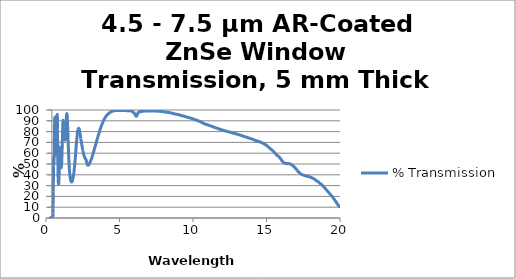
| Category | % Transmission |
|---|---|
| 0.35 | 0.622 |
| 0.351 | 0.641 |
| 0.352 | 1.043 |
| 0.353 | 0.702 |
| 0.354 | 0.658 |
| 0.355 | 0.296 |
| 0.356 | 0.783 |
| 0.357 | 0.188 |
| 0.358 | 0.807 |
| 0.359 | 0.011 |
| 0.36 | 1.343 |
| 0.361 | 0.038 |
| 0.362 | 1.088 |
| 0.363 | 0.859 |
| 0.364 | 0.007 |
| 0.365 | 0.479 |
| 0.366 | 0.336 |
| 0.367 | 0.471 |
| 0.368 | 0.921 |
| 0.369 | 0.149 |
| 0.37 | 0.717 |
| 0.371 | 0.17 |
| 0.372 | 0.52 |
| 0.373 | 0.762 |
| 0.374 | 0.137 |
| 0.375 | 0.491 |
| 0.376 | 0.288 |
| 0.377 | 0.409 |
| 0.378 | 0.55 |
| 0.379 | 0.34 |
| 0.38 | 0.217 |
| 0.381 | 0.222 |
| 0.382 | 0.535 |
| 0.383 | 0.464 |
| 0.384 | 0.695 |
| 0.385 | 0.316 |
| 0.386 | 0.381 |
| 0.387 | 0.144 |
| 0.388 | 0.62 |
| 0.389 | 0.097 |
| 0.39 | 0.343 |
| 0.391 | 0.156 |
| 0.392 | 0.131 |
| 0.393 | 0.247 |
| 0.394 | 0.219 |
| 0.395 | 0.235 |
| 0.396 | 0.12 |
| 0.397 | 0.05 |
| 0.398 | 0.304 |
| 0.399 | 0.075 |
| 0.4 | 0.185 |
| 0.401 | 0.137 |
| 0.402 | 0.178 |
| 0.403 | 0.201 |
| 0.404 | 0.224 |
| 0.405 | 0.262 |
| 0.406 | 0.268 |
| 0.407 | 0.17 |
| 0.408 | 0.143 |
| 0.409 | 0.1 |
| 0.41 | 0.095 |
| 0.411 | 0.242 |
| 0.412 | 0.115 |
| 0.413 | 0.222 |
| 0.414 | 0.034 |
| 0.415 | 0.177 |
| 0.416 | 0.094 |
| 0.417 | 0.139 |
| 0.418 | 0.282 |
| 0.419 | 0.142 |
| 0.42 | 0.172 |
| 0.421 | 0.243 |
| 0.422 | 0.192 |
| 0.423 | 0.189 |
| 0.424 | 0.047 |
| 0.425 | 0.104 |
| 0.426 | 0.083 |
| 0.427 | 0.033 |
| 0.428 | 0.165 |
| 0.429 | 0.156 |
| 0.43 | 0.144 |
| 0.431 | 0.17 |
| 0.432 | 0.025 |
| 0.433 | 0.143 |
| 0.434 | 0.084 |
| 0.435 | 0.104 |
| 0.436 | 0.087 |
| 0.437 | 0.074 |
| 0.438 | 0.094 |
| 0.439 | 0.131 |
| 0.44 | 0.077 |
| 0.441 | 0.123 |
| 0.442 | 0.116 |
| 0.443 | 0.131 |
| 0.444 | 0.124 |
| 0.445 | 0.087 |
| 0.446 | 0.091 |
| 0.447 | 0.134 |
| 0.448 | 0.118 |
| 0.449 | 0.089 |
| 0.45 | 0.075 |
| 0.451 | 0.109 |
| 0.452 | 0.083 |
| 0.453 | 0.099 |
| 0.454 | 0.085 |
| 0.455 | 0.077 |
| 0.456 | 0.111 |
| 0.457 | 0.106 |
| 0.458 | 0.095 |
| 0.459 | 0.07 |
| 0.46 | 0.059 |
| 0.461 | 0.089 |
| 0.462 | 0.067 |
| 0.463 | 0.06 |
| 0.464 | 0.119 |
| 0.465 | 0.03 |
| 0.466 | 0.042 |
| 0.467 | 0.033 |
| 0.468 | 0.027 |
| 0.469 | 0.054 |
| 0.47 | 0.06 |
| 0.471 | 0.103 |
| 0.472 | 0.075 |
| 0.473 | 0.064 |
| 0.474 | 0.247 |
| 0.475 | 0.811 |
| 0.476 | 1.718 |
| 0.477 | 2.88 |
| 0.478 | 4.327 |
| 0.479 | 5.922 |
| 0.48 | 7.427 |
| 0.481 | 8.758 |
| 0.482 | 10.011 |
| 0.483 | 11.176 |
| 0.484 | 12.182 |
| 0.485 | 13.087 |
| 0.486 | 13.987 |
| 0.487 | 14.818 |
| 0.488 | 15.672 |
| 0.489 | 16.561 |
| 0.49 | 17.527 |
| 0.491 | 18.45 |
| 0.492 | 19.474 |
| 0.493 | 20.628 |
| 0.494 | 21.798 |
| 0.495 | 23.055 |
| 0.496 | 24.372 |
| 0.497 | 25.851 |
| 0.498 | 27.406 |
| 0.499 | 29.061 |
| 0.5 | 30.764 |
| 0.501 | 32.55 |
| 0.502 | 34.49 |
| 0.503 | 36.36 |
| 0.504 | 38.292 |
| 0.505 | 40.34 |
| 0.506 | 42.312 |
| 0.507 | 44.207 |
| 0.508 | 46.035 |
| 0.509 | 47.838 |
| 0.51 | 49.408 |
| 0.511 | 50.927 |
| 0.512 | 52.253 |
| 0.513 | 53.315 |
| 0.514 | 54.255 |
| 0.515 | 54.926 |
| 0.516 | 55.442 |
| 0.517 | 55.776 |
| 0.518 | 55.905 |
| 0.519 | 55.85 |
| 0.52 | 55.672 |
| 0.521 | 55.437 |
| 0.522 | 55.036 |
| 0.523 | 54.64 |
| 0.524 | 54.144 |
| 0.525 | 53.622 |
| 0.526 | 53.096 |
| 0.527 | 52.569 |
| 0.528 | 52.063 |
| 0.529 | 51.6 |
| 0.53 | 51.223 |
| 0.531 | 50.827 |
| 0.532 | 50.54 |
| 0.533 | 50.308 |
| 0.534 | 50.131 |
| 0.535 | 50.061 |
| 0.536 | 50.017 |
| 0.537 | 50.035 |
| 0.538 | 50.125 |
| 0.539 | 50.334 |
| 0.54 | 50.589 |
| 0.541 | 50.858 |
| 0.542 | 51.243 |
| 0.543 | 51.7 |
| 0.544 | 52.147 |
| 0.545 | 52.698 |
| 0.546 | 53.315 |
| 0.547 | 53.894 |
| 0.548 | 54.654 |
| 0.549 | 55.348 |
| 0.55 | 56.122 |
| 0.551 | 56.925 |
| 0.552 | 57.751 |
| 0.553 | 58.611 |
| 0.554 | 59.498 |
| 0.555 | 60.395 |
| 0.556 | 61.295 |
| 0.557 | 62.173 |
| 0.558 | 63.071 |
| 0.559 | 64 |
| 0.56 | 64.869 |
| 0.561 | 65.775 |
| 0.562 | 66.648 |
| 0.563 | 67.501 |
| 0.564 | 68.356 |
| 0.565 | 69.234 |
| 0.566 | 70.058 |
| 0.567 | 70.918 |
| 0.568 | 71.679 |
| 0.569 | 72.475 |
| 0.57 | 73.263 |
| 0.571 | 74.058 |
| 0.572 | 74.858 |
| 0.573 | 75.615 |
| 0.574 | 76.367 |
| 0.575 | 77.154 |
| 0.576 | 77.917 |
| 0.577 | 78.713 |
| 0.578 | 79.461 |
| 0.579 | 80.297 |
| 0.58 | 81.093 |
| 0.581 | 81.899 |
| 0.582 | 82.683 |
| 0.583 | 83.516 |
| 0.584 | 84.277 |
| 0.585 | 85.175 |
| 0.586 | 85.951 |
| 0.587 | 86.771 |
| 0.588 | 87.523 |
| 0.589 | 88.298 |
| 0.59 | 89.048 |
| 0.591 | 89.749 |
| 0.592 | 90.365 |
| 0.593 | 91.021 |
| 0.594 | 91.563 |
| 0.595 | 92.03 |
| 0.596 | 92.495 |
| 0.597 | 92.785 |
| 0.598 | 93.016 |
| 0.599 | 93.155 |
| 0.6 | 93.202 |
| 0.601 | 93.155 |
| 0.602 | 92.97 |
| 0.603 | 92.643 |
| 0.604 | 92.262 |
| 0.605 | 91.773 |
| 0.606 | 91.129 |
| 0.607 | 90.437 |
| 0.608 | 89.603 |
| 0.609 | 88.692 |
| 0.61 | 87.733 |
| 0.611 | 86.642 |
| 0.612 | 85.543 |
| 0.613 | 84.308 |
| 0.614 | 83.009 |
| 0.615 | 81.828 |
| 0.616 | 80.553 |
| 0.617 | 79.191 |
| 0.618 | 77.889 |
| 0.619 | 76.625 |
| 0.62 | 75.316 |
| 0.621 | 74.07 |
| 0.622 | 72.768 |
| 0.623 | 71.61 |
| 0.624 | 70.429 |
| 0.625 | 69.253 |
| 0.626 | 68.183 |
| 0.627 | 67.163 |
| 0.628 | 66.17 |
| 0.629 | 65.205 |
| 0.63 | 64.363 |
| 0.631 | 63.54 |
| 0.632 | 62.766 |
| 0.633 | 62.074 |
| 0.634 | 61.401 |
| 0.635 | 60.812 |
| 0.636 | 60.278 |
| 0.637 | 59.794 |
| 0.638 | 59.419 |
| 0.639 | 59.066 |
| 0.64 | 58.8 |
| 0.641 | 58.555 |
| 0.642 | 58.346 |
| 0.643 | 58.222 |
| 0.644 | 58.158 |
| 0.645 | 58.195 |
| 0.646 | 58.217 |
| 0.647 | 58.335 |
| 0.648 | 58.513 |
| 0.649 | 58.747 |
| 0.65 | 59.025 |
| 0.651 | 59.369 |
| 0.652 | 59.74 |
| 0.653 | 60.177 |
| 0.654 | 60.684 |
| 0.655 | 61.211 |
| 0.656 | 61.784 |
| 0.657 | 62.5 |
| 0.658 | 63.172 |
| 0.659 | 63.886 |
| 0.66 | 64.747 |
| 0.661 | 65.573 |
| 0.662 | 66.471 |
| 0.663 | 67.424 |
| 0.664 | 68.455 |
| 0.665 | 69.471 |
| 0.666 | 70.435 |
| 0.667 | 71.548 |
| 0.668 | 72.732 |
| 0.669 | 73.846 |
| 0.67 | 75.023 |
| 0.671 | 76.219 |
| 0.672 | 77.379 |
| 0.673 | 78.539 |
| 0.674 | 79.747 |
| 0.675 | 80.925 |
| 0.676 | 82.14 |
| 0.677 | 83.269 |
| 0.678 | 84.38 |
| 0.679 | 85.522 |
| 0.68 | 86.579 |
| 0.681 | 87.6 |
| 0.682 | 88.518 |
| 0.683 | 89.424 |
| 0.684 | 90.239 |
| 0.685 | 90.909 |
| 0.686 | 91.669 |
| 0.687 | 92.215 |
| 0.688 | 92.76 |
| 0.689 | 93.141 |
| 0.69 | 93.524 |
| 0.691 | 93.811 |
| 0.692 | 93.951 |
| 0.693 | 94.011 |
| 0.694 | 94.034 |
| 0.695 | 93.946 |
| 0.696 | 93.864 |
| 0.697 | 93.553 |
| 0.698 | 93.362 |
| 0.699 | 92.963 |
| 0.7 | 92.574 |
| 0.701 | 92.19 |
| 0.702 | 91.644 |
| 0.703 | 91.155 |
| 0.704 | 90.585 |
| 0.705 | 90.09 |
| 0.706 | 89.506 |
| 0.707 | 88.925 |
| 0.708 | 88.363 |
| 0.709 | 87.723 |
| 0.71 | 87.126 |
| 0.711 | 86.614 |
| 0.712 | 86.009 |
| 0.713 | 85.489 |
| 0.714 | 85.001 |
| 0.715 | 84.487 |
| 0.716 | 84.026 |
| 0.717 | 83.557 |
| 0.718 | 83.17 |
| 0.719 | 82.749 |
| 0.72 | 82.457 |
| 0.721 | 82.164 |
| 0.722 | 81.858 |
| 0.723 | 81.624 |
| 0.724 | 81.435 |
| 0.725 | 81.241 |
| 0.726 | 81.148 |
| 0.727 | 81.085 |
| 0.728 | 81.034 |
| 0.729 | 81.033 |
| 0.73 | 81.074 |
| 0.731 | 81.171 |
| 0.732 | 81.29 |
| 0.733 | 81.47 |
| 0.734 | 81.657 |
| 0.735 | 81.908 |
| 0.736 | 82.177 |
| 0.737 | 82.509 |
| 0.738 | 82.84 |
| 0.739 | 83.275 |
| 0.74 | 83.693 |
| 0.741 | 84.134 |
| 0.742 | 84.654 |
| 0.743 | 85.125 |
| 0.744 | 85.682 |
| 0.745 | 86.264 |
| 0.746 | 86.833 |
| 0.747 | 87.431 |
| 0.748 | 88.057 |
| 0.749 | 88.646 |
| 0.75 | 89.282 |
| 0.751 | 89.895 |
| 0.752 | 90.509 |
| 0.753 | 91.104 |
| 0.754 | 91.754 |
| 0.755 | 92.333 |
| 0.756 | 92.858 |
| 0.757 | 93.406 |
| 0.758 | 93.873 |
| 0.759 | 94.31 |
| 0.76 | 94.722 |
| 0.761 | 95.073 |
| 0.762 | 95.385 |
| 0.763 | 95.599 |
| 0.764 | 95.73 |
| 0.765 | 95.823 |
| 0.766 | 95.821 |
| 0.767 | 95.761 |
| 0.768 | 95.607 |
| 0.769 | 95.348 |
| 0.77 | 95.02 |
| 0.771 | 94.581 |
| 0.772 | 94.12 |
| 0.773 | 93.485 |
| 0.774 | 92.801 |
| 0.775 | 92.064 |
| 0.776 | 91.185 |
| 0.777 | 90.261 |
| 0.778 | 89.322 |
| 0.779 | 88.216 |
| 0.78 | 87.063 |
| 0.781 | 85.899 |
| 0.782 | 84.646 |
| 0.783 | 83.358 |
| 0.784 | 82.11 |
| 0.785 | 80.699 |
| 0.786 | 79.288 |
| 0.787 | 77.94 |
| 0.788 | 76.503 |
| 0.789 | 75.068 |
| 0.79 | 73.629 |
| 0.791 | 72.203 |
| 0.792 | 70.732 |
| 0.793 | 69.316 |
| 0.794 | 67.929 |
| 0.795 | 66.517 |
| 0.796 | 65.138 |
| 0.797 | 63.777 |
| 0.798 | 62.424 |
| 0.799 | 61.129 |
| 0.8 | 59.805 |
| 0.801 | 58.58 |
| 0.802 | 57.343 |
| 0.803 | 56.199 |
| 0.804 | 55.011 |
| 0.805 | 53.863 |
| 0.806 | 52.819 |
| 0.807 | 51.76 |
| 0.808 | 50.721 |
| 0.809 | 49.74 |
| 0.81 | 48.803 |
| 0.811 | 47.849 |
| 0.812 | 46.968 |
| 0.813 | 46.14 |
| 0.814 | 45.291 |
| 0.815 | 44.486 |
| 0.816 | 43.745 |
| 0.817 | 42.993 |
| 0.818 | 42.273 |
| 0.819 | 41.629 |
| 0.82 | 40.962 |
| 0.821 | 40.337 |
| 0.822 | 39.749 |
| 0.823 | 39.184 |
| 0.824 | 38.614 |
| 0.825 | 38.113 |
| 0.826 | 37.624 |
| 0.827 | 37.137 |
| 0.828 | 36.693 |
| 0.829 | 36.272 |
| 0.83 | 35.851 |
| 0.831 | 35.476 |
| 0.832 | 35.119 |
| 0.833 | 34.767 |
| 0.834 | 34.439 |
| 0.835 | 34.133 |
| 0.836 | 33.845 |
| 0.837 | 33.573 |
| 0.838 | 33.33 |
| 0.839 | 33.088 |
| 0.84 | 32.863 |
| 0.841 | 32.676 |
| 0.842 | 32.474 |
| 0.843 | 32.299 |
| 0.844 | 32.15 |
| 0.845 | 32.01 |
| 0.846 | 31.889 |
| 0.847 | 31.771 |
| 0.848 | 31.684 |
| 0.849 | 31.588 |
| 0.85 | 31.514 |
| 0.851 | 31.47 |
| 0.852 | 31.422 |
| 0.853 | 31.395 |
| 0.854 | 31.377 |
| 0.855 | 31.376 |
| 0.856 | 31.386 |
| 0.857 | 31.402 |
| 0.858 | 31.446 |
| 0.859 | 31.497 |
| 0.86 | 31.547 |
| 0.861 | 31.63 |
| 0.862 | 31.71 |
| 0.863 | 31.806 |
| 0.864 | 31.92 |
| 0.865 | 32.035 |
| 0.866 | 32.167 |
| 0.867 | 32.314 |
| 0.868 | 32.479 |
| 0.869 | 32.652 |
| 0.87 | 32.826 |
| 0.871 | 33.034 |
| 0.872 | 33.235 |
| 0.873 | 33.452 |
| 0.874 | 33.678 |
| 0.875 | 33.929 |
| 0.876 | 34.184 |
| 0.877 | 34.455 |
| 0.878 | 34.735 |
| 0.879 | 35.018 |
| 0.88 | 35.335 |
| 0.881 | 35.664 |
| 0.882 | 35.983 |
| 0.883 | 36.33 |
| 0.884 | 36.679 |
| 0.885 | 37.051 |
| 0.886 | 37.43 |
| 0.887 | 37.826 |
| 0.888 | 38.217 |
| 0.889 | 38.635 |
| 0.89 | 39.073 |
| 0.891 | 39.504 |
| 0.892 | 39.949 |
| 0.893 | 40.426 |
| 0.894 | 40.902 |
| 0.895 | 41.374 |
| 0.896 | 41.88 |
| 0.897 | 42.381 |
| 0.898 | 42.887 |
| 0.899 | 43.424 |
| 0.9 | 43.971 |
| 0.901 | 44.498 |
| 0.902 | 45.056 |
| 0.903 | 45.621 |
| 0.904 | 46.189 |
| 0.905 | 46.772 |
| 0.906 | 47.38 |
| 0.907 | 47.948 |
| 0.908 | 48.543 |
| 0.909 | 49.156 |
| 0.91 | 49.753 |
| 0.911 | 50.356 |
| 0.912 | 50.99 |
| 0.913 | 51.597 |
| 0.914 | 52.194 |
| 0.915 | 52.798 |
| 0.916 | 53.434 |
| 0.917 | 54.014 |
| 0.918 | 54.644 |
| 0.919 | 55.246 |
| 0.92 | 55.816 |
| 0.921 | 56.401 |
| 0.922 | 56.997 |
| 0.923 | 57.542 |
| 0.924 | 58.102 |
| 0.925 | 58.668 |
| 0.926 | 59.186 |
| 0.927 | 59.703 |
| 0.928 | 60.21 |
| 0.929 | 60.673 |
| 0.93 | 61.126 |
| 0.931 | 61.606 |
| 0.932 | 62.005 |
| 0.933 | 62.389 |
| 0.934 | 62.782 |
| 0.935 | 63.143 |
| 0.936 | 63.462 |
| 0.937 | 63.766 |
| 0.938 | 64.063 |
| 0.939 | 64.308 |
| 0.94 | 64.525 |
| 0.941 | 64.725 |
| 0.942 | 64.909 |
| 0.943 | 65.052 |
| 0.944 | 65.178 |
| 0.945 | 65.268 |
| 0.946 | 65.331 |
| 0.947 | 65.384 |
| 0.948 | 65.392 |
| 0.949 | 65.386 |
| 0.95 | 65.336 |
| 0.951 | 65.299 |
| 0.952 | 65.204 |
| 0.953 | 65.103 |
| 0.954 | 64.962 |
| 0.955 | 64.82 |
| 0.956 | 64.642 |
| 0.957 | 64.439 |
| 0.958 | 64.25 |
| 0.959 | 64.015 |
| 0.96 | 63.765 |
| 0.961 | 63.522 |
| 0.962 | 63.23 |
| 0.963 | 62.946 |
| 0.964 | 62.658 |
| 0.965 | 62.346 |
| 0.966 | 62.02 |
| 0.967 | 61.698 |
| 0.968 | 61.353 |
| 0.969 | 60.993 |
| 0.97 | 60.644 |
| 0.971 | 60.285 |
| 0.972 | 59.931 |
| 0.973 | 59.55 |
| 0.974 | 59.193 |
| 0.975 | 58.805 |
| 0.976 | 58.428 |
| 0.977 | 58.063 |
| 0.978 | 57.701 |
| 0.979 | 57.308 |
| 0.98 | 56.928 |
| 0.981 | 56.58 |
| 0.982 | 56.187 |
| 0.983 | 55.842 |
| 0.984 | 55.478 |
| 0.985 | 55.123 |
| 0.986 | 54.773 |
| 0.987 | 54.426 |
| 0.988 | 54.069 |
| 0.989 | 53.762 |
| 0.99 | 53.407 |
| 0.991 | 53.089 |
| 0.992 | 52.779 |
| 0.993 | 52.457 |
| 0.994 | 52.16 |
| 0.995 | 51.859 |
| 0.996 | 51.565 |
| 0.997 | 51.285 |
| 0.998 | 51.015 |
| 0.999 | 50.761 |
| 1.0 | 50.486 |
| 1.001 | 50.238 |
| 1.002 | 49.999 |
| 1.003 | 49.772 |
| 1.004 | 49.534 |
| 1.005 | 49.327 |
| 1.006 | 49.119 |
| 1.007 | 48.899 |
| 1.008 | 48.717 |
| 1.009 | 48.541 |
| 1.01 | 48.361 |
| 1.011 | 48.191 |
| 1.012 | 48.033 |
| 1.013 | 47.879 |
| 1.014 | 47.737 |
| 1.015 | 47.605 |
| 1.016 | 47.485 |
| 1.017 | 47.364 |
| 1.018 | 47.25 |
| 1.019 | 47.154 |
| 1.02 | 47.054 |
| 1.021 | 46.977 |
| 1.022 | 46.9 |
| 1.023 | 46.829 |
| 1.024 | 46.769 |
| 1.025 | 46.725 |
| 1.026 | 46.67 |
| 1.027 | 46.651 |
| 1.028 | 46.595 |
| 1.029 | 46.601 |
| 1.03 | 46.58 |
| 1.031 | 46.578 |
| 1.032 | 46.574 |
| 1.033 | 46.597 |
| 1.034 | 46.617 |
| 1.035 | 46.645 |
| 1.036 | 46.681 |
| 1.037 | 46.737 |
| 1.038 | 46.798 |
| 1.039 | 46.848 |
| 1.04 | 46.915 |
| 1.041 | 46.993 |
| 1.042 | 47.08 |
| 1.043 | 47.169 |
| 1.044 | 47.273 |
| 1.045 | 47.377 |
| 1.046 | 47.492 |
| 1.047 | 47.619 |
| 1.048 | 47.744 |
| 1.049 | 47.883 |
| 1.05 | 48.129 |
| 1.051 | 48.298 |
| 1.052 | 48.46 |
| 1.053 | 48.631 |
| 1.054 | 48.803 |
| 1.055 | 48.997 |
| 1.056 | 49.18 |
| 1.057 | 49.386 |
| 1.058 | 49.595 |
| 1.059 | 49.807 |
| 1.06 | 50.042 |
| 1.061 | 50.259 |
| 1.062 | 50.503 |
| 1.063 | 50.758 |
| 1.064 | 51.013 |
| 1.065 | 51.283 |
| 1.066 | 51.551 |
| 1.067 | 51.829 |
| 1.068 | 52.118 |
| 1.069 | 52.408 |
| 1.07 | 52.723 |
| 1.071 | 53.033 |
| 1.072 | 53.346 |
| 1.073 | 53.675 |
| 1.074 | 54.01 |
| 1.075 | 54.349 |
| 1.076 | 54.701 |
| 1.077 | 55.066 |
| 1.078 | 55.426 |
| 1.079 | 55.782 |
| 1.08 | 56.183 |
| 1.081 | 56.554 |
| 1.082 | 56.966 |
| 1.083 | 57.349 |
| 1.084 | 57.746 |
| 1.085 | 58.177 |
| 1.086 | 58.609 |
| 1.087 | 59.008 |
| 1.088 | 59.441 |
| 1.089 | 59.895 |
| 1.09 | 60.341 |
| 1.091 | 60.792 |
| 1.092 | 61.258 |
| 1.093 | 61.704 |
| 1.094 | 62.17 |
| 1.095 | 62.647 |
| 1.096 | 63.148 |
| 1.097 | 63.606 |
| 1.098 | 64.115 |
| 1.099 | 64.59 |
| 1.1 | 65.115 |
| 1.101 | 65.58 |
| 1.102 | 66.162 |
| 1.103 | 66.595 |
| 1.104 | 67.144 |
| 1.105 | 67.654 |
| 1.106 | 68.181 |
| 1.107 | 68.712 |
| 1.108 | 69.231 |
| 1.109 | 69.75 |
| 1.11 | 70.269 |
| 1.111 | 70.818 |
| 1.112 | 71.335 |
| 1.113 | 71.856 |
| 1.114 | 72.428 |
| 1.115 | 72.951 |
| 1.116 | 73.445 |
| 1.117 | 74.006 |
| 1.118 | 74.545 |
| 1.119 | 75 |
| 1.12 | 75.599 |
| 1.121 | 76.137 |
| 1.122 | 76.588 |
| 1.123 | 77.189 |
| 1.124 | 77.66 |
| 1.125 | 78.132 |
| 1.126 | 78.68 |
| 1.127 | 79.166 |
| 1.128 | 79.673 |
| 1.129 | 80.119 |
| 1.13 | 80.621 |
| 1.131 | 81.111 |
| 1.132 | 81.512 |
| 1.133 | 82.031 |
| 1.134 | 82.458 |
| 1.135 | 82.872 |
| 1.136 | 83.327 |
| 1.137 | 83.731 |
| 1.138 | 84.14 |
| 1.139 | 84.558 |
| 1.14 | 84.948 |
| 1.141 | 85.318 |
| 1.142 | 85.666 |
| 1.143 | 86.019 |
| 1.144 | 86.371 |
| 1.145 | 86.703 |
| 1.146 | 87.022 |
| 1.147 | 87.302 |
| 1.148 | 87.635 |
| 1.149 | 87.9 |
| 1.15 | 88.149 |
| 1.151 | 88.437 |
| 1.152 | 88.656 |
| 1.153 | 88.83 |
| 1.154 | 89.109 |
| 1.155 | 89.256 |
| 1.156 | 89.38 |
| 1.157 | 89.631 |
| 1.158 | 89.74 |
| 1.159 | 89.838 |
| 1.16 | 89.992 |
| 1.161 | 90.178 |
| 1.162 | 90.188 |
| 1.163 | 90.284 |
| 1.164 | 90.346 |
| 1.165 | 90.386 |
| 1.166 | 90.406 |
| 1.167 | 90.452 |
| 1.168 | 90.416 |
| 1.169 | 90.432 |
| 1.17 | 90.453 |
| 1.171 | 90.391 |
| 1.172 | 90.329 |
| 1.173 | 90.301 |
| 1.174 | 90.211 |
| 1.175 | 90.125 |
| 1.176 | 90.029 |
| 1.177 | 89.918 |
| 1.178 | 89.842 |
| 1.179 | 89.685 |
| 1.18 | 89.537 |
| 1.181 | 89.403 |
| 1.182 | 89.236 |
| 1.183 | 89.139 |
| 1.184 | 88.908 |
| 1.185 | 88.722 |
| 1.186 | 88.557 |
| 1.187 | 88.363 |
| 1.188 | 88.17 |
| 1.189 | 87.924 |
| 1.19 | 87.717 |
| 1.191 | 87.488 |
| 1.192 | 87.306 |
| 1.193 | 87.029 |
| 1.194 | 86.804 |
| 1.195 | 86.578 |
| 1.196 | 86.335 |
| 1.197 | 86.051 |
| 1.198 | 85.839 |
| 1.199 | 85.556 |
| 1.2 | 85.314 |
| 1.201 | 85.047 |
| 1.202 | 84.695 |
| 1.203 | 84.527 |
| 1.204 | 84.266 |
| 1.205 | 84.071 |
| 1.206 | 83.722 |
| 1.207 | 83.45 |
| 1.208 | 83.2 |
| 1.209 | 82.802 |
| 1.21 | 82.685 |
| 1.211 | 82.388 |
| 1.212 | 82.112 |
| 1.213 | 81.853 |
| 1.214 | 81.579 |
| 1.215 | 81.286 |
| 1.216 | 81.052 |
| 1.217 | 80.796 |
| 1.218 | 80.561 |
| 1.219 | 80.234 |
| 1.22 | 80.034 |
| 1.221 | 79.767 |
| 1.222 | 79.511 |
| 1.223 | 79.303 |
| 1.224 | 79.049 |
| 1.225 | 78.725 |
| 1.226 | 78.552 |
| 1.227 | 78.299 |
| 1.228 | 78.095 |
| 1.229 | 77.873 |
| 1.23 | 77.614 |
| 1.231 | 77.339 |
| 1.232 | 77.172 |
| 1.233 | 76.993 |
| 1.234 | 76.772 |
| 1.235 | 76.541 |
| 1.236 | 76.339 |
| 1.237 | 76.092 |
| 1.238 | 75.936 |
| 1.239 | 75.799 |
| 1.24 | 75.554 |
| 1.241 | 75.373 |
| 1.242 | 75.2 |
| 1.243 | 74.984 |
| 1.244 | 74.862 |
| 1.245 | 74.708 |
| 1.246 | 74.535 |
| 1.247 | 74.389 |
| 1.248 | 74.241 |
| 1.249 | 74.116 |
| 1.25 | 74.02 |
| 1.251 | 73.802 |
| 1.252 | 73.704 |
| 1.253 | 73.586 |
| 1.254 | 73.457 |
| 1.255 | 73.344 |
| 1.256 | 73.233 |
| 1.257 | 73.091 |
| 1.258 | 73.033 |
| 1.259 | 72.955 |
| 1.26 | 72.844 |
| 1.261 | 72.766 |
| 1.262 | 72.681 |
| 1.263 | 72.625 |
| 1.264 | 72.535 |
| 1.265 | 72.485 |
| 1.266 | 72.373 |
| 1.267 | 72.348 |
| 1.268 | 72.312 |
| 1.269 | 72.275 |
| 1.27 | 72.221 |
| 1.271 | 72.195 |
| 1.272 | 72.138 |
| 1.273 | 72.104 |
| 1.274 | 72.103 |
| 1.275 | 72.101 |
| 1.276 | 72.095 |
| 1.277 | 72.076 |
| 1.278 | 72.086 |
| 1.279 | 72.08 |
| 1.28 | 72.08 |
| 1.281 | 72.122 |
| 1.282 | 72.106 |
| 1.283 | 72.166 |
| 1.284 | 72.183 |
| 1.285 | 72.214 |
| 1.286 | 72.264 |
| 1.287 | 72.291 |
| 1.288 | 72.331 |
| 1.289 | 72.366 |
| 1.29 | 72.445 |
| 1.291 | 72.515 |
| 1.292 | 72.582 |
| 1.293 | 72.642 |
| 1.294 | 72.718 |
| 1.295 | 72.798 |
| 1.296 | 72.871 |
| 1.297 | 72.975 |
| 1.298 | 73.079 |
| 1.299 | 73.158 |
| 1.3 | 73.268 |
| 1.301 | 73.368 |
| 1.302 | 73.472 |
| 1.303 | 73.605 |
| 1.304 | 73.721 |
| 1.305 | 73.857 |
| 1.306 | 74.005 |
| 1.307 | 74.114 |
| 1.308 | 74.248 |
| 1.309 | 74.399 |
| 1.31 | 74.525 |
| 1.311 | 74.714 |
| 1.312 | 74.862 |
| 1.313 | 75.018 |
| 1.314 | 75.181 |
| 1.315 | 75.341 |
| 1.316 | 75.472 |
| 1.317 | 75.693 |
| 1.318 | 75.89 |
| 1.319 | 76.067 |
| 1.32 | 76.242 |
| 1.321 | 76.439 |
| 1.322 | 76.628 |
| 1.323 | 76.865 |
| 1.324 | 77.022 |
| 1.325 | 77.242 |
| 1.326 | 77.448 |
| 1.327 | 77.662 |
| 1.328 | 77.879 |
| 1.329 | 78.104 |
| 1.33 | 78.329 |
| 1.331 | 78.541 |
| 1.332 | 78.787 |
| 1.333 | 79.023 |
| 1.334 | 79.229 |
| 1.335 | 79.478 |
| 1.336 | 79.72 |
| 1.337 | 79.96 |
| 1.338 | 80.213 |
| 1.339 | 80.472 |
| 1.34 | 80.71 |
| 1.341 | 80.981 |
| 1.342 | 81.201 |
| 1.343 | 81.439 |
| 1.344 | 81.776 |
| 1.345 | 81.988 |
| 1.346 | 82.251 |
| 1.347 | 82.512 |
| 1.348 | 82.817 |
| 1.349 | 83.073 |
| 1.35 | 83.326 |
| 1.351 | 83.596 |
| 1.352 | 83.904 |
| 1.353 | 84.119 |
| 1.354 | 84.422 |
| 1.355 | 84.673 |
| 1.356 | 84.958 |
| 1.357 | 85.218 |
| 1.358 | 85.515 |
| 1.359 | 85.742 |
| 1.36 | 86.04 |
| 1.361 | 86.36 |
| 1.362 | 86.613 |
| 1.363 | 86.885 |
| 1.364 | 87.175 |
| 1.365 | 87.44 |
| 1.366 | 87.738 |
| 1.367 | 88.013 |
| 1.368 | 88.298 |
| 1.369 | 88.576 |
| 1.37 | 88.859 |
| 1.371 | 89.102 |
| 1.372 | 89.378 |
| 1.373 | 89.654 |
| 1.374 | 89.943 |
| 1.375 | 90.146 |
| 1.376 | 90.42 |
| 1.377 | 90.696 |
| 1.378 | 90.923 |
| 1.379 | 91.135 |
| 1.38 | 91.398 |
| 1.381 | 91.65 |
| 1.382 | 91.882 |
| 1.383 | 92.154 |
| 1.384 | 92.349 |
| 1.385 | 92.647 |
| 1.386 | 92.839 |
| 1.387 | 93.011 |
| 1.388 | 93.264 |
| 1.389 | 93.473 |
| 1.39 | 93.662 |
| 1.391 | 93.863 |
| 1.392 | 94.067 |
| 1.393 | 94.239 |
| 1.394 | 94.432 |
| 1.395 | 94.658 |
| 1.396 | 94.762 |
| 1.397 | 94.877 |
| 1.398 | 95.094 |
| 1.399 | 95.26 |
| 1.4 | 95.421 |
| 1.401 | 95.534 |
| 1.402 | 95.64 |
| 1.403 | 95.803 |
| 1.404 | 95.93 |
| 1.405 | 96.032 |
| 1.406 | 96.089 |
| 1.407 | 96.231 |
| 1.408 | 96.309 |
| 1.409 | 96.389 |
| 1.41 | 96.46 |
| 1.411 | 96.521 |
| 1.412 | 96.565 |
| 1.413 | 96.603 |
| 1.414 | 96.625 |
| 1.415 | 96.669 |
| 1.416 | 96.656 |
| 1.417 | 96.705 |
| 1.418 | 96.705 |
| 1.419 | 96.648 |
| 1.42 | 96.649 |
| 1.421 | 96.621 |
| 1.422 | 96.625 |
| 1.423 | 96.532 |
| 1.424 | 96.49 |
| 1.425 | 96.433 |
| 1.426 | 96.352 |
| 1.427 | 96.272 |
| 1.428 | 96.205 |
| 1.429 | 96.097 |
| 1.43 | 95.987 |
| 1.431 | 95.855 |
| 1.432 | 95.749 |
| 1.433 | 95.633 |
| 1.434 | 95.495 |
| 1.435 | 95.339 |
| 1.436 | 95.191 |
| 1.437 | 95.012 |
| 1.438 | 94.822 |
| 1.439 | 94.635 |
| 1.44 | 94.439 |
| 1.441 | 94.238 |
| 1.442 | 94.004 |
| 1.443 | 93.806 |
| 1.444 | 93.573 |
| 1.445 | 93.348 |
| 1.446 | 93.109 |
| 1.447 | 92.885 |
| 1.448 | 92.616 |
| 1.449 | 92.347 |
| 1.45 | 92.097 |
| 1.451 | 91.813 |
| 1.452 | 91.529 |
| 1.453 | 91.225 |
| 1.454 | 90.964 |
| 1.455 | 90.644 |
| 1.456 | 90.386 |
| 1.457 | 90.02 |
| 1.458 | 89.692 |
| 1.459 | 89.387 |
| 1.46 | 89.044 |
| 1.461 | 88.698 |
| 1.462 | 88.37 |
| 1.463 | 88.045 |
| 1.464 | 87.683 |
| 1.465 | 87.312 |
| 1.466 | 86.954 |
| 1.467 | 86.607 |
| 1.468 | 86.25 |
| 1.469 | 85.832 |
| 1.47 | 85.458 |
| 1.471 | 85.089 |
| 1.472 | 84.738 |
| 1.473 | 84.35 |
| 1.474 | 83.955 |
| 1.475 | 83.554 |
| 1.476 | 83.16 |
| 1.477 | 82.758 |
| 1.478 | 82.379 |
| 1.479 | 81.982 |
| 1.48 | 81.582 |
| 1.481 | 81.137 |
| 1.482 | 80.788 |
| 1.483 | 80.333 |
| 1.484 | 79.974 |
| 1.485 | 79.56 |
| 1.486 | 79.124 |
| 1.487 | 78.706 |
| 1.488 | 78.3 |
| 1.489 | 77.88 |
| 1.49 | 77.487 |
| 1.491 | 77.064 |
| 1.492 | 76.656 |
| 1.493 | 76.26 |
| 1.494 | 75.81 |
| 1.495 | 75.411 |
| 1.496 | 74.973 |
| 1.497 | 74.584 |
| 1.498 | 74.174 |
| 1.499 | 73.777 |
| 1.5 | 73.332 |
| 1.501 | 72.928 |
| 1.502 | 72.531 |
| 1.503 | 72.097 |
| 1.504 | 71.705 |
| 1.505 | 71.303 |
| 1.506 | 70.903 |
| 1.507 | 70.465 |
| 1.508 | 70.091 |
| 1.509 | 69.684 |
| 1.51 | 69.302 |
| 1.511 | 68.897 |
| 1.512 | 68.482 |
| 1.513 | 68.102 |
| 1.514 | 67.715 |
| 1.515 | 67.348 |
| 1.516 | 66.931 |
| 1.517 | 66.569 |
| 1.518 | 66.155 |
| 1.519 | 65.758 |
| 1.52 | 65.387 |
| 1.521 | 65.037 |
| 1.522 | 64.655 |
| 1.523 | 64.281 |
| 1.524 | 63.897 |
| 1.525 | 63.564 |
| 1.526 | 63.179 |
| 1.527 | 62.811 |
| 1.528 | 62.463 |
| 1.529 | 62.118 |
| 1.53 | 61.735 |
| 1.531 | 61.39 |
| 1.532 | 61.068 |
| 1.533 | 60.699 |
| 1.534 | 60.38 |
| 1.535 | 60.008 |
| 1.536 | 59.704 |
| 1.537 | 59.336 |
| 1.538 | 59.01 |
| 1.539 | 58.686 |
| 1.54 | 58.355 |
| 1.541 | 58.024 |
| 1.542 | 57.73 |
| 1.543 | 57.389 |
| 1.544 | 57.016 |
| 1.545 | 56.777 |
| 1.546 | 56.452 |
| 1.547 | 56.135 |
| 1.548 | 55.79 |
| 1.549 | 55.553 |
| 1.55 | 55.222 |
| 1.551 | 54.915 |
| 1.552 | 54.63 |
| 1.553 | 54.342 |
| 1.554 | 54.053 |
| 1.555 | 53.786 |
| 1.556 | 53.492 |
| 1.557 | 53.199 |
| 1.558 | 52.926 |
| 1.559 | 52.648 |
| 1.56 | 52.367 |
| 1.561 | 52.114 |
| 1.562 | 51.839 |
| 1.563 | 51.556 |
| 1.564 | 51.32 |
| 1.565 | 51.041 |
| 1.566 | 50.784 |
| 1.567 | 50.564 |
| 1.568 | 50.289 |
| 1.569 | 50.023 |
| 1.57 | 49.799 |
| 1.571 | 49.575 |
| 1.572 | 49.291 |
| 1.573 | 49.053 |
| 1.574 | 48.855 |
| 1.575 | 48.594 |
| 1.576 | 48.317 |
| 1.577 | 48.158 |
| 1.578 | 47.901 |
| 1.579 | 47.667 |
| 1.58 | 47.459 |
| 1.581 | 47.254 |
| 1.582 | 47.006 |
| 1.583 | 46.796 |
| 1.584 | 46.616 |
| 1.585 | 46.377 |
| 1.586 | 46.164 |
| 1.587 | 45.983 |
| 1.588 | 45.766 |
| 1.589 | 45.568 |
| 1.59 | 45.363 |
| 1.591 | 45.177 |
| 1.592 | 44.992 |
| 1.593 | 44.766 |
| 1.594 | 44.593 |
| 1.595 | 44.422 |
| 1.596 | 44.223 |
| 1.597 | 44.026 |
| 1.598 | 43.871 |
| 1.599 | 43.676 |
| 1.6 | 43.497 |
| 1.601 | 43.337 |
| 1.602 | 43.144 |
| 1.603 | 42.976 |
| 1.604 | 42.82 |
| 1.605 | 42.656 |
| 1.606 | 42.466 |
| 1.607 | 42.326 |
| 1.608 | 42.169 |
| 1.609 | 42.001 |
| 1.61 | 41.856 |
| 1.611 | 41.7 |
| 1.612 | 41.53 |
| 1.613 | 41.383 |
| 1.614 | 41.233 |
| 1.615 | 41.099 |
| 1.616 | 40.946 |
| 1.617 | 40.812 |
| 1.618 | 40.669 |
| 1.619 | 40.508 |
| 1.62 | 40.384 |
| 1.621 | 40.263 |
| 1.622 | 40.105 |
| 1.623 | 39.979 |
| 1.624 | 39.856 |
| 1.625 | 39.726 |
| 1.626 | 39.587 |
| 1.627 | 39.47 |
| 1.628 | 39.331 |
| 1.629 | 39.227 |
| 1.63 | 39.107 |
| 1.631 | 38.973 |
| 1.632 | 38.849 |
| 1.633 | 38.747 |
| 1.634 | 38.628 |
| 1.635 | 38.525 |
| 1.636 | 38.383 |
| 1.637 | 38.315 |
| 1.638 | 38.181 |
| 1.639 | 38.071 |
| 1.64 | 37.969 |
| 1.641 | 37.876 |
| 1.642 | 37.759 |
| 1.643 | 37.659 |
| 1.644 | 37.562 |
| 1.645 | 37.464 |
| 1.646 | 37.361 |
| 1.647 | 37.293 |
| 1.648 | 37.179 |
| 1.649 | 37.087 |
| 1.65 | 37.008 |
| 1.651 | 36.911 |
| 1.652 | 36.804 |
| 1.653 | 36.716 |
| 1.654 | 36.655 |
| 1.655 | 36.575 |
| 1.656 | 36.458 |
| 1.657 | 36.406 |
| 1.658 | 36.308 |
| 1.659 | 36.214 |
| 1.66 | 36.173 |
| 1.661 | 36.082 |
| 1.662 | 36.001 |
| 1.663 | 35.935 |
| 1.664 | 35.852 |
| 1.665 | 35.786 |
| 1.666 | 35.715 |
| 1.667 | 35.638 |
| 1.668 | 35.58 |
| 1.669 | 35.502 |
| 1.67 | 35.433 |
| 1.671 | 35.379 |
| 1.672 | 35.323 |
| 1.673 | 35.253 |
| 1.674 | 35.186 |
| 1.675 | 35.137 |
| 1.676 | 35.08 |
| 1.677 | 35.002 |
| 1.678 | 34.947 |
| 1.679 | 34.914 |
| 1.68 | 34.847 |
| 1.681 | 34.782 |
| 1.682 | 34.749 |
| 1.683 | 34.691 |
| 1.684 | 34.622 |
| 1.685 | 34.585 |
| 1.686 | 34.532 |
| 1.687 | 34.494 |
| 1.688 | 34.449 |
| 1.689 | 34.397 |
| 1.69 | 34.355 |
| 1.691 | 34.314 |
| 1.692 | 34.26 |
| 1.693 | 34.234 |
| 1.694 | 34.18 |
| 1.695 | 34.15 |
| 1.696 | 34.118 |
| 1.697 | 34.082 |
| 1.698 | 34.034 |
| 1.699 | 33.996 |
| 1.7 | 33.964 |
| 1.701 | 33.939 |
| 1.702 | 33.923 |
| 1.703 | 33.848 |
| 1.704 | 33.848 |
| 1.705 | 33.809 |
| 1.706 | 33.79 |
| 1.707 | 33.757 |
| 1.708 | 33.725 |
| 1.709 | 33.702 |
| 1.71 | 33.688 |
| 1.711 | 33.643 |
| 1.712 | 33.63 |
| 1.713 | 33.606 |
| 1.714 | 33.587 |
| 1.715 | 33.567 |
| 1.716 | 33.538 |
| 1.717 | 33.518 |
| 1.718 | 33.508 |
| 1.719 | 33.488 |
| 1.72 | 33.48 |
| 1.721 | 33.461 |
| 1.722 | 33.445 |
| 1.723 | 33.429 |
| 1.724 | 33.41 |
| 1.725 | 33.403 |
| 1.726 | 33.387 |
| 1.727 | 33.382 |
| 1.728 | 33.376 |
| 1.729 | 33.365 |
| 1.73 | 33.364 |
| 1.731 | 33.346 |
| 1.732 | 33.344 |
| 1.733 | 33.343 |
| 1.734 | 33.337 |
| 1.735 | 33.322 |
| 1.736 | 33.336 |
| 1.737 | 33.316 |
| 1.738 | 33.325 |
| 1.739 | 33.322 |
| 1.74 | 33.312 |
| 1.741 | 33.319 |
| 1.742 | 33.314 |
| 1.743 | 33.337 |
| 1.744 | 33.321 |
| 1.745 | 33.327 |
| 1.746 | 33.344 |
| 1.747 | 33.338 |
| 1.748 | 33.353 |
| 1.749 | 33.358 |
| 1.75 | 33.362 |
| 1.751 | 33.371 |
| 1.752 | 33.373 |
| 1.753 | 33.4 |
| 1.754 | 33.397 |
| 1.755 | 33.402 |
| 1.756 | 33.429 |
| 1.757 | 33.436 |
| 1.758 | 33.447 |
| 1.759 | 33.464 |
| 1.76 | 33.473 |
| 1.761 | 33.503 |
| 1.762 | 33.515 |
| 1.763 | 33.526 |
| 1.764 | 33.532 |
| 1.765 | 33.573 |
| 1.766 | 33.579 |
| 1.767 | 33.598 |
| 1.768 | 33.617 |
| 1.769 | 33.66 |
| 1.77 | 33.666 |
| 1.771 | 33.683 |
| 1.772 | 33.725 |
| 1.773 | 33.737 |
| 1.774 | 33.763 |
| 1.775 | 33.793 |
| 1.776 | 33.805 |
| 1.777 | 33.856 |
| 1.778 | 33.876 |
| 1.779 | 33.893 |
| 1.78 | 33.934 |
| 1.781 | 33.959 |
| 1.782 | 33.98 |
| 1.783 | 34.036 |
| 1.784 | 34.052 |
| 1.785 | 34.074 |
| 1.786 | 34.136 |
| 1.787 | 34.154 |
| 1.788 | 34.188 |
| 1.789 | 34.226 |
| 1.79 | 34.268 |
| 1.791 | 34.298 |
| 1.792 | 34.341 |
| 1.793 | 34.373 |
| 1.794 | 34.413 |
| 1.795 | 34.456 |
| 1.796 | 34.499 |
| 1.797 | 34.544 |
| 1.798 | 34.575 |
| 1.799 | 34.619 |
| 1.8 | 34.654 |
| 1.801 | 34.71 |
| 1.802 | 34.742 |
| 1.803 | 34.802 |
| 1.804 | 34.842 |
| 1.805 | 34.884 |
| 1.806 | 34.929 |
| 1.807 | 34.987 |
| 1.808 | 35.027 |
| 1.809 | 35.084 |
| 1.81 | 35.126 |
| 1.811 | 35.165 |
| 1.812 | 35.226 |
| 1.813 | 35.259 |
| 1.814 | 35.312 |
| 1.815 | 35.366 |
| 1.816 | 35.435 |
| 1.817 | 35.474 |
| 1.818 | 35.539 |
| 1.819 | 35.591 |
| 1.82 | 35.665 |
| 1.821 | 35.723 |
| 1.822 | 35.789 |
| 1.823 | 35.836 |
| 1.824 | 35.901 |
| 1.825 | 35.964 |
| 1.826 | 36.033 |
| 1.827 | 36.089 |
| 1.828 | 36.149 |
| 1.829 | 36.206 |
| 1.83 | 36.263 |
| 1.831 | 36.318 |
| 1.832 | 36.424 |
| 1.833 | 36.467 |
| 1.834 | 36.552 |
| 1.835 | 36.6 |
| 1.836 | 36.703 |
| 1.837 | 36.766 |
| 1.838 | 36.794 |
| 1.839 | 36.905 |
| 1.84 | 36.963 |
| 1.841 | 37.037 |
| 1.842 | 37.082 |
| 1.843 | 37.143 |
| 1.844 | 37.231 |
| 1.845 | 37.308 |
| 1.846 | 37.37 |
| 1.847 | 37.445 |
| 1.848 | 37.525 |
| 1.849 | 37.598 |
| 1.85 | 37.72 |
| 1.851 | 37.786 |
| 1.852 | 37.861 |
| 1.853 | 37.95 |
| 1.854 | 38.054 |
| 1.855 | 38.118 |
| 1.856 | 38.209 |
| 1.857 | 38.299 |
| 1.858 | 38.383 |
| 1.859 | 38.457 |
| 1.86 | 38.545 |
| 1.861 | 38.627 |
| 1.862 | 38.701 |
| 1.863 | 38.786 |
| 1.864 | 38.858 |
| 1.865 | 38.948 |
| 1.866 | 39.046 |
| 1.867 | 39.122 |
| 1.868 | 39.216 |
| 1.869 | 39.292 |
| 1.87 | 39.395 |
| 1.871 | 39.501 |
| 1.872 | 39.572 |
| 1.873 | 39.685 |
| 1.874 | 39.805 |
| 1.875 | 39.876 |
| 1.876 | 39.986 |
| 1.877 | 40.071 |
| 1.878 | 40.175 |
| 1.879 | 40.278 |
| 1.88 | 40.371 |
| 1.881 | 40.474 |
| 1.882 | 40.574 |
| 1.883 | 40.665 |
| 1.884 | 40.764 |
| 1.885 | 40.861 |
| 1.886 | 40.981 |
| 1.887 | 41.049 |
| 1.888 | 41.187 |
| 1.889 | 41.27 |
| 1.89 | 41.375 |
| 1.891 | 41.48 |
| 1.892 | 41.609 |
| 1.893 | 41.663 |
| 1.894 | 41.811 |
| 1.895 | 41.881 |
| 1.896 | 41.997 |
| 1.897 | 42.101 |
| 1.898 | 42.217 |
| 1.899 | 42.318 |
| 1.9 | 42.422 |
| 1.901 | 42.559 |
| 1.902 | 42.657 |
| 1.903 | 42.778 |
| 1.904 | 42.894 |
| 1.905 | 43.008 |
| 1.906 | 43.132 |
| 1.907 | 43.241 |
| 1.908 | 43.362 |
| 1.909 | 43.46 |
| 1.91 | 43.594 |
| 1.911 | 43.72 |
| 1.912 | 43.824 |
| 1.913 | 43.927 |
| 1.914 | 44.063 |
| 1.915 | 44.167 |
| 1.916 | 44.297 |
| 1.917 | 44.431 |
| 1.918 | 44.551 |
| 1.919 | 44.685 |
| 1.92 | 44.808 |
| 1.921 | 44.943 |
| 1.922 | 45.062 |
| 1.923 | 45.188 |
| 1.924 | 45.299 |
| 1.925 | 45.442 |
| 1.926 | 45.579 |
| 1.927 | 45.691 |
| 1.928 | 45.822 |
| 1.929 | 45.962 |
| 1.93 | 46.076 |
| 1.931 | 46.229 |
| 1.932 | 46.357 |
| 1.933 | 46.494 |
| 1.934 | 46.624 |
| 1.935 | 46.765 |
| 1.936 | 46.917 |
| 1.937 | 47.041 |
| 1.938 | 47.193 |
| 1.939 | 47.333 |
| 1.94 | 47.444 |
| 1.941 | 47.596 |
| 1.942 | 47.751 |
| 1.943 | 47.872 |
| 1.944 | 48.02 |
| 1.945 | 48.163 |
| 1.946 | 48.306 |
| 1.947 | 48.458 |
| 1.948 | 48.595 |
| 1.949 | 48.743 |
| 1.95 | 48.875 |
| 1.951 | 49.039 |
| 1.952 | 49.181 |
| 1.953 | 49.322 |
| 1.954 | 49.479 |
| 1.955 | 49.62 |
| 1.956 | 49.782 |
| 1.957 | 49.92 |
| 1.958 | 50.068 |
| 1.959 | 50.228 |
| 1.96 | 50.381 |
| 1.961 | 50.529 |
| 1.962 | 50.674 |
| 1.963 | 50.831 |
| 1.964 | 50.984 |
| 1.965 | 51.124 |
| 1.966 | 51.276 |
| 1.967 | 51.449 |
| 1.968 | 51.591 |
| 1.969 | 51.764 |
| 1.97 | 51.923 |
| 1.971 | 52.065 |
| 1.972 | 52.221 |
| 1.973 | 52.376 |
| 1.974 | 52.547 |
| 1.975 | 52.703 |
| 1.976 | 52.842 |
| 1.977 | 53.028 |
| 1.978 | 53.183 |
| 1.979 | 53.343 |
| 1.98 | 53.503 |
| 1.981 | 53.668 |
| 1.982 | 53.835 |
| 1.983 | 53.972 |
| 1.984 | 54.157 |
| 1.985 | 54.296 |
| 1.986 | 54.484 |
| 1.987 | 54.645 |
| 1.988 | 54.803 |
| 1.989 | 54.964 |
| 1.99 | 55.149 |
| 1.991 | 55.283 |
| 1.992 | 55.498 |
| 1.993 | 55.636 |
| 1.994 | 55.805 |
| 1.995 | 55.977 |
| 1.996 | 56.13 |
| 1.997 | 56.305 |
| 1.998 | 56.456 |
| 1.999 | 56.648 |
| 2.0 | 56.791 |
| 2.001 | 56.998 |
| 2.002 | 57.156 |
| 2.003 | 57.302 |
| 2.004 | 57.478 |
| 2.005 | 57.674 |
| 2.006 | 57.832 |
| 2.007 | 57.998 |
| 2.008 | 58.193 |
| 2.009 | 58.319 |
| 2.01 | 58.512 |
| 2.011 | 58.732 |
| 2.012 | 58.861 |
| 2.013 | 59.015 |
| 2.014 | 59.229 |
| 2.015 | 59.387 |
| 2.016 | 59.527 |
| 2.017 | 59.742 |
| 2.018 | 59.921 |
| 2.019 | 60.057 |
| 2.02 | 60.243 |
| 2.021 | 60.429 |
| 2.022 | 60.597 |
| 2.023 | 60.768 |
| 2.024 | 60.964 |
| 2.025 | 61.119 |
| 2.026 | 61.307 |
| 2.027 | 61.479 |
| 2.028 | 61.654 |
| 2.029 | 61.814 |
| 2.03 | 62.017 |
| 2.031 | 62.198 |
| 2.032 | 62.346 |
| 2.033 | 62.523 |
| 2.034 | 62.718 |
| 2.035 | 62.887 |
| 2.036 | 63.039 |
| 2.037 | 63.25 |
| 2.038 | 63.422 |
| 2.039 | 63.583 |
| 2.04 | 63.765 |
| 2.041 | 63.931 |
| 2.042 | 64.111 |
| 2.043 | 64.285 |
| 2.044 | 64.466 |
| 2.045 | 64.639 |
| 2.046 | 64.815 |
| 2.047 | 64.979 |
| 2.048 | 65.161 |
| 2.049 | 65.345 |
| 2.05 | 65.507 |
| 2.051 | 65.682 |
| 2.052 | 65.887 |
| 2.053 | 66.036 |
| 2.054 | 66.201 |
| 2.055 | 66.377 |
| 2.056 | 66.561 |
| 2.057 | 66.749 |
| 2.058 | 66.89 |
| 2.059 | 67.057 |
| 2.06 | 67.247 |
| 2.061 | 67.417 |
| 2.062 | 67.569 |
| 2.063 | 67.771 |
| 2.064 | 67.93 |
| 2.065 | 68.093 |
| 2.066 | 68.257 |
| 2.067 | 68.449 |
| 2.068 | 68.619 |
| 2.069 | 68.765 |
| 2.07 | 68.948 |
| 2.071 | 69.1 |
| 2.072 | 69.276 |
| 2.073 | 69.448 |
| 2.074 | 69.604 |
| 2.075 | 69.787 |
| 2.076 | 69.926 |
| 2.077 | 70.117 |
| 2.078 | 70.293 |
| 2.079 | 70.419 |
| 2.08 | 70.576 |
| 2.081 | 70.784 |
| 2.082 | 70.938 |
| 2.083 | 71.092 |
| 2.084 | 71.233 |
| 2.085 | 71.413 |
| 2.086 | 71.55 |
| 2.087 | 71.727 |
| 2.088 | 71.878 |
| 2.089 | 72.033 |
| 2.09 | 72.202 |
| 2.091 | 72.33 |
| 2.092 | 72.503 |
| 2.093 | 72.681 |
| 2.094 | 72.827 |
| 2.095 | 72.981 |
| 2.096 | 73.121 |
| 2.097 | 73.283 |
| 2.098 | 73.432 |
| 2.099 | 73.567 |
| 2.1 | 73.729 |
| 2.101 | 73.868 |
| 2.102 | 74.005 |
| 2.103 | 74.154 |
| 2.104 | 74.337 |
| 2.105 | 74.456 |
| 2.106 | 74.575 |
| 2.107 | 74.778 |
| 2.108 | 74.895 |
| 2.109 | 75.004 |
| 2.11 | 75.189 |
| 2.111 | 75.296 |
| 2.112 | 75.461 |
| 2.113 | 75.596 |
| 2.114 | 75.722 |
| 2.115 | 75.831 |
| 2.116 | 75.995 |
| 2.117 | 76.141 |
| 2.118 | 76.257 |
| 2.119 | 76.419 |
| 2.12 | 76.52 |
| 2.121 | 76.65 |
| 2.122 | 76.782 |
| 2.123 | 76.903 |
| 2.124 | 77.027 |
| 2.125 | 77.162 |
| 2.126 | 77.297 |
| 2.127 | 77.377 |
| 2.128 | 77.56 |
| 2.129 | 77.654 |
| 2.13 | 77.733 |
| 2.131 | 77.885 |
| 2.132 | 78.046 |
| 2.133 | 78.117 |
| 2.134 | 78.24 |
| 2.135 | 78.339 |
| 2.136 | 78.466 |
| 2.137 | 78.585 |
| 2.138 | 78.701 |
| 2.139 | 78.798 |
| 2.14 | 78.894 |
| 2.141 | 79 |
| 2.142 | 79.108 |
| 2.143 | 79.212 |
| 2.144 | 79.332 |
| 2.145 | 79.391 |
| 2.146 | 79.508 |
| 2.147 | 79.615 |
| 2.148 | 79.707 |
| 2.149 | 79.794 |
| 2.15 | 79.902 |
| 2.151 | 79.996 |
| 2.152 | 80.083 |
| 2.153 | 80.153 |
| 2.154 | 80.282 |
| 2.155 | 80.355 |
| 2.156 | 80.434 |
| 2.157 | 80.497 |
| 2.158 | 80.605 |
| 2.159 | 80.681 |
| 2.16 | 80.756 |
| 2.161 | 80.839 |
| 2.162 | 80.926 |
| 2.163 | 81.014 |
| 2.164 | 81.075 |
| 2.165 | 81.141 |
| 2.166 | 81.226 |
| 2.167 | 81.295 |
| 2.168 | 81.337 |
| 2.169 | 81.427 |
| 2.17 | 81.493 |
| 2.171 | 81.571 |
| 2.172 | 81.621 |
| 2.173 | 81.68 |
| 2.174 | 81.748 |
| 2.175 | 81.789 |
| 2.176 | 81.877 |
| 2.177 | 81.9 |
| 2.178 | 81.924 |
| 2.179 | 82.08 |
| 2.18 | 82.046 |
| 2.181 | 82.105 |
| 2.182 | 82.189 |
| 2.183 | 82.234 |
| 2.184 | 82.255 |
| 2.185 | 82.316 |
| 2.186 | 82.366 |
| 2.187 | 82.374 |
| 2.188 | 82.48 |
| 2.189 | 82.504 |
| 2.19 | 82.516 |
| 2.191 | 82.553 |
| 2.192 | 82.609 |
| 2.193 | 82.64 |
| 2.194 | 82.667 |
| 2.195 | 82.683 |
| 2.196 | 82.732 |
| 2.197 | 82.769 |
| 2.198 | 82.782 |
| 2.199 | 82.807 |
| 2.2 | 82.838 |
| 2.201 | 82.896 |
| 2.202 | 82.866 |
| 2.203 | 82.906 |
| 2.204 | 82.886 |
| 2.205 | 82.952 |
| 2.206 | 82.926 |
| 2.207 | 82.977 |
| 2.208 | 82.988 |
| 2.209 | 83.012 |
| 2.21 | 83.019 |
| 2.211 | 83.065 |
| 2.212 | 83.048 |
| 2.213 | 83.034 |
| 2.214 | 83.064 |
| 2.215 | 83.062 |
| 2.216 | 83.053 |
| 2.217 | 83.083 |
| 2.218 | 83.065 |
| 2.219 | 83.08 |
| 2.22 | 83.057 |
| 2.221 | 83.075 |
| 2.222 | 83.075 |
| 2.223 | 83.07 |
| 2.224 | 83.061 |
| 2.225 | 83.062 |
| 2.226 | 83.026 |
| 2.227 | 83.025 |
| 2.228 | 83.029 |
| 2.229 | 83.029 |
| 2.23 | 82.999 |
| 2.231 | 82.969 |
| 2.232 | 82.975 |
| 2.233 | 82.946 |
| 2.234 | 82.925 |
| 2.235 | 82.916 |
| 2.236 | 82.89 |
| 2.237 | 82.883 |
| 2.238 | 82.86 |
| 2.239 | 82.821 |
| 2.24 | 82.824 |
| 2.241 | 82.784 |
| 2.242 | 82.74 |
| 2.243 | 82.738 |
| 2.244 | 82.682 |
| 2.245 | 82.668 |
| 2.246 | 82.628 |
| 2.247 | 82.605 |
| 2.248 | 82.561 |
| 2.249 | 82.526 |
| 2.25 | 82.498 |
| 2.251 | 82.456 |
| 2.252 | 82.431 |
| 2.253 | 82.406 |
| 2.254 | 82.355 |
| 2.255 | 82.305 |
| 2.256 | 82.272 |
| 2.257 | 82.223 |
| 2.258 | 82.178 |
| 2.259 | 82.125 |
| 2.26 | 82.083 |
| 2.261 | 82.057 |
| 2.262 | 82.017 |
| 2.263 | 81.948 |
| 2.264 | 81.91 |
| 2.265 | 81.845 |
| 2.266 | 81.803 |
| 2.267 | 81.748 |
| 2.268 | 81.685 |
| 2.269 | 81.637 |
| 2.27 | 81.579 |
| 2.271 | 81.519 |
| 2.272 | 81.453 |
| 2.273 | 81.397 |
| 2.274 | 81.348 |
| 2.275 | 81.285 |
| 2.276 | 81.227 |
| 2.277 | 81.166 |
| 2.278 | 81.105 |
| 2.279 | 81.046 |
| 2.28 | 80.987 |
| 2.281 | 80.883 |
| 2.282 | 80.85 |
| 2.283 | 80.776 |
| 2.284 | 80.708 |
| 2.285 | 80.629 |
| 2.286 | 80.582 |
| 2.287 | 80.476 |
| 2.288 | 80.44 |
| 2.289 | 80.368 |
| 2.29 | 80.293 |
| 2.291 | 80.229 |
| 2.292 | 80.154 |
| 2.293 | 80.08 |
| 2.294 | 79.986 |
| 2.295 | 79.934 |
| 2.296 | 79.851 |
| 2.297 | 79.773 |
| 2.298 | 79.691 |
| 2.299 | 79.64 |
| 2.3 | 79.558 |
| 2.301 | 79.483 |
| 2.302 | 79.404 |
| 2.303 | 79.313 |
| 2.304 | 79.256 |
| 2.305 | 79.198 |
| 2.306 | 79.115 |
| 2.307 | 79.024 |
| 2.308 | 78.943 |
| 2.309 | 78.892 |
| 2.31 | 78.772 |
| 2.311 | 78.692 |
| 2.312 | 78.625 |
| 2.313 | 78.546 |
| 2.314 | 78.455 |
| 2.315 | 78.337 |
| 2.316 | 78.326 |
| 2.317 | 78.223 |
| 2.318 | 78.131 |
| 2.319 | 78.053 |
| 2.32 | 77.971 |
| 2.321 | 77.922 |
| 2.322 | 77.809 |
| 2.323 | 77.722 |
| 2.324 | 77.654 |
| 2.325 | 77.577 |
| 2.326 | 77.458 |
| 2.327 | 77.376 |
| 2.328 | 77.294 |
| 2.329 | 77.202 |
| 2.33 | 77.069 |
| 2.331 | 77.048 |
| 2.332 | 76.922 |
| 2.333 | 76.845 |
| 2.334 | 76.757 |
| 2.335 | 76.708 |
| 2.336 | 76.546 |
| 2.337 | 76.507 |
| 2.338 | 76.383 |
| 2.339 | 76.297 |
| 2.34 | 76.182 |
| 2.341 | 76.134 |
| 2.342 | 76.057 |
| 2.343 | 75.968 |
| 2.344 | 75.851 |
| 2.345 | 75.767 |
| 2.346 | 75.668 |
| 2.347 | 75.564 |
| 2.348 | 75.493 |
| 2.349 | 75.385 |
| 2.35 | 75.314 |
| 2.351 | 75.215 |
| 2.352 | 75.168 |
| 2.353 | 75.039 |
| 2.354 | 74.913 |
| 2.355 | 74.867 |
| 2.356 | 74.757 |
| 2.357 | 74.697 |
| 2.358 | 74.573 |
| 2.359 | 74.506 |
| 2.36 | 74.383 |
| 2.361 | 74.319 |
| 2.362 | 74.238 |
| 2.363 | 74.113 |
| 2.364 | 74.055 |
| 2.365 | 73.955 |
| 2.366 | 73.842 |
| 2.367 | 73.779 |
| 2.368 | 73.677 |
| 2.369 | 73.557 |
| 2.37 | 73.535 |
| 2.371 | 73.354 |
| 2.372 | 73.307 |
| 2.373 | 73.204 |
| 2.374 | 73.125 |
| 2.375 | 73.038 |
| 2.376 | 72.957 |
| 2.377 | 72.842 |
| 2.378 | 72.743 |
| 2.379 | 72.66 |
| 2.38 | 72.612 |
| 2.381 | 72.488 |
| 2.382 | 72.425 |
| 2.383 | 72.266 |
| 2.384 | 72.209 |
| 2.385 | 72.11 |
| 2.386 | 72.062 |
| 2.387 | 71.957 |
| 2.388 | 71.852 |
| 2.389 | 71.779 |
| 2.39 | 71.706 |
| 2.391 | 71.61 |
| 2.392 | 71.521 |
| 2.393 | 71.434 |
| 2.394 | 71.3 |
| 2.395 | 71.215 |
| 2.396 | 71.114 |
| 2.397 | 71.044 |
| 2.398 | 70.967 |
| 2.399 | 70.886 |
| 2.4 | 70.783 |
| 2.401 | 70.693 |
| 2.402 | 70.58 |
| 2.403 | 70.554 |
| 2.404 | 70.425 |
| 2.405 | 70.339 |
| 2.406 | 70.259 |
| 2.407 | 70.172 |
| 2.408 | 70.089 |
| 2.409 | 69.947 |
| 2.41 | 69.927 |
| 2.411 | 69.826 |
| 2.412 | 69.736 |
| 2.413 | 69.626 |
| 2.414 | 69.556 |
| 2.415 | 69.488 |
| 2.416 | 69.406 |
| 2.417 | 69.338 |
| 2.418 | 69.196 |
| 2.419 | 69.138 |
| 2.42 | 69.046 |
| 2.421 | 68.949 |
| 2.422 | 68.847 |
| 2.423 | 68.779 |
| 2.424 | 68.715 |
| 2.425 | 68.608 |
| 2.426 | 68.519 |
| 2.427 | 68.481 |
| 2.428 | 68.368 |
| 2.429 | 68.279 |
| 2.43 | 68.225 |
| 2.431 | 68.087 |
| 2.432 | 68.032 |
| 2.433 | 67.919 |
| 2.434 | 67.872 |
| 2.435 | 67.801 |
| 2.436 | 67.715 |
| 2.437 | 67.629 |
| 2.438 | 67.564 |
| 2.439 | 67.45 |
| 2.44 | 67.397 |
| 2.441 | 67.279 |
| 2.442 | 67.233 |
| 2.443 | 67.15 |
| 2.444 | 67.027 |
| 2.445 | 66.977 |
| 2.446 | 66.902 |
| 2.447 | 66.817 |
| 2.448 | 66.721 |
| 2.449 | 66.651 |
| 2.45 | 66.57 |
| 2.451 | 66.488 |
| 2.452 | 66.399 |
| 2.453 | 66.348 |
| 2.454 | 66.229 |
| 2.455 | 66.199 |
| 2.456 | 66.095 |
| 2.457 | 66.024 |
| 2.458 | 65.942 |
| 2.459 | 65.909 |
| 2.46 | 65.8 |
| 2.461 | 65.719 |
| 2.462 | 65.61 |
| 2.463 | 65.576 |
| 2.464 | 65.512 |
| 2.465 | 65.423 |
| 2.466 | 65.35 |
| 2.467 | 65.261 |
| 2.468 | 65.197 |
| 2.469 | 65.103 |
| 2.47 | 65.045 |
| 2.471 | 64.954 |
| 2.472 | 64.884 |
| 2.473 | 64.811 |
| 2.474 | 64.76 |
| 2.475 | 64.71 |
| 2.476 | 64.614 |
| 2.477 | 64.529 |
| 2.478 | 64.464 |
| 2.479 | 64.37 |
| 2.48 | 64.329 |
| 2.481 | 64.229 |
| 2.482 | 64.147 |
| 2.483 | 64.095 |
| 2.484 | 64.027 |
| 2.485 | 63.936 |
| 2.486 | 63.861 |
| 2.487 | 63.825 |
| 2.488 | 63.749 |
| 2.489 | 63.675 |
| 2.49 | 63.611 |
| 2.491 | 63.537 |
| 2.492 | 63.447 |
| 2.493 | 63.374 |
| 2.494 | 63.316 |
| 2.495 | 63.278 |
| 2.496 | 63.134 |
| 2.497 | 63.132 |
| 2.498 | 63.049 |
| 2.499 | 62.984 |
| 2.5 | 62.915 |
| 2.5016700000000003 | 62.527 |
| 2.5055300000000003 | 62.279 |
| 2.50939 | 62.023 |
| 2.51325 | 61.78 |
| 2.51711 | 61.535 |
| 2.52098 | 61.304 |
| 2.52484 | 61.061 |
| 2.5286999999999997 | 60.84 |
| 2.53256 | 60.61 |
| 2.53642 | 60.401 |
| 2.54028 | 60.189 |
| 2.54414 | 59.98 |
| 2.548 | 59.77 |
| 2.55186 | 59.57 |
| 2.55572 | 59.374 |
| 2.55958 | 59.175 |
| 2.56344 | 58.989 |
| 2.5673000000000004 | 58.796 |
| 2.57116 | 58.634 |
| 2.57502 | 58.454 |
| 2.5788800000000003 | 58.27 |
| 2.58275 | 58.096 |
| 2.5866100000000003 | 57.921 |
| 2.59047 | 57.762 |
| 2.59433 | 57.603 |
| 2.59819 | 57.453 |
| 2.60205 | 57.276 |
| 2.6059099999999997 | 57.154 |
| 2.60977 | 57.009 |
| 2.61363 | 56.868 |
| 2.6174899999999997 | 56.725 |
| 2.62135 | 56.614 |
| 2.62521 | 56.465 |
| 2.62907 | 56.319 |
| 2.63293 | 56.198 |
| 2.63679 | 56.081 |
| 2.64065 | 55.95 |
| 2.6445100000000004 | 55.836 |
| 2.64838 | 55.733 |
| 2.65224 | 55.61 |
| 2.6561 | 55.493 |
| 2.65996 | 55.399 |
| 2.6638200000000003 | 55.294 |
| 2.66768 | 55.226 |
| 2.67154 | 55.158 |
| 2.6754000000000002 | 54.947 |
| 2.67926 | 54.895 |
| 2.6831199999999997 | 54.778 |
| 2.68698 | 54.691 |
| 2.69084 | 54.602 |
| 2.6946999999999997 | 54.499 |
| 2.69856 | 54.378 |
| 2.70242 | 54.278 |
| 2.70628 | 54.156 |
| 2.71015 | 54.053 |
| 2.71401 | 53.981 |
| 2.71787 | 53.886 |
| 2.72173 | 53.821 |
| 2.72559 | 53.725 |
| 2.72945 | 53.574 |
| 2.73331 | 53.45 |
| 2.73717 | 53.324 |
| 2.7410300000000003 | 53.202 |
| 2.74489 | 53.015 |
| 2.74875 | 52.832 |
| 2.7526100000000002 | 52.63 |
| 2.7564699999999998 | 52.462 |
| 2.7603299999999997 | 52.199 |
| 2.76419 | 51.977 |
| 2.76805 | 51.745 |
| 2.7719099999999997 | 51.512 |
| 2.77578 | 51.269 |
| 2.7796399999999997 | 51.038 |
| 2.7835 | 50.829 |
| 2.78736 | 50.614 |
| 2.7912199999999996 | 50.416 |
| 2.79508 | 50.246 |
| 2.79894 | 50.08 |
| 2.8028000000000004 | 49.906 |
| 2.80666 | 49.771 |
| 2.81052 | 49.639 |
| 2.8143800000000003 | 49.512 |
| 2.81824 | 49.399 |
| 2.8221 | 49.263 |
| 2.8259600000000002 | 49.195 |
| 2.8298200000000002 | 49.112 |
| 2.8336799999999998 | 49.054 |
| 2.8375500000000002 | 48.971 |
| 2.8414099999999998 | 48.956 |
| 2.84527 | 48.903 |
| 2.84913 | 48.885 |
| 2.8529899999999997 | 48.873 |
| 2.85685 | 48.85 |
| 2.86071 | 48.842 |
| 2.86457 | 48.845 |
| 2.86843 | 48.853 |
| 2.87229 | 48.873 |
| 2.87615 | 48.895 |
| 2.8800100000000004 | 48.915 |
| 2.88387 | 48.917 |
| 2.88773 | 48.979 |
| 2.8915900000000003 | 49.012 |
| 2.89545 | 49.058 |
| 2.89931 | 49.114 |
| 2.90318 | 49.152 |
| 2.90704 | 49.223 |
| 2.9109000000000003 | 49.246 |
| 2.9147600000000002 | 49.317 |
| 2.9186199999999998 | 49.406 |
| 2.92248 | 49.48 |
| 2.92634 | 49.557 |
| 2.9301999999999997 | 49.613 |
| 2.93406 | 49.708 |
| 2.93792 | 49.795 |
| 2.94178 | 49.859 |
| 2.94564 | 49.979 |
| 2.9495 | 50.067 |
| 2.95336 | 50.198 |
| 2.95722 | 50.296 |
| 2.96108 | 50.397 |
| 2.96495 | 50.514 |
| 2.96881 | 50.594 |
| 2.97267 | 50.732 |
| 2.9765300000000003 | 50.855 |
| 2.98039 | 50.987 |
| 2.98425 | 51.084 |
| 2.9881100000000003 | 51.237 |
| 2.99197 | 51.348 |
| 2.9958299999999998 | 51.46 |
| 2.99969 | 51.62 |
| 3.00355 | 51.763 |
| 3.0074099999999997 | 51.87 |
| 3.01127 | 52.013 |
| 3.01513 | 52.153 |
| 3.0189899999999996 | 52.29 |
| 3.02285 | 52.392 |
| 3.02671 | 52.531 |
| 3.03058 | 52.68 |
| 3.03444 | 52.796 |
| 3.0383 | 52.935 |
| 3.04216 | 53.091 |
| 3.04602 | 53.214 |
| 3.04988 | 53.355 |
| 3.05374 | 53.476 |
| 3.0576 | 53.595 |
| 3.06146 | 53.757 |
| 3.0653200000000003 | 53.903 |
| 3.06918 | 54.046 |
| 3.0730399999999998 | 54.167 |
| 3.0769 | 54.312 |
| 3.08076 | 54.441 |
| 3.0846199999999997 | 54.588 |
| 3.08848 | 54.731 |
| 3.0923499999999997 | 54.845 |
| 3.09621 | 55 |
| 3.10007 | 55.151 |
| 3.1039299999999996 | 55.298 |
| 3.10779 | 55.44 |
| 3.11165 | 55.599 |
| 3.11551 | 55.76 |
| 3.11937 | 55.913 |
| 3.12323 | 56.077 |
| 3.12709 | 56.251 |
| 3.13095 | 56.408 |
| 3.13481 | 56.586 |
| 3.1386700000000003 | 56.765 |
| 3.1425300000000003 | 56.937 |
| 3.14639 | 57.119 |
| 3.15025 | 57.293 |
| 3.15411 | 57.461 |
| 3.1579800000000002 | 57.637 |
| 3.16184 | 57.808 |
| 3.1656999999999997 | 57.974 |
| 3.16956 | 58.142 |
| 3.17342 | 58.301 |
| 3.17728 | 58.499 |
| 3.18114 | 58.683 |
| 3.185 | 58.843 |
| 3.18886 | 59.03 |
| 3.19272 | 59.206 |
| 3.19658 | 59.387 |
| 3.20044 | 59.581 |
| 3.2043000000000004 | 59.734 |
| 3.20816 | 59.911 |
| 3.21202 | 60.106 |
| 3.2158800000000003 | 60.298 |
| 3.21975 | 60.469 |
| 3.2236100000000003 | 60.65 |
| 3.22747 | 60.816 |
| 3.23133 | 61.013 |
| 3.2351900000000002 | 61.168 |
| 3.23905 | 61.365 |
| 3.2429099999999997 | 61.524 |
| 3.24677 | 61.704 |
| 3.25063 | 61.893 |
| 3.2544899999999997 | 62.089 |
| 3.25835 | 62.264 |
| 3.26221 | 62.45 |
| 3.26607 | 62.653 |
| 3.26993 | 62.837 |
| 3.27379 | 63.023 |
| 3.27765 | 63.198 |
| 3.2815100000000004 | 63.383 |
| 3.28538 | 63.559 |
| 3.28924 | 63.741 |
| 3.2931 | 63.94 |
| 3.29696 | 64.121 |
| 3.3008200000000003 | 64.309 |
| 3.30468 | 64.494 |
| 3.30854 | 64.672 |
| 3.3124000000000002 | 64.848 |
| 3.31626 | 65.029 |
| 3.3201199999999997 | 65.225 |
| 3.32398 | 65.437 |
| 3.32784 | 65.608 |
| 3.3316999999999997 | 65.793 |
| 3.33556 | 65.967 |
| 3.33942 | 66.145 |
| 3.34328 | 66.309 |
| 3.34715 | 66.477 |
| 3.35101 | 66.647 |
| 3.35487 | 66.804 |
| 3.35873 | 66.996 |
| 3.36259 | 67.178 |
| 3.36645 | 67.397 |
| 3.37031 | 67.602 |
| 3.37417 | 67.784 |
| 3.3780300000000003 | 67.963 |
| 3.38189 | 68.164 |
| 3.38575 | 68.348 |
| 3.3896100000000002 | 68.533 |
| 3.3934699999999998 | 68.706 |
| 3.3973299999999997 | 68.879 |
| 3.40119 | 69.067 |
| 3.40505 | 69.248 |
| 3.4089099999999997 | 69.43 |
| 3.41278 | 69.591 |
| 3.4166399999999997 | 69.807 |
| 3.4205 | 69.985 |
| 3.42436 | 70.195 |
| 3.4282199999999996 | 70.374 |
| 3.43208 | 70.561 |
| 3.43594 | 70.76 |
| 3.4398 | 70.968 |
| 3.44366 | 71.157 |
| 3.44752 | 71.35 |
| 3.45138 | 71.538 |
| 3.45524 | 71.718 |
| 3.4591 | 71.907 |
| 3.46296 | 72.092 |
| 3.4668200000000002 | 72.277 |
| 3.4706799999999998 | 72.461 |
| 3.4745500000000002 | 72.636 |
| 3.47841 | 72.804 |
| 3.48227 | 72.981 |
| 3.48613 | 73.166 |
| 3.4899899999999997 | 73.34 |
| 3.49385 | 73.518 |
| 3.49771 | 73.701 |
| 3.50157 | 73.887 |
| 3.50543 | 74.073 |
| 3.50929 | 74.257 |
| 3.51315 | 74.437 |
| 3.5170100000000004 | 74.63 |
| 3.52087 | 74.822 |
| 3.52473 | 74.994 |
| 3.5285900000000003 | 75.189 |
| 3.53245 | 75.367 |
| 3.53631 | 75.542 |
| 3.54018 | 75.737 |
| 3.54404 | 75.918 |
| 3.5479000000000003 | 76.102 |
| 3.5517600000000003 | 76.283 |
| 3.55562 | 76.462 |
| 3.55948 | 76.631 |
| 3.56334 | 76.818 |
| 3.5671999999999997 | 76.99 |
| 3.57106 | 77.168 |
| 3.57492 | 77.339 |
| 3.57878 | 77.498 |
| 3.58264 | 77.668 |
| 3.5865 | 77.838 |
| 3.59036 | 78.015 |
| 3.59422 | 78.18 |
| 3.59808 | 78.344 |
| 3.60195 | 78.509 |
| 3.60581 | 78.683 |
| 3.60967 | 78.87 |
| 3.6135300000000004 | 79.043 |
| 3.61739 | 79.203 |
| 3.62125 | 79.38 |
| 3.6251100000000003 | 79.553 |
| 3.62897 | 79.718 |
| 3.63283 | 79.89 |
| 3.63669 | 80.062 |
| 3.64055 | 80.222 |
| 3.6444099999999997 | 80.403 |
| 3.64827 | 80.561 |
| 3.65213 | 80.719 |
| 3.6559899999999996 | 80.888 |
| 3.65985 | 81.041 |
| 3.66371 | 81.202 |
| 3.66758 | 81.354 |
| 3.67144 | 81.513 |
| 3.6753 | 81.678 |
| 3.67916 | 81.83 |
| 3.68302 | 81.99 |
| 3.68688 | 82.134 |
| 3.69074 | 82.291 |
| 3.6946 | 82.458 |
| 3.69846 | 82.61 |
| 3.7023200000000003 | 82.76 |
| 3.70618 | 82.918 |
| 3.71004 | 83.077 |
| 3.7139 | 83.237 |
| 3.71776 | 83.407 |
| 3.7216199999999997 | 83.555 |
| 3.72548 | 83.707 |
| 3.7293499999999997 | 83.852 |
| 3.73321 | 84.008 |
| 3.73707 | 84.157 |
| 3.7409299999999996 | 84.31 |
| 3.74479 | 84.456 |
| 3.74865 | 84.6 |
| 3.75251 | 84.739 |
| 3.75637 | 84.88 |
| 3.76023 | 85.024 |
| 3.76409 | 85.166 |
| 3.76795 | 85.297 |
| 3.77181 | 85.442 |
| 3.77567 | 85.588 |
| 3.7795300000000003 | 85.717 |
| 3.78339 | 85.857 |
| 3.78725 | 85.99 |
| 3.79111 | 86.132 |
| 3.79498 | 86.281 |
| 3.79884 | 86.425 |
| 3.8026999999999997 | 86.564 |
| 3.80656 | 86.693 |
| 3.81042 | 86.831 |
| 3.81428 | 86.97 |
| 3.81814 | 87.104 |
| 3.822 | 87.247 |
| 3.82586 | 87.372 |
| 3.82972 | 87.504 |
| 3.83358 | 87.623 |
| 3.83744 | 87.762 |
| 3.8413000000000004 | 87.897 |
| 3.84516 | 88.014 |
| 3.84902 | 88.135 |
| 3.8528800000000003 | 88.262 |
| 3.85675 | 88.38 |
| 3.8606100000000003 | 88.502 |
| 3.86447 | 88.626 |
| 3.86833 | 88.743 |
| 3.8721900000000002 | 88.862 |
| 3.87605 | 88.98 |
| 3.8799099999999997 | 89.105 |
| 3.88377 | 89.221 |
| 3.88763 | 89.346 |
| 3.8914899999999997 | 89.452 |
| 3.89535 | 89.583 |
| 3.89921 | 89.696 |
| 3.90307 | 89.812 |
| 3.90693 | 89.923 |
| 3.91079 | 90.034 |
| 3.91465 | 90.155 |
| 3.9185100000000004 | 90.264 |
| 3.92238 | 90.375 |
| 3.92624 | 90.478 |
| 3.9301 | 90.592 |
| 3.93396 | 90.701 |
| 3.9378200000000003 | 90.816 |
| 3.94168 | 90.914 |
| 3.94554 | 91.019 |
| 3.9494000000000002 | 91.126 |
| 3.95326 | 91.22 |
| 3.9571199999999997 | 91.332 |
| 3.96098 | 91.428 |
| 3.96484 | 91.521 |
| 3.9686999999999997 | 91.625 |
| 3.97256 | 91.719 |
| 3.97642 | 91.818 |
| 3.98028 | 91.922 |
| 3.98415 | 92.021 |
| 3.98801 | 92.104 |
| 3.99187 | 92.189 |
| 3.99573 | 92.292 |
| 3.99959 | 92.387 |
| 4.00345 | 92.476 |
| 4.00731 | 92.563 |
| 4.01117 | 92.656 |
| 4.01503 | 92.742 |
| 4.01889 | 92.836 |
| 4.02275 | 92.931 |
| 4.02661 | 93.022 |
| 4.03047 | 93.107 |
| 4.03433 | 93.193 |
| 4.03819 | 93.275 |
| 4.042050000000001 | 93.36 |
| 4.04591 | 93.447 |
| 4.04978 | 93.535 |
| 4.05364 | 93.624 |
| 4.0575 | 93.704 |
| 4.0613600000000005 | 93.784 |
| 4.06522 | 93.863 |
| 4.06908 | 93.94 |
| 4.07294 | 94.017 |
| 4.0768 | 94.089 |
| 4.08066 | 94.161 |
| 4.08452 | 94.236 |
| 4.08838 | 94.305 |
| 4.092239999999999 | 94.372 |
| 4.096100000000001 | 94.437 |
| 4.09996 | 94.51 |
| 4.10382 | 94.584 |
| 4.10768 | 94.643 |
| 4.11155 | 94.706 |
| 4.11541 | 94.776 |
| 4.11927 | 94.841 |
| 4.12313 | 94.916 |
| 4.12699 | 94.968 |
| 4.130850000000001 | 95.03 |
| 4.13471 | 95.104 |
| 4.13857 | 95.165 |
| 4.14243 | 95.222 |
| 4.14629 | 95.288 |
| 4.15015 | 95.356 |
| 4.15401 | 95.415 |
| 4.15787 | 95.489 |
| 4.1617299999999995 | 95.554 |
| 4.16559 | 95.611 |
| 4.169449999999999 | 95.672 |
| 4.173310000000001 | 95.74 |
| 4.17718 | 95.8 |
| 4.18104 | 95.86 |
| 4.1849 | 95.915 |
| 4.18876 | 95.969 |
| 4.19262 | 96.012 |
| 4.196479999999999 | 96.033 |
| 4.20034 | 96.049 |
| 4.2042 | 96.087 |
| 4.208060000000001 | 96.105 |
| 4.21192 | 96.11 |
| 4.21578 | 96.136 |
| 4.21964 | 96.181 |
| 4.2235 | 96.221 |
| 4.22736 | 96.233 |
| 4.23122 | 96.249 |
| 4.23508 | 96.312 |
| 4.23895 | 96.334 |
| 4.24281 | 96.372 |
| 4.24667 | 96.46 |
| 4.2505299999999995 | 96.516 |
| 4.25439 | 96.589 |
| 4.25825 | 96.651 |
| 4.26211 | 96.674 |
| 4.26597 | 96.675 |
| 4.26983 | 96.711 |
| 4.273689999999999 | 96.778 |
| 4.27755 | 96.822 |
| 4.28141 | 96.852 |
| 4.285270000000001 | 96.904 |
| 4.28913 | 96.974 |
| 4.29299 | 97.025 |
| 4.29685 | 97.074 |
| 4.3007100000000005 | 97.16 |
| 4.30458 | 97.207 |
| 4.308439999999999 | 97.25 |
| 4.3123000000000005 | 97.302 |
| 4.31616 | 97.372 |
| 4.32002 | 97.411 |
| 4.32388 | 97.455 |
| 4.3277399999999995 | 97.509 |
| 4.331600000000001 | 97.556 |
| 4.33546 | 97.606 |
| 4.33932 | 97.651 |
| 4.34318 | 97.691 |
| 4.34704 | 97.728 |
| 4.350899999999999 | 97.775 |
| 4.354760000000001 | 97.798 |
| 4.35862 | 97.836 |
| 4.36248 | 97.876 |
| 4.366350000000001 | 97.902 |
| 4.37021 | 97.929 |
| 4.37407 | 97.954 |
| 4.37793 | 97.982 |
| 4.38179 | 98.02 |
| 4.38565 | 98.054 |
| 4.3895100000000005 | 98.079 |
| 4.39337 | 98.114 |
| 4.3972299999999995 | 98.146 |
| 4.40109 | 98.156 |
| 4.4049499999999995 | 98.181 |
| 4.408810000000001 | 98.211 |
| 4.41267 | 98.241 |
| 4.41653 | 98.276 |
| 4.42039 | 98.303 |
| 4.42425 | 98.333 |
| 4.428109999999999 | 98.374 |
| 4.431979999999999 | 98.41 |
| 4.43584 | 98.432 |
| 4.4397 | 98.462 |
| 4.443560000000001 | 98.489 |
| 4.44742 | 98.52 |
| 4.45128 | 98.554 |
| 4.45514 | 98.58 |
| 4.459 | 98.592 |
| 4.46286 | 98.617 |
| 4.4667200000000005 | 98.656 |
| 4.47058 | 98.681 |
| 4.4744399999999995 | 98.693 |
| 4.4783 | 98.712 |
| 4.4821599999999995 | 98.729 |
| 4.486020000000001 | 98.744 |
| 4.48988 | 98.76 |
| 4.49375 | 98.78 |
| 4.49761 | 98.791 |
| 4.50147 | 98.807 |
| 4.50533 | 98.819 |
| 4.509189999999999 | 98.83 |
| 4.51305 | 98.843 |
| 4.51691 | 98.855 |
| 4.520770000000001 | 98.878 |
| 4.52463 | 98.899 |
| 4.52849 | 98.912 |
| 4.53235 | 98.921 |
| 4.53621 | 98.936 |
| 4.54007 | 98.949 |
| 4.5439300000000005 | 98.956 |
| 4.54779 | 98.968 |
| 4.5516499999999995 | 98.982 |
| 4.55551 | 99.003 |
| 4.55938 | 99.029 |
| 4.5632399999999995 | 99.05 |
| 4.5671 | 99.067 |
| 4.57096 | 99.079 |
| 4.57482 | 99.091 |
| 4.57868 | 99.117 |
| 4.58254 | 99.143 |
| 4.586399999999999 | 99.158 |
| 4.59026 | 99.168 |
| 4.59412 | 99.177 |
| 4.59798 | 99.187 |
| 4.60184 | 99.203 |
| 4.6057 | 99.229 |
| 4.60956 | 99.234 |
| 4.61342 | 99.241 |
| 4.61728 | 99.26 |
| 4.621149999999999 | 99.277 |
| 4.6250100000000005 | 99.295 |
| 4.62887 | 99.314 |
| 4.63273 | 99.322 |
| 4.63659 | 99.314 |
| 4.6404499999999995 | 99.314 |
| 4.644310000000001 | 99.32 |
| 4.64817 | 99.334 |
| 4.65203 | 99.348 |
| 4.65589 | 99.359 |
| 4.65975 | 99.363 |
| 4.663609999999999 | 99.37 |
| 4.667470000000001 | 99.383 |
| 4.67133 | 99.383 |
| 4.67519 | 99.376 |
| 4.67905 | 99.377 |
| 4.68291 | 99.384 |
| 4.68678 | 99.39 |
| 4.69064 | 99.394 |
| 4.6945 | 99.398 |
| 4.69836 | 99.404 |
| 4.7022200000000005 | 99.407 |
| 4.70608 | 99.416 |
| 4.70994 | 99.428 |
| 4.7138 | 99.431 |
| 4.7176599999999995 | 99.433 |
| 4.721520000000001 | 99.444 |
| 4.72538 | 99.449 |
| 4.72924 | 99.452 |
| 4.7331 | 99.461 |
| 4.73696 | 99.472 |
| 4.740819999999999 | 99.476 |
| 4.744680000000001 | 99.482 |
| 4.74855 | 99.486 |
| 4.75241 | 99.496 |
| 4.756270000000001 | 99.512 |
| 4.76013 | 99.524 |
| 4.76399 | 99.53 |
| 4.76785 | 99.536 |
| 4.77171 | 99.539 |
| 4.77557 | 99.54 |
| 4.7794300000000005 | 99.547 |
| 4.78329 | 99.554 |
| 4.78715 | 99.556 |
| 4.79101 | 99.564 |
| 4.7948699999999995 | 99.57 |
| 4.79873 | 99.572 |
| 4.80259 | 99.576 |
| 4.80645 | 99.572 |
| 4.81031 | 99.569 |
| 4.81418 | 99.576 |
| 4.81804 | 99.586 |
| 4.821899999999999 | 99.589 |
| 4.82576 | 99.591 |
| 4.82962 | 99.594 |
| 4.83348 | 99.59 |
| 4.83734 | 99.586 |
| 4.8412 | 99.583 |
| 4.84506 | 99.583 |
| 4.84892 | 99.584 |
| 4.85278 | 99.584 |
| 4.8566400000000005 | 99.577 |
| 4.8605 | 99.572 |
| 4.86436 | 99.571 |
| 4.86822 | 99.572 |
| 4.8720799999999995 | 99.572 |
| 4.87595 | 99.572 |
| 4.87981 | 99.577 |
| 4.88367 | 99.582 |
| 4.88753 | 99.585 |
| 4.89139 | 99.579 |
| 4.89525 | 99.578 |
| 4.899109999999999 | 99.581 |
| 4.90297 | 99.573 |
| 4.90683 | 99.57 |
| 4.91069 | 99.581 |
| 4.91455 | 99.591 |
| 4.91841 | 99.593 |
| 4.92227 | 99.592 |
| 4.92613 | 99.594 |
| 4.92999 | 99.595 |
| 4.9338500000000005 | 99.597 |
| 4.93771 | 99.609 |
| 4.94158 | 99.613 |
| 4.94544 | 99.613 |
| 4.9493 | 99.616 |
| 4.95316 | 99.615 |
| 4.957020000000001 | 99.621 |
| 4.96088 | 99.63 |
| 4.96474 | 99.63 |
| 4.9686 | 99.625 |
| 4.97246 | 99.624 |
| 4.976319999999999 | 99.623 |
| 4.980180000000001 | 99.623 |
| 4.98404 | 99.622 |
| 4.9879 | 99.613 |
| 4.99176 | 99.608 |
| 4.99562 | 99.611 |
| 4.999479999999999 | 99.612 |
| 5.00335 | 99.612 |
| 5.00721 | 99.614 |
| 5.01107 | 99.61 |
| 5.0149300000000006 | 99.603 |
| 5.01879 | 99.602 |
| 5.02265 | 99.597 |
| 5.02651 | 99.579 |
| 5.03037 | 99.573 |
| 5.03423 | 99.574 |
| 5.03809 | 99.567 |
| 5.04195 | 99.564 |
| 5.04581 | 99.569 |
| 5.04967 | 99.571 |
| 5.053529999999999 | 99.562 |
| 5.057390000000001 | 99.556 |
| 5.06125 | 99.557 |
| 5.06511 | 99.552 |
| 5.06898 | 99.548 |
| 5.07284 | 99.548 |
| 5.0767 | 99.546 |
| 5.08056 | 99.546 |
| 5.08442 | 99.547 |
| 5.08828 | 99.542 |
| 5.0921400000000006 | 99.538 |
| 5.096 | 99.544 |
| 5.09986 | 99.553 |
| 5.10372 | 99.558 |
| 5.10758 | 99.552 |
| 5.11144 | 99.548 |
| 5.1153 | 99.549 |
| 5.11916 | 99.55 |
| 5.12302 | 99.553 |
| 5.12688 | 99.557 |
| 5.13075 | 99.562 |
| 5.1346099999999995 | 99.56 |
| 5.13847 | 99.553 |
| 5.14233 | 99.558 |
| 5.14619 | 99.569 |
| 5.15005 | 99.57 |
| 5.15391 | 99.563 |
| 5.15777 | 99.558 |
| 5.16163 | 99.554 |
| 5.16549 | 99.553 |
| 5.1693500000000006 | 99.554 |
| 5.17321 | 99.549 |
| 5.17707 | 99.545 |
| 5.18093 | 99.539 |
| 5.18479 | 99.536 |
| 5.18865 | 99.539 |
| 5.19251 | 99.539 |
| 5.19638 | 99.538 |
| 5.20024 | 99.538 |
| 5.2041 | 99.533 |
| 5.20796 | 99.524 |
| 5.2118199999999995 | 99.523 |
| 5.21568 | 99.523 |
| 5.21954 | 99.512 |
| 5.2234 | 99.499 |
| 5.22726 | 99.492 |
| 5.23112 | 99.492 |
| 5.234979999999999 | 99.495 |
| 5.23884 | 99.494 |
| 5.2427 | 99.487 |
| 5.246560000000001 | 99.48 |
| 5.25042 | 99.481 |
| 5.25428 | 99.484 |
| 5.25814 | 99.484 |
| 5.26201 | 99.486 |
| 5.26587 | 99.487 |
| 5.269729999999999 | 99.488 |
| 5.27359 | 99.493 |
| 5.27745 | 99.494 |
| 5.28131 | 99.486 |
| 5.28517 | 99.482 |
| 5.2890299999999995 | 99.486 |
| 5.292890000000001 | 99.488 |
| 5.29675 | 99.486 |
| 5.30061 | 99.486 |
| 5.30447 | 99.481 |
| 5.30833 | 99.478 |
| 5.312189999999999 | 99.479 |
| 5.316050000000001 | 99.477 |
| 5.31991 | 99.473 |
| 5.32378 | 99.474 |
| 5.327640000000001 | 99.475 |
| 5.3315 | 99.471 |
| 5.33536 | 99.468 |
| 5.33922 | 99.467 |
| 5.34308 | 99.467 |
| 5.34694 | 99.472 |
| 5.3508000000000004 | 99.482 |
| 5.35466 | 99.486 |
| 5.35852 | 99.476 |
| 5.36238 | 99.461 |
| 5.3662399999999995 | 99.451 |
| 5.370100000000001 | 99.448 |
| 5.37396 | 99.451 |
| 5.37782 | 99.452 |
| 5.38168 | 99.448 |
| 5.38554 | 99.441 |
| 5.38941 | 99.432 |
| 5.39327 | 99.425 |
| 5.39713 | 99.425 |
| 5.40099 | 99.429 |
| 5.404850000000001 | 99.432 |
| 5.40871 | 99.434 |
| 5.41257 | 99.435 |
| 5.41643 | 99.44 |
| 5.42029 | 99.451 |
| 5.42415 | 99.457 |
| 5.4280100000000004 | 99.436 |
| 5.43187 | 99.415 |
| 5.4357299999999995 | 99.405 |
| 5.43959 | 99.407 |
| 5.4434499999999995 | 99.41 |
| 5.447310000000001 | 99.409 |
| 5.45118 | 99.409 |
| 5.45504 | 99.413 |
| 5.4589 | 99.425 |
| 5.46276 | 99.445 |
| 5.46662 | 99.454 |
| 5.470479999999999 | 99.437 |
| 5.47434 | 99.423 |
| 5.4782 | 99.428 |
| 5.482060000000001 | 99.431 |
| 5.48592 | 99.423 |
| 5.48978 | 99.418 |
| 5.49364 | 99.412 |
| 5.4975 | 99.407 |
| 5.50136 | 99.404 |
| 5.5052200000000004 | 99.402 |
| 5.50908 | 99.4 |
| 5.5129399999999995 | 99.401 |
| 5.51681 | 99.407 |
| 5.52067 | 99.415 |
| 5.5245299999999995 | 99.418 |
| 5.52839 | 99.412 |
| 5.53225 | 99.405 |
| 5.53611 | 99.401 |
| 5.53997 | 99.4 |
| 5.54383 | 99.402 |
| 5.547689999999999 | 99.407 |
| 5.55155 | 99.412 |
| 5.55541 | 99.41 |
| 5.559270000000001 | 99.4 |
| 5.56313 | 99.391 |
| 5.56699 | 99.391 |
| 5.57085 | 99.393 |
| 5.57471 | 99.396 |
| 5.57858 | 99.406 |
| 5.582439999999999 | 99.4 |
| 5.5863000000000005 | 99.378 |
| 5.59016 | 99.362 |
| 5.59402 | 99.354 |
| 5.59788 | 99.352 |
| 5.6017399999999995 | 99.353 |
| 5.605600000000001 | 99.357 |
| 5.60946 | 99.357 |
| 5.61332 | 99.356 |
| 5.61718 | 99.356 |
| 5.62104 | 99.347 |
| 5.624899999999999 | 99.337 |
| 5.628760000000001 | 99.336 |
| 5.63262 | 99.343 |
| 5.63648 | 99.354 |
| 5.64034 | 99.373 |
| 5.64421 | 99.385 |
| 5.64807 | 99.372 |
| 5.65193 | 99.348 |
| 5.65579 | 99.332 |
| 5.65965 | 99.324 |
| 5.6635100000000005 | 99.316 |
| 5.66737 | 99.31 |
| 5.6712299999999995 | 99.314 |
| 5.67509 | 99.323 |
| 5.6789499999999995 | 99.322 |
| 5.682810000000001 | 99.308 |
| 5.68667 | 99.302 |
| 5.69053 | 99.308 |
| 5.69439 | 99.308 |
| 5.69825 | 99.295 |
| 5.702109999999999 | 99.285 |
| 5.705979999999999 | 99.286 |
| 5.70984 | 99.293 |
| 5.7137 | 99.295 |
| 5.717560000000001 | 99.296 |
| 5.72142 | 99.291 |
| 5.72528 | 99.28 |
| 5.72914 | 99.271 |
| 5.733 | 99.269 |
| 5.73686 | 99.262 |
| 5.7407200000000005 | 99.249 |
| 5.74458 | 99.25 |
| 5.7484399999999996 | 99.257 |
| 5.7523 | 99.24 |
| 5.7561599999999995 | 99.215 |
| 5.760020000000001 | 99.21 |
| 5.76388 | 99.228 |
| 5.76774 | 99.241 |
| 5.77161 | 99.213 |
| 5.77547 | 99.179 |
| 5.77933 | 99.152 |
| 5.783189999999999 | 99.126 |
| 5.78705 | 99.097 |
| 5.79091 | 99.073 |
| 5.794770000000001 | 99.053 |
| 5.79863 | 99.04 |
| 5.80249 | 99.032 |
| 5.80635 | 99.019 |
| 5.81021 | 99.006 |
| 5.81407 | 99.011 |
| 5.8179300000000005 | 99.029 |
| 5.82179 | 99.037 |
| 5.8256499999999996 | 99.014 |
| 5.82951 | 98.978 |
| 5.83338 | 98.937 |
| 5.8372399999999995 | 98.893 |
| 5.8411 | 98.859 |
| 5.84496 | 98.837 |
| 5.84882 | 98.816 |
| 5.85268 | 98.786 |
| 5.85654 | 98.762 |
| 5.860399999999999 | 98.747 |
| 5.86426 | 98.728 |
| 5.86812 | 98.697 |
| 5.87198 | 98.668 |
| 5.87584 | 98.66 |
| 5.8797 | 98.663 |
| 5.88356 | 98.626 |
| 5.88742 | 98.565 |
| 5.89128 | 98.527 |
| 5.8951400000000005 | 98.499 |
| 5.8990100000000005 | 98.449 |
| 5.90287 | 98.384 |
| 5.90673 | 98.332 |
| 5.91059 | 98.29 |
| 5.9144499999999995 | 98.255 |
| 5.91831 | 98.218 |
| 5.92217 | 98.175 |
| 5.92603 | 98.132 |
| 5.92989 | 98.102 |
| 5.93375 | 98.091 |
| 5.937609999999999 | 98.064 |
| 5.941470000000001 | 97.992 |
| 5.94533 | 97.91 |
| 5.94919 | 97.843 |
| 5.95305 | 97.781 |
| 5.95691 | 97.717 |
| 5.96078 | 97.663 |
| 5.96464 | 97.627 |
| 5.9685 | 97.591 |
| 5.97236 | 97.531 |
| 5.9762200000000005 | 97.46 |
| 5.98008 | 97.396 |
| 5.98394 | 97.345 |
| 5.9878 | 97.298 |
| 5.9916599999999995 | 97.227 |
| 5.995520000000001 | 97.132 |
| 5.99938 | 97.046 |
| 6.00324 | 96.974 |
| 6.0071 | 96.913 |
| 6.01096 | 96.854 |
| 6.014819999999999 | 96.784 |
| 6.018680000000001 | 96.701 |
| 6.02254 | 96.618 |
| 6.02641 | 96.539 |
| 6.030270000000001 | 96.461 |
| 6.03413 | 96.386 |
| 6.03799 | 96.326 |
| 6.04185 | 96.286 |
| 6.04571 | 96.252 |
| 6.04957 | 96.162 |
| 6.0534300000000005 | 96.01 |
| 6.05729 | 95.886 |
| 6.06115 | 95.804 |
| 6.06501 | 95.742 |
| 6.0688699999999995 | 95.678 |
| 6.07273 | 95.586 |
| 6.07659 | 95.456 |
| 6.08045 | 95.321 |
| 6.08431 | 95.208 |
| 6.08818 | 95.11 |
| 6.09204 | 95.02 |
| 6.095899999999999 | 94.936 |
| 6.09976 | 94.856 |
| 6.10362 | 94.786 |
| 6.10748 | 94.725 |
| 6.11134 | 94.668 |
| 6.1152 | 94.585 |
| 6.11906 | 94.484 |
| 6.12292 | 94.403 |
| 6.12678 | 94.345 |
| 6.1306400000000005 | 94.3 |
| 6.1345 | 94.268 |
| 6.13836 | 94.253 |
| 6.14222 | 94.251 |
| 6.1460799999999995 | 94.254 |
| 6.14994 | 94.261 |
| 6.15381 | 94.284 |
| 6.15767 | 94.329 |
| 6.16153 | 94.382 |
| 6.16539 | 94.427 |
| 6.16925 | 94.477 |
| 6.173109999999999 | 94.55 |
| 6.17697 | 94.641 |
| 6.18083 | 94.75 |
| 6.18469 | 94.894 |
| 6.18855 | 95.047 |
| 6.19241 | 95.165 |
| 6.19627 | 95.27 |
| 6.20013 | 95.39 |
| 6.20399 | 95.521 |
| 6.2078500000000005 | 95.659 |
| 6.21171 | 95.806 |
| 6.21558 | 95.959 |
| 6.21944 | 96.11 |
| 6.2233 | 96.253 |
| 6.22716 | 96.388 |
| 6.23102 | 96.514 |
| 6.23488 | 96.639 |
| 6.23874 | 96.762 |
| 6.2426 | 96.877 |
| 6.24646 | 96.985 |
| 6.250319999999999 | 97.086 |
| 6.25418 | 97.18 |
| 6.25804 | 97.268 |
| 6.2619 | 97.354 |
| 6.26576 | 97.438 |
| 6.26962 | 97.516 |
| 6.273479999999999 | 97.587 |
| 6.277340000000001 | 97.65 |
| 6.28121 | 97.706 |
| 6.285069999999999 | 97.758 |
| 6.288930000000001 | 97.808 |
| 6.29279 | 97.854 |
| 6.29665 | 97.899 |
| 6.30051 | 97.942 |
| 6.30437 | 97.977 |
| 6.30823 | 98.007 |
| 6.31209 | 98.036 |
| 6.31595 | 98.065 |
| 6.31981 | 98.09 |
| 6.32367 | 98.113 |
| 6.327529999999999 | 98.138 |
| 6.331390000000001 | 98.165 |
| 6.33525 | 98.194 |
| 6.33911 | 98.229 |
| 6.34298 | 98.272 |
| 6.34684 | 98.302 |
| 6.3507 | 98.304 |
| 6.35456 | 98.298 |
| 6.35842 | 98.3 |
| 6.36228 | 98.312 |
| 6.366140000000001 | 98.336 |
| 6.37 | 98.366 |
| 6.37386 | 98.381 |
| 6.37772 | 98.377 |
| 6.38158 | 98.372 |
| 6.38544 | 98.376 |
| 6.3893 | 98.388 |
| 6.39316 | 98.395 |
| 6.39702 | 98.394 |
| 6.40088 | 98.395 |
| 6.404739999999999 | 98.411 |
| 6.4086099999999995 | 98.457 |
| 6.41247 | 98.531 |
| 6.41633 | 98.578 |
| 6.42019 | 98.559 |
| 6.42405 | 98.515 |
| 6.42791 | 98.489 |
| 6.43177 | 98.482 |
| 6.43563 | 98.479 |
| 6.43949 | 98.47 |
| 6.443350000000001 | 98.462 |
| 6.44721 | 98.464 |
| 6.45107 | 98.471 |
| 6.45493 | 98.473 |
| 6.45879 | 98.469 |
| 6.46265 | 98.468 |
| 6.46651 | 98.479 |
| 6.4703800000000005 | 98.5 |
| 6.47424 | 98.529 |
| 6.4781 | 98.559 |
| 6.48196 | 98.595 |
| 6.4858199999999995 | 98.638 |
| 6.48968 | 98.676 |
| 6.49354 | 98.696 |
| 6.4974 | 98.682 |
| 6.50126 | 98.65 |
| 6.50512 | 98.625 |
| 6.508979999999999 | 98.614 |
| 6.51284 | 98.62 |
| 6.5167 | 98.645 |
| 6.520560000000001 | 98.679 |
| 6.52442 | 98.703 |
| 6.52828 | 98.709 |
| 6.53214 | 98.709 |
| 6.53601 | 98.714 |
| 6.53987 | 98.726 |
| 6.543729999999999 | 98.741 |
| 6.5475900000000005 | 98.757 |
| 6.55145 | 98.776 |
| 6.55531 | 98.799 |
| 6.55917 | 98.818 |
| 6.5630299999999995 | 98.835 |
| 6.56689 | 98.861 |
| 6.57075 | 98.898 |
| 6.57461 | 98.925 |
| 6.57847 | 98.924 |
| 6.58233 | 98.908 |
| 6.586189999999999 | 98.902 |
| 6.59005 | 98.914 |
| 6.59391 | 98.933 |
| 6.597779999999999 | 98.938 |
| 6.601640000000001 | 98.93 |
| 6.6055 | 98.926 |
| 6.60936 | 98.929 |
| 6.61322 | 98.938 |
| 6.61708 | 98.951 |
| 6.620939999999999 | 98.967 |
| 6.6248000000000005 | 98.99 |
| 6.62866 | 99.022 |
| 6.63252 | 99.065 |
| 6.63638 | 99.105 |
| 6.6402399999999995 | 99.114 |
| 6.644100000000001 | 99.082 |
| 6.64796 | 99.046 |
| 6.65182 | 99.028 |
| 6.65568 | 99.025 |
| 6.65954 | 99.029 |
| 6.66341 | 99.034 |
| 6.66727 | 99.04 |
| 6.67113 | 99.045 |
| 6.67499 | 99.051 |
| 6.678850000000001 | 99.058 |
| 6.68271 | 99.066 |
| 6.68657 | 99.07 |
| 6.69043 | 99.062 |
| 6.69429 | 99.051 |
| 6.69815 | 99.046 |
| 6.7020100000000005 | 99.054 |
| 6.70587 | 99.072 |
| 6.7097299999999995 | 99.09 |
| 6.71359 | 99.098 |
| 6.7174499999999995 | 99.096 |
| 6.721310000000001 | 99.092 |
| 6.72518 | 99.079 |
| 6.72904 | 99.055 |
| 6.7329 | 99.03 |
| 6.73676 | 99.012 |
| 6.74062 | 99.004 |
| 6.744479999999999 | 99.004 |
| 6.74834 | 99.008 |
| 6.7522 | 99.01 |
| 6.756060000000001 | 99.004 |
| 6.75992 | 98.995 |
| 6.76378 | 98.99 |
| 6.76764 | 98.992 |
| 6.7715 | 98.997 |
| 6.77536 | 99 |
| 6.7792200000000005 | 99.001 |
| 6.78308 | 99.006 |
| 6.7869399999999995 | 99.017 |
| 6.7908100000000005 | 99.014 |
| 6.79467 | 98.992 |
| 6.7985299999999995 | 98.965 |
| 6.80239 | 98.94 |
| 6.80625 | 98.92 |
| 6.81011 | 98.905 |
| 6.81397 | 98.898 |
| 6.81783 | 98.908 |
| 6.821689999999999 | 98.925 |
| 6.82555 | 98.936 |
| 6.82941 | 98.934 |
| 6.833270000000001 | 98.92 |
| 6.83713 | 98.904 |
| 6.84099 | 98.896 |
| 6.84485 | 98.9 |
| 6.84871 | 98.913 |
| 6.85258 | 98.933 |
| 6.856439999999999 | 98.957 |
| 6.8603000000000005 | 98.98 |
| 6.86416 | 98.996 |
| 6.8680200000000005 | 99 |
| 6.87188 | 98.992 |
| 6.8757399999999995 | 98.984 |
| 6.8796 | 98.976 |
| 6.88346 | 98.971 |
| 6.88732 | 98.967 |
| 6.89118 | 98.961 |
| 6.89504 | 98.959 |
| 6.898899999999999 | 98.968 |
| 6.90276 | 98.988 |
| 6.90662 | 99.008 |
| 6.91048 | 99.022 |
| 6.91434 | 99.024 |
| 6.91821 | 99.02 |
| 6.92207 | 99.019 |
| 6.92593 | 99.021 |
| 6.92979 | 99.024 |
| 6.933649999999999 | 99.025 |
| 6.9375100000000005 | 99.023 |
| 6.94137 | 99.02 |
| 6.94523 | 99.018 |
| 6.94909 | 99.024 |
| 6.9529499999999995 | 99.041 |
| 6.956810000000001 | 99.067 |
| 6.96067 | 99.091 |
| 6.96453 | 99.091 |
| 6.96839 | 99.075 |
| 6.97225 | 99.062 |
| 6.976109999999999 | 99.056 |
| 6.979979999999999 | 99.056 |
| 6.98384 | 99.06 |
| 6.9877 | 99.064 |
| 6.991560000000001 | 99.069 |
| 6.99542 | 99.073 |
| 6.99928 | 99.073 |
| 7.00314 | 99.07 |
| 7.007 | 99.062 |
| 7.01086 | 99.054 |
| 7.0147200000000005 | 99.049 |
| 7.01858 | 99.045 |
| 7.02244 | 99.044 |
| 7.0263 | 99.046 |
| 7.0301599999999995 | 99.052 |
| 7.034020000000001 | 99.06 |
| 7.03788 | 99.071 |
| 7.04174 | 99.082 |
| 7.04561 | 99.091 |
| 7.04947 | 99.093 |
| 7.05333 | 99.093 |
| 7.057189999999999 | 99.091 |
| 7.06105 | 99.088 |
| 7.06491 | 99.081 |
| 7.068770000000001 | 99.074 |
| 7.07263 | 99.071 |
| 7.07649 | 99.073 |
| 7.08035 | 99.076 |
| 7.08421 | 99.078 |
| 7.08807 | 99.077 |
| 7.0919300000000005 | 99.08 |
| 7.09579 | 99.087 |
| 7.09965 | 99.095 |
| 7.10351 | 99.102 |
| 7.10738 | 99.108 |
| 7.11124 | 99.115 |
| 7.1151 | 99.125 |
| 7.11896 | 99.135 |
| 7.12282 | 99.142 |
| 7.12668 | 99.141 |
| 7.13054 | 99.136 |
| 7.134399999999999 | 99.13 |
| 7.13826 | 99.128 |
| 7.14212 | 99.137 |
| 7.14598 | 99.152 |
| 7.14984 | 99.163 |
| 7.1537 | 99.168 |
| 7.15756 | 99.168 |
| 7.16142 | 99.166 |
| 7.16528 | 99.16 |
| 7.1691400000000005 | 99.15 |
| 7.1730100000000006 | 99.138 |
| 7.17687 | 99.123 |
| 7.18073 | 99.11 |
| 7.18459 | 99.102 |
| 7.18845 | 99.099 |
| 7.19231 | 99.099 |
| 7.19617 | 99.098 |
| 7.20003 | 99.1 |
| 7.20389 | 99.104 |
| 7.20775 | 99.109 |
| 7.211609999999999 | 99.107 |
| 7.21547 | 99.1 |
| 7.21933 | 99.094 |
| 7.22319 | 99.092 |
| 7.22705 | 99.094 |
| 7.23091 | 99.097 |
| 7.23478 | 99.1 |
| 7.23864 | 99.105 |
| 7.2425 | 99.112 |
| 7.246359999999999 | 99.116 |
| 7.2502200000000006 | 99.117 |
| 7.25408 | 99.116 |
| 7.25794 | 99.116 |
| 7.2618 | 99.12 |
| 7.26566 | 99.127 |
| 7.269520000000001 | 99.136 |
| 7.27338 | 99.146 |
| 7.27724 | 99.153 |
| 7.2811 | 99.153 |
| 7.28496 | 99.152 |
| 7.288819999999999 | 99.154 |
| 7.292680000000001 | 99.16 |
| 7.29654 | 99.165 |
| 7.30041 | 99.166 |
| 7.304270000000001 | 99.164 |
| 7.30813 | 99.159 |
| 7.31199 | 99.154 |
| 7.31585 | 99.152 |
| 7.31971 | 99.151 |
| 7.32357 | 99.153 |
| 7.3274300000000006 | 99.154 |
| 7.33129 | 99.155 |
| 7.33515 | 99.153 |
| 7.33901 | 99.149 |
| 7.34287 | 99.146 |
| 7.34673 | 99.146 |
| 7.35059 | 99.149 |
| 7.35445 | 99.155 |
| 7.35831 | 99.157 |
| 7.36218 | 99.156 |
| 7.36604 | 99.152 |
| 7.3698999999999995 | 99.146 |
| 7.37376 | 99.14 |
| 7.37762 | 99.136 |
| 7.38148 | 99.133 |
| 7.38534 | 99.128 |
| 7.3892 | 99.123 |
| 7.39306 | 99.116 |
| 7.39692 | 99.112 |
| 7.40078 | 99.112 |
| 7.4046400000000006 | 99.112 |
| 7.4085 | 99.11 |
| 7.41236 | 99.103 |
| 7.41622 | 99.094 |
| 7.42008 | 99.088 |
| 7.42394 | 99.084 |
| 7.42781 | 99.086 |
| 7.43167 | 99.089 |
| 7.43553 | 99.091 |
| 7.43939 | 99.089 |
| 7.44325 | 99.08 |
| 7.4471099999999995 | 99.07 |
| 7.45097 | 99.059 |
| 7.45483 | 99.054 |
| 7.45869 | 99.055 |
| 7.46255 | 99.059 |
| 7.46641 | 99.064 |
| 7.47027 | 99.061 |
| 7.47413 | 99.054 |
| 7.47799 | 99.041 |
| 7.4818500000000006 | 99.024 |
| 7.48571 | 99.01 |
| 7.48958 | 98.999 |
| 7.49344 | 98.992 |
| 7.4973 | 98.992 |
| 7.50116 | 98.991 |
| 7.50502 | 98.989 |
| 7.50888 | 98.983 |
| 7.51274 | 98.974 |
| 7.5166 | 98.964 |
| 7.52046 | 98.954 |
| 7.5243199999999995 | 98.95 |
| 7.52818 | 98.948 |
| 7.53204 | 98.948 |
| 7.5359 | 98.946 |
| 7.53976 | 98.943 |
| 7.54362 | 98.938 |
| 7.547479999999999 | 98.934 |
| 7.55134 | 98.934 |
| 7.55521 | 98.935 |
| 7.559069999999999 | 98.938 |
| 7.562930000000001 | 98.938 |
| 7.56679 | 98.936 |
| 7.57065 | 98.932 |
| 7.57451 | 98.928 |
| 7.57837 | 98.926 |
| 7.582229999999999 | 98.923 |
| 7.58609 | 98.919 |
| 7.58995 | 98.914 |
| 7.59381 | 98.908 |
| 7.59767 | 98.901 |
| 7.6015299999999995 | 98.898 |
| 7.605390000000001 | 98.898 |
| 7.60925 | 98.902 |
| 7.61311 | 98.908 |
| 7.61698 | 98.908 |
| 7.62084 | 98.905 |
| 7.6247 | 98.894 |
| 7.62856 | 98.884 |
| 7.63242 | 98.877 |
| 7.63628 | 98.874 |
| 7.640140000000001 | 98.872 |
| 7.644 | 98.868 |
| 7.64786 | 98.862 |
| 7.65172 | 98.854 |
| 7.65558 | 98.848 |
| 7.65944 | 98.845 |
| 7.6633000000000004 | 98.848 |
| 7.66716 | 98.851 |
| 7.67102 | 98.855 |
| 7.67488 | 98.854 |
| 7.6787399999999995 | 98.848 |
| 7.6826099999999995 | 98.84 |
| 7.68647 | 98.831 |
| 7.69033 | 98.825 |
| 7.69419 | 98.821 |
| 7.69805 | 98.822 |
| 7.70191 | 98.825 |
| 7.70577 | 98.826 |
| 7.70963 | 98.824 |
| 7.71349 | 98.816 |
| 7.717350000000001 | 98.806 |
| 7.72121 | 98.795 |
| 7.72507 | 98.788 |
| 7.72893 | 98.783 |
| 7.73279 | 98.783 |
| 7.73665 | 98.783 |
| 7.7405100000000004 | 98.782 |
| 7.7443800000000005 | 98.777 |
| 7.74824 | 98.77 |
| 7.7521 | 98.764 |
| 7.75596 | 98.759 |
| 7.7598199999999995 | 98.756 |
| 7.76368 | 98.751 |
| 7.76754 | 98.744 |
| 7.7714 | 98.738 |
| 7.77526 | 98.732 |
| 7.77912 | 98.73 |
| 7.782979999999999 | 98.728 |
| 7.78684 | 98.726 |
| 7.7907 | 98.722 |
| 7.794560000000001 | 98.717 |
| 7.79842 | 98.711 |
| 7.80228 | 98.706 |
| 7.80614 | 98.701 |
| 7.81001 | 98.694 |
| 7.81387 | 98.685 |
| 7.817729999999999 | 98.676 |
| 7.8215900000000005 | 98.667 |
| 7.82545 | 98.663 |
| 7.82931 | 98.659 |
| 7.83317 | 98.656 |
| 7.8370299999999995 | 98.652 |
| 7.84089 | 98.647 |
| 7.84475 | 98.643 |
| 7.84861 | 98.642 |
| 7.85247 | 98.64 |
| 7.85633 | 98.638 |
| 7.860189999999999 | 98.634 |
| 7.86405 | 98.631 |
| 7.86791 | 98.627 |
| 7.871779999999999 | 98.624 |
| 7.875640000000001 | 98.622 |
| 7.8795 | 98.621 |
| 7.88336 | 98.617 |
| 7.88722 | 98.613 |
| 7.89108 | 98.605 |
| 7.894939999999999 | 98.596 |
| 7.8988000000000005 | 98.587 |
| 7.90266 | 98.578 |
| 7.90652 | 98.57 |
| 7.91038 | 98.561 |
| 7.9142399999999995 | 98.554 |
| 7.918100000000001 | 98.548 |
| 7.92196 | 98.542 |
| 7.92582 | 98.532 |
| 7.92968 | 98.521 |
| 7.93354 | 98.51 |
| 7.93741 | 98.501 |
| 7.94127 | 98.494 |
| 7.94513 | 98.486 |
| 7.94899 | 98.475 |
| 7.952850000000001 | 98.461 |
| 7.95671 | 98.444 |
| 7.96057 | 98.429 |
| 7.96443 | 98.418 |
| 7.96829 | 98.411 |
| 7.97215 | 98.406 |
| 7.9760100000000005 | 98.401 |
| 7.97987 | 98.394 |
| 7.9837299999999995 | 98.385 |
| 7.98759 | 98.372 |
| 7.9914499999999995 | 98.358 |
| 7.995310000000001 | 98.344 |
| 7.99918 | 98.334 |
| 8.00304 | 98.326 |
| 8.0069 | 98.32 |
| 8.01076 | 98.315 |
| 8.01462 | 98.31 |
| 8.01848 | 98.304 |
| 8.02234 | 98.297 |
| 8.0262 | 98.288 |
| 8.03006 | 98.277 |
| 8.03392 | 98.264 |
| 8.03778 | 98.248 |
| 8.041640000000001 | 98.233 |
| 8.0455 | 98.219 |
| 8.04936 | 98.211 |
| 8.05322 | 98.204 |
| 8.05708 | 98.201 |
| 8.06094 | 98.197 |
| 8.06481 | 98.192 |
| 8.068670000000001 | 98.184 |
| 8.07253 | 98.176 |
| 8.07639 | 98.168 |
| 8.08025 | 98.162 |
| 8.084109999999999 | 98.156 |
| 8.08797 | 98.152 |
| 8.09183 | 98.146 |
| 8.09569 | 98.139 |
| 8.09955 | 98.131 |
| 8.10341 | 98.122 |
| 8.10727 | 98.114 |
| 8.11113 | 98.108 |
| 8.11499 | 98.103 |
| 8.11885 | 98.099 |
| 8.12271 | 98.094 |
| 8.12658 | 98.089 |
| 8.13044 | 98.082 |
| 8.1343 | 98.075 |
| 8.13816 | 98.064 |
| 8.14202 | 98.053 |
| 8.14588 | 98.04 |
| 8.14974 | 98.028 |
| 8.1536 | 98.018 |
| 8.15746 | 98.012 |
| 8.16132 | 98.007 |
| 8.16518 | 98.004 |
| 8.16904 | 98.002 |
| 8.1729 | 97.999 |
| 8.17676 | 97.994 |
| 8.18062 | 97.987 |
| 8.184479999999999 | 97.978 |
| 8.18834 | 97.968 |
| 8.19221 | 97.957 |
| 8.196069999999999 | 97.946 |
| 8.19993 | 97.934 |
| 8.203790000000001 | 97.922 |
| 8.20765 | 97.91 |
| 8.21151 | 97.899 |
| 8.21537 | 97.891 |
| 8.21923 | 97.886 |
| 8.223090000000001 | 97.884 |
| 8.22695 | 97.885 |
| 8.23081 | 97.888 |
| 8.23467 | 97.889 |
| 8.23853 | 97.888 |
| 8.242389999999999 | 97.884 |
| 8.24625 | 97.878 |
| 8.250110000000001 | 97.871 |
| 8.25398 | 97.864 |
| 8.25784 | 97.857 |
| 8.261700000000001 | 97.852 |
| 8.265559999999999 | 97.849 |
| 8.26942 | 97.846 |
| 8.273280000000002 | 97.843 |
| 8.27714 | 97.84 |
| 8.281 | 97.837 |
| 8.28486 | 97.831 |
| 8.28872 | 97.823 |
| 8.29258 | 97.812 |
| 8.29644 | 97.8 |
| 8.3003 | 97.79 |
| 8.30416 | 97.781 |
| 8.30802 | 97.775 |
| 8.311879999999999 | 97.767 |
| 8.31574 | 97.76 |
| 8.31961 | 97.751 |
| 8.323469999999999 | 97.742 |
| 8.32733 | 97.734 |
| 8.331190000000001 | 97.725 |
| 8.335049999999999 | 97.718 |
| 8.33891 | 97.71 |
| 8.34277 | 97.702 |
| 8.34663 | 97.693 |
| 8.35049 | 97.685 |
| 8.35435 | 97.675 |
| 8.35821 | 97.666 |
| 8.36207 | 97.658 |
| 8.36593 | 97.649 |
| 8.36979 | 97.64 |
| 8.37365 | 97.63 |
| 8.377510000000001 | 97.618 |
| 8.38138 | 97.607 |
| 8.38524 | 97.597 |
| 8.389100000000001 | 97.589 |
| 8.392959999999999 | 97.582 |
| 8.39682 | 97.575 |
| 8.40068 | 97.567 |
| 8.40454 | 97.559 |
| 8.4084 | 97.547 |
| 8.41226 | 97.535 |
| 8.416120000000001 | 97.52 |
| 8.419979999999999 | 97.504 |
| 8.42384 | 97.488 |
| 8.427700000000002 | 97.473 |
| 8.43156 | 97.458 |
| 8.43542 | 97.447 |
| 8.43928 | 97.435 |
| 8.44314 | 97.422 |
| 8.44701 | 97.408 |
| 8.45087 | 97.392 |
| 8.45473 | 97.377 |
| 8.458590000000001 | 97.362 |
| 8.46245 | 97.35 |
| 8.46631 | 97.338 |
| 8.47017 | 97.328 |
| 8.47403 | 97.317 |
| 8.477889999999999 | 97.306 |
| 8.48175 | 97.293 |
| 8.485610000000001 | 97.28 |
| 8.489469999999999 | 97.265 |
| 8.49333 | 97.25 |
| 8.49719 | 97.235 |
| 8.50105 | 97.22 |
| 8.50491 | 97.207 |
| 8.50878 | 97.195 |
| 8.51264 | 97.184 |
| 8.5165 | 97.173 |
| 8.52036 | 97.163 |
| 8.52422 | 97.152 |
| 8.52808 | 97.14 |
| 8.53194 | 97.126 |
| 8.5358 | 97.113 |
| 8.53966 | 97.1 |
| 8.543520000000001 | 97.087 |
| 8.547379999999999 | 97.076 |
| 8.55124 | 97.066 |
| 8.5551 | 97.057 |
| 8.558959999999999 | 97.049 |
| 8.56282 | 97.041 |
| 8.56668 | 97.03 |
| 8.570540000000001 | 97.017 |
| 8.57441 | 96.999 |
| 8.57827 | 96.98 |
| 8.58213 | 96.96 |
| 8.585989999999999 | 96.942 |
| 8.58985 | 96.929 |
| 8.59371 | 96.916 |
| 8.59757 | 96.906 |
| 8.60143 | 96.896 |
| 8.60529 | 96.884 |
| 8.60915 | 96.872 |
| 8.613010000000001 | 96.858 |
| 8.61687 | 96.844 |
| 8.62073 | 96.829 |
| 8.62459 | 96.815 |
| 8.62845 | 96.8 |
| 8.63231 | 96.787 |
| 8.63618 | 96.775 |
| 8.64004 | 96.763 |
| 8.6439 | 96.751 |
| 8.64776 | 96.738 |
| 8.651620000000001 | 96.725 |
| 8.655479999999999 | 96.71 |
| 8.65934 | 96.693 |
| 8.663200000000002 | 96.676 |
| 8.66706 | 96.659 |
| 8.67092 | 96.642 |
| 8.67478 | 96.628 |
| 8.67864 | 96.614 |
| 8.6825 | 96.602 |
| 8.68636 | 96.59 |
| 8.69022 | 96.575 |
| 8.69408 | 96.56 |
| 8.697940000000001 | 96.544 |
| 8.70181 | 96.529 |
| 8.70567 | 96.515 |
| 8.70953 | 96.502 |
| 8.713389999999999 | 96.492 |
| 8.71725 | 96.481 |
| 8.721110000000001 | 96.47 |
| 8.724969999999999 | 96.459 |
| 8.72883 | 96.447 |
| 8.73269 | 96.433 |
| 8.73655 | 96.418 |
| 8.74041 | 96.399 |
| 8.74427 | 96.378 |
| 8.74813 | 96.358 |
| 8.75199 | 96.338 |
| 8.75585 | 96.325 |
| 8.759709999999998 | 96.313 |
| 8.76357 | 96.309 |
| 8.76744 | 96.305 |
| 8.7713 | 96.303 |
| 8.77516 | 96.299 |
| 8.779020000000001 | 96.291 |
| 8.782879999999999 | 96.281 |
| 8.78674 | 96.266 |
| 8.7906 | 96.253 |
| 8.794459999999999 | 96.24 |
| 8.79832 | 96.23 |
| 8.80218 | 96.224 |
| 8.806040000000001 | 96.219 |
| 8.809899999999999 | 96.216 |
| 8.81376 | 96.214 |
| 8.817620000000002 | 96.21 |
| 8.82148 | 96.204 |
| 8.82534 | 96.196 |
| 8.82921 | 96.188 |
| 8.83307 | 96.178 |
| 8.83693 | 96.169 |
| 8.84079 | 96.161 |
| 8.84465 | 96.15 |
| 8.848510000000001 | 96.139 |
| 8.85237 | 96.125 |
| 8.85623 | 96.11 |
| 8.86009 | 96.097 |
| 8.86395 | 96.084 |
| 8.867809999999999 | 96.074 |
| 8.87167 | 96.063 |
| 8.875530000000001 | 96.052 |
| 8.879389999999999 | 96.042 |
| 8.88325 | 96.031 |
| 8.88711 | 96.02 |
| 8.89097 | 96.011 |
| 8.89484 | 96.002 |
| 8.898700000000002 | 95.993 |
| 8.90256 | 95.984 |
| 8.90642 | 95.975 |
| 8.91028 | 95.965 |
| 8.91414 | 95.957 |
| 8.918 | 95.948 |
| 8.92186 | 95.94 |
| 8.92572 | 95.932 |
| 8.92958 | 95.92 |
| 8.933440000000001 | 95.907 |
| 8.937299999999999 | 95.888 |
| 8.94116 | 95.869 |
| 8.945020000000001 | 95.85 |
| 8.948879999999999 | 95.832 |
| 8.95274 | 95.82 |
| 8.956610000000001 | 95.809 |
| 8.960469999999999 | 95.803 |
| 8.96433 | 95.797 |
| 8.96819 | 95.791 |
| 8.97205 | 95.784 |
| 8.97591 | 95.774 |
| 8.97977 | 95.764 |
| 8.98363 | 95.754 |
| 8.98749 | 95.743 |
| 8.99135 | 95.734 |
| 8.995209999999998 | 95.725 |
| 8.99907 | 95.714 |
| 9.002930000000001 | 95.704 |
| 9.00679 | 95.689 |
| 9.01065 | 95.674 |
| 9.01451 | 95.658 |
| 9.01837 | 95.642 |
| 9.02224 | 95.63 |
| 9.0261 | 95.618 |
| 9.029959999999999 | 95.611 |
| 9.03382 | 95.603 |
| 9.03768 | 95.592 |
| 9.041540000000001 | 95.582 |
| 9.045399999999999 | 95.567 |
| 9.04926 | 95.552 |
| 9.053120000000002 | 95.533 |
| 9.05698 | 95.513 |
| 9.06084 | 95.492 |
| 9.0647 | 95.471 |
| 9.06856 | 95.449 |
| 9.07242 | 95.428 |
| 9.07628 | 95.409 |
| 9.08014 | 95.39 |
| 9.084010000000001 | 95.372 |
| 9.08787 | 95.354 |
| 9.09173 | 95.337 |
| 9.09559 | 95.32 |
| 9.099450000000001 | 95.305 |
| 9.103309999999999 | 95.289 |
| 9.10717 | 95.275 |
| 9.111030000000001 | 95.262 |
| 9.114889999999999 | 95.248 |
| 9.11875 | 95.234 |
| 9.12261 | 95.218 |
| 9.12647 | 95.199 |
| 9.13033 | 95.181 |
| 9.13419 | 95.162 |
| 9.13805 | 95.143 |
| 9.14191 | 95.125 |
| 9.14577 | 95.108 |
| 9.14964 | 95.093 |
| 9.1535 | 95.077 |
| 9.15736 | 95.065 |
| 9.16122 | 95.054 |
| 9.16508 | 95.045 |
| 9.168940000000001 | 95.037 |
| 9.172799999999999 | 95.027 |
| 9.17666 | 95.017 |
| 9.18052 | 95.004 |
| 9.184379999999999 | 94.989 |
| 9.18824 | 94.973 |
| 9.1921 | 94.955 |
| 9.19596 | 94.937 |
| 9.199819999999999 | 94.919 |
| 9.20368 | 94.902 |
| 9.207540000000002 | 94.887 |
| 9.211409999999999 | 94.872 |
| 9.21527 | 94.858 |
| 9.21913 | 94.844 |
| 9.22299 | 94.831 |
| 9.22685 | 94.819 |
| 9.230709999999998 | 94.807 |
| 9.23457 | 94.796 |
| 9.238430000000001 | 94.787 |
| 9.24229 | 94.778 |
| 9.24615 | 94.77 |
| 9.25001 | 94.763 |
| 9.253870000000001 | 94.754 |
| 9.257729999999999 | 94.746 |
| 9.26159 | 94.736 |
| 9.265450000000001 | 94.725 |
| 9.269309999999999 | 94.712 |
| 9.27317 | 94.697 |
| 9.277040000000001 | 94.681 |
| 9.280899999999999 | 94.661 |
| 9.28476 | 94.641 |
| 9.288620000000002 | 94.624 |
| 9.29248 | 94.607 |
| 9.29634 | 94.598 |
| 9.3002 | 94.591 |
| 9.30406 | 94.584 |
| 9.30792 | 94.578 |
| 9.31178 | 94.568 |
| 9.31564 | 94.555 |
| 9.3195 | 94.538 |
| 9.323360000000001 | 94.517 |
| 9.327219999999999 | 94.495 |
| 9.33108 | 94.471 |
| 9.334940000000001 | 94.448 |
| 9.338809999999999 | 94.427 |
| 9.34267 | 94.406 |
| 9.346530000000001 | 94.391 |
| 9.350389999999999 | 94.377 |
| 9.35425 | 94.366 |
| 9.35811 | 94.356 |
| 9.36197 | 94.346 |
| 9.36583 | 94.335 |
| 9.36969 | 94.324 |
| 9.37355 | 94.311 |
| 9.37741 | 94.298 |
| 9.38127 | 94.28 |
| 9.385129999999998 | 94.262 |
| 9.38899 | 94.24 |
| 9.392850000000001 | 94.218 |
| 9.396709999999999 | 94.195 |
| 9.40057 | 94.172 |
| 9.404440000000001 | 94.152 |
| 9.408299999999999 | 94.132 |
| 9.41216 | 94.114 |
| 9.41602 | 94.098 |
| 9.41988 | 94.082 |
| 9.42374 | 94.066 |
| 9.4276 | 94.051 |
| 9.43146 | 94.037 |
| 9.435319999999999 | 94.022 |
| 9.43918 | 94.009 |
| 9.443040000000002 | 93.996 |
| 9.4469 | 93.984 |
| 9.45076 | 93.97 |
| 9.45462 | 93.956 |
| 9.45848 | 93.936 |
| 9.46234 | 93.916 |
| 9.466209999999998 | 93.892 |
| 9.47007 | 93.869 |
| 9.473930000000001 | 93.85 |
| 9.47779 | 93.833 |
| 9.48165 | 93.819 |
| 9.48551 | 93.81 |
| 9.489370000000001 | 93.801 |
| 9.493229999999999 | 93.794 |
| 9.49709 | 93.787 |
| 9.500950000000001 | 93.778 |
| 9.504809999999999 | 93.769 |
| 9.50867 | 93.758 |
| 9.51253 | 93.746 |
| 9.51639 | 93.732 |
| 9.52025 | 93.715 |
| 9.52411 | 93.697 |
| 9.52797 | 93.674 |
| 9.53184 | 93.652 |
| 9.5357 | 93.628 |
| 9.53956 | 93.604 |
| 9.54342 | 93.582 |
| 9.54728 | 93.561 |
| 9.55114 | 93.541 |
| 9.555 | 93.523 |
| 9.558860000000001 | 93.506 |
| 9.562719999999999 | 93.492 |
| 9.56658 | 93.479 |
| 9.570440000000001 | 93.465 |
| 9.5743 | 93.452 |
| 9.57816 | 93.438 |
| 9.58202 | 93.423 |
| 9.58588 | 93.408 |
| 9.589739999999999 | 93.396 |
| 9.59361 | 93.384 |
| 9.59747 | 93.377 |
| 9.60133 | 93.37 |
| 9.60519 | 93.363 |
| 9.60905 | 93.357 |
| 9.61291 | 93.35 |
| 9.61677 | 93.34 |
| 9.620629999999998 | 93.331 |
| 9.62449 | 93.319 |
| 9.628350000000001 | 93.308 |
| 9.632209999999999 | 93.296 |
| 9.63607 | 93.283 |
| 9.63993 | 93.269 |
| 9.643790000000001 | 93.254 |
| 9.64765 | 93.239 |
| 9.65151 | 93.219 |
| 9.655370000000001 | 93.199 |
| 9.65924 | 93.175 |
| 9.6631 | 93.15 |
| 9.66696 | 93.126 |
| 9.670819999999999 | 93.104 |
| 9.67468 | 93.081 |
| 9.678540000000002 | 93.068 |
| 9.6824 | 93.054 |
| 9.68626 | 93.046 |
| 9.69012 | 93.039 |
| 9.69398 | 93.033 |
| 9.69784 | 93.028 |
| 9.7017 | 93.022 |
| 9.70556 | 93.015 |
| 9.70942 | 93.008 |
| 9.713280000000001 | 92.999 |
| 9.717139999999999 | 92.988 |
| 9.72101 | 92.976 |
| 9.724870000000001 | 92.959 |
| 9.728729999999999 | 92.943 |
| 9.73259 | 92.922 |
| 9.736450000000001 | 92.9 |
| 9.74031 | 92.879 |
| 9.74417 | 92.858 |
| 9.74803 | 92.838 |
| 9.75189 | 92.82 |
| 9.75575 | 92.803 |
| 9.75961 | 92.792 |
| 9.76347 | 92.781 |
| 9.76733 | 92.772 |
| 9.77119 | 92.764 |
| 9.775049999999998 | 92.756 |
| 9.77891 | 92.742 |
| 9.782770000000001 | 92.728 |
| 9.78664 | 92.709 |
| 9.7905 | 92.688 |
| 9.794360000000001 | 92.666 |
| 9.798219999999999 | 92.644 |
| 9.80208 | 92.622 |
| 9.80594 | 92.603 |
| 9.8098 | 92.585 |
| 9.81366 | 92.569 |
| 9.81752 | 92.554 |
| 9.82138 | 92.539 |
| 9.825239999999999 | 92.526 |
| 9.8291 | 92.513 |
| 9.83296 | 92.499 |
| 9.83682 | 92.485 |
| 9.84068 | 92.47 |
| 9.84454 | 92.453 |
| 9.84841 | 92.436 |
| 9.85227 | 92.418 |
| 9.856129999999999 | 92.401 |
| 9.85999 | 92.383 |
| 9.863850000000001 | 92.366 |
| 9.867709999999999 | 92.348 |
| 9.87157 | 92.331 |
| 9.87543 | 92.313 |
| 9.879290000000001 | 92.296 |
| 9.883149999999999 | 92.279 |
| 9.88701 | 92.263 |
| 9.890870000000001 | 92.249 |
| 9.89473 | 92.235 |
| 9.89859 | 92.222 |
| 9.90245 | 92.208 |
| 9.90631 | 92.193 |
| 9.91017 | 92.177 |
| 9.914040000000002 | 92.16 |
| 9.9179 | 92.141 |
| 9.92176 | 92.122 |
| 9.92562 | 92.103 |
| 9.92948 | 92.083 |
| 9.93334 | 92.063 |
| 9.9372 | 92.043 |
| 9.94106 | 92.023 |
| 9.94492 | 92.002 |
| 9.948780000000001 | 91.981 |
| 9.952639999999999 | 91.959 |
| 9.9565 | 91.938 |
| 9.960360000000001 | 91.916 |
| 9.96422 | 91.896 |
| 9.96808 | 91.877 |
| 9.97194 | 91.859 |
| 9.97581 | 91.843 |
| 9.97967 | 91.828 |
| 9.98353 | 91.812 |
| 9.98739 | 91.797 |
| 9.99125 | 91.781 |
| 9.99511 | 91.763 |
| 9.99897 | 91.744 |
| 10.002799999999999 | 91.726 |
| 10.0067 | 91.707 |
| 10.0106 | 91.688 |
| 10.0144 | 91.669 |
| 10.0183 | 91.65 |
| 10.0221 | 91.632 |
| 10.026 | 91.614 |
| 10.0299 | 91.596 |
| 10.033700000000001 | 91.578 |
| 10.037600000000001 | 91.56 |
| 10.0414 | 91.541 |
| 10.0453 | 91.522 |
| 10.0492 | 91.503 |
| 10.053 | 91.481 |
| 10.056899999999999 | 91.46 |
| 10.0607 | 91.438 |
| 10.0646 | 91.417 |
| 10.0685 | 91.396 |
| 10.072299999999998 | 91.377 |
| 10.0762 | 91.359 |
| 10.08 | 91.342 |
| 10.0839 | 91.327 |
| 10.0878 | 91.312 |
| 10.0916 | 91.295 |
| 10.0955 | 91.278 |
| 10.0993 | 91.26 |
| 10.103200000000001 | 91.239 |
| 10.1071 | 91.218 |
| 10.110899999999999 | 91.197 |
| 10.114799999999999 | 91.177 |
| 10.1186 | 91.156 |
| 10.1225 | 91.139 |
| 10.1264 | 91.121 |
| 10.1302 | 91.105 |
| 10.1341 | 91.089 |
| 10.138 | 91.073 |
| 10.1418 | 91.058 |
| 10.145700000000001 | 91.043 |
| 10.1495 | 91.027 |
| 10.1534 | 91.011 |
| 10.1573 | 90.995 |
| 10.161100000000001 | 90.977 |
| 10.165 | 90.959 |
| 10.1688 | 90.939 |
| 10.1727 | 90.916 |
| 10.1766 | 90.893 |
| 10.180399999999999 | 90.868 |
| 10.184299999999999 | 90.843 |
| 10.1881 | 90.817 |
| 10.192 | 90.793 |
| 10.1959 | 90.77 |
| 10.1997 | 90.75 |
| 10.2036 | 90.732 |
| 10.2074 | 90.715 |
| 10.2113 | 90.7 |
| 10.215200000000001 | 90.686 |
| 10.219 | 90.671 |
| 10.2229 | 90.654 |
| 10.226700000000001 | 90.637 |
| 10.2306 | 90.618 |
| 10.2345 | 90.598 |
| 10.238299999999999 | 90.577 |
| 10.2422 | 90.556 |
| 10.246 | 90.535 |
| 10.2499 | 90.514 |
| 10.2538 | 90.494 |
| 10.2576 | 90.474 |
| 10.2615 | 90.454 |
| 10.2654 | 90.434 |
| 10.269200000000001 | 90.414 |
| 10.273100000000001 | 90.393 |
| 10.2769 | 90.373 |
| 10.2808 | 90.351 |
| 10.2847 | 90.327 |
| 10.2885 | 90.304 |
| 10.292399999999999 | 90.277 |
| 10.2962 | 90.249 |
| 10.3001 | 90.222 |
| 10.304 | 90.194 |
| 10.307799999999999 | 90.167 |
| 10.3117 | 90.143 |
| 10.3155 | 90.121 |
| 10.3194 | 90.099 |
| 10.3233 | 90.085 |
| 10.3271 | 90.07 |
| 10.331 | 90.056 |
| 10.3348 | 90.044 |
| 10.338700000000001 | 90.031 |
| 10.342600000000001 | 90.015 |
| 10.3464 | 89.997 |
| 10.350299999999999 | 89.98 |
| 10.3541 | 89.957 |
| 10.358 | 89.934 |
| 10.3619 | 89.91 |
| 10.3657 | 89.885 |
| 10.3696 | 89.861 |
| 10.3734 | 89.838 |
| 10.3773 | 89.815 |
| 10.381200000000002 | 89.793 |
| 10.385 | 89.773 |
| 10.3889 | 89.754 |
| 10.3928 | 89.735 |
| 10.396600000000001 | 89.716 |
| 10.4005 | 89.697 |
| 10.4043 | 89.676 |
| 10.4082 | 89.654 |
| 10.4121 | 89.631 |
| 10.415899999999999 | 89.606 |
| 10.419799999999999 | 89.58 |
| 10.4236 | 89.555 |
| 10.4275 | 89.53 |
| 10.4314 | 89.506 |
| 10.4352 | 89.482 |
| 10.4391 | 89.46 |
| 10.4429 | 89.437 |
| 10.4468 | 89.415 |
| 10.450700000000001 | 89.392 |
| 10.4545 | 89.37 |
| 10.4584 | 89.345 |
| 10.462200000000001 | 89.32 |
| 10.4661 | 89.295 |
| 10.47 | 89.268 |
| 10.473799999999999 | 89.241 |
| 10.4777 | 89.216 |
| 10.4815 | 89.19 |
| 10.4854 | 89.165 |
| 10.4893 | 89.142 |
| 10.4931 | 89.119 |
| 10.497 | 89.097 |
| 10.5008 | 89.075 |
| 10.504700000000001 | 89.053 |
| 10.5086 | 89.03 |
| 10.5124 | 89.008 |
| 10.5163 | 88.985 |
| 10.5202 | 88.963 |
| 10.524 | 88.941 |
| 10.527899999999999 | 88.92 |
| 10.5317 | 88.899 |
| 10.5356 | 88.879 |
| 10.5395 | 88.858 |
| 10.543299999999999 | 88.836 |
| 10.5472 | 88.814 |
| 10.551 | 88.792 |
| 10.5549 | 88.77 |
| 10.5588 | 88.747 |
| 10.5626 | 88.725 |
| 10.5665 | 88.705 |
| 10.5703 | 88.684 |
| 10.574200000000001 | 88.665 |
| 10.578100000000001 | 88.646 |
| 10.5819 | 88.627 |
| 10.585799999999999 | 88.605 |
| 10.5896 | 88.582 |
| 10.5935 | 88.56 |
| 10.5974 | 88.532 |
| 10.6012 | 88.504 |
| 10.6051 | 88.475 |
| 10.6089 | 88.444 |
| 10.6128 | 88.414 |
| 10.616700000000002 | 88.383 |
| 10.6205 | 88.352 |
| 10.6244 | 88.322 |
| 10.628200000000001 | 88.292 |
| 10.632100000000001 | 88.263 |
| 10.636 | 88.234 |
| 10.6398 | 88.207 |
| 10.6437 | 88.18 |
| 10.6476 | 88.152 |
| 10.651399999999999 | 88.126 |
| 10.655299999999999 | 88.099 |
| 10.6591 | 88.072 |
| 10.663 | 88.043 |
| 10.6669 | 88.014 |
| 10.6707 | 87.985 |
| 10.6746 | 87.954 |
| 10.6784 | 87.924 |
| 10.6823 | 87.894 |
| 10.686200000000001 | 87.864 |
| 10.69 | 87.836 |
| 10.6939 | 87.807 |
| 10.697700000000001 | 87.779 |
| 10.701600000000001 | 87.751 |
| 10.7055 | 87.722 |
| 10.709299999999999 | 87.692 |
| 10.7132 | 87.662 |
| 10.717 | 87.629 |
| 10.7209 | 87.596 |
| 10.7248 | 87.563 |
| 10.7286 | 87.529 |
| 10.7325 | 87.496 |
| 10.7363 | 87.463 |
| 10.740200000000002 | 87.43 |
| 10.7441 | 87.398 |
| 10.7479 | 87.365 |
| 10.7518 | 87.333 |
| 10.755600000000001 | 87.301 |
| 10.7595 | 87.269 |
| 10.763399999999999 | 87.237 |
| 10.7672 | 87.205 |
| 10.7711 | 87.174 |
| 10.775 | 87.145 |
| 10.778799999999999 | 87.115 |
| 10.7827 | 87.088 |
| 10.7865 | 87.064 |
| 10.7904 | 87.039 |
| 10.7943 | 87.019 |
| 10.7981 | 87.002 |
| 10.802 | 86.985 |
| 10.8058 | 86.973 |
| 10.809700000000001 | 86.964 |
| 10.813600000000001 | 86.954 |
| 10.8174 | 86.947 |
| 10.821299999999999 | 86.941 |
| 10.8251 | 86.934 |
| 10.829 | 86.924 |
| 10.8329 | 86.913 |
| 10.8367 | 86.903 |
| 10.8406 | 86.886 |
| 10.8444 | 86.869 |
| 10.8483 | 86.852 |
| 10.8522 | 86.835 |
| 10.856 | 86.818 |
| 10.8599 | 86.801 |
| 10.863700000000001 | 86.789 |
| 10.8676 | 86.778 |
| 10.8715 | 86.768 |
| 10.8753 | 86.76 |
| 10.8792 | 86.753 |
| 10.883 | 86.746 |
| 10.886899999999999 | 86.738 |
| 10.890799999999999 | 86.73 |
| 10.8946 | 86.721 |
| 10.8985 | 86.71 |
| 10.9024 | 86.699 |
| 10.9062 | 86.687 |
| 10.9101 | 86.673 |
| 10.9139 | 86.659 |
| 10.9178 | 86.643 |
| 10.921700000000001 | 86.623 |
| 10.9255 | 86.602 |
| 10.9294 | 86.58 |
| 10.933200000000001 | 86.554 |
| 10.937100000000001 | 86.528 |
| 10.941 | 86.503 |
| 10.944799999999999 | 86.478 |
| 10.9487 | 86.454 |
| 10.9525 | 86.432 |
| 10.9564 | 86.414 |
| 10.9603 | 86.396 |
| 10.9641 | 86.378 |
| 10.968 | 86.363 |
| 10.9718 | 86.348 |
| 10.975700000000002 | 86.332 |
| 10.9796 | 86.316 |
| 10.9834 | 86.3 |
| 10.9873 | 86.284 |
| 10.991100000000001 | 86.268 |
| 10.995 | 86.251 |
| 10.998899999999999 | 86.235 |
| 11.0027 | 86.218 |
| 11.0066 | 86.202 |
| 11.010399999999999 | 86.185 |
| 11.014299999999999 | 86.168 |
| 11.0182 | 86.152 |
| 11.022 | 86.135 |
| 11.0259 | 86.117 |
| 11.0298 | 86.098 |
| 11.0336 | 86.08 |
| 11.0375 | 86.06 |
| 11.0413 | 86.041 |
| 11.045200000000001 | 86.021 |
| 11.049100000000001 | 85.999 |
| 11.0529 | 85.978 |
| 11.056799999999999 | 85.956 |
| 11.0606 | 85.932 |
| 11.0645 | 85.907 |
| 11.0684 | 85.883 |
| 11.0722 | 85.86 |
| 11.0761 | 85.836 |
| 11.0799 | 85.813 |
| 11.0838 | 85.794 |
| 11.0877 | 85.775 |
| 11.0915 | 85.756 |
| 11.0954 | 85.741 |
| 11.099200000000002 | 85.726 |
| 11.1031 | 85.71 |
| 11.107 | 85.696 |
| 11.1108 | 85.681 |
| 11.114700000000001 | 85.667 |
| 11.1185 | 85.652 |
| 11.122399999999999 | 85.638 |
| 11.126299999999999 | 85.623 |
| 11.1301 | 85.608 |
| 11.134 | 85.593 |
| 11.137799999999999 | 85.577 |
| 11.1417 | 85.561 |
| 11.1456 | 85.545 |
| 11.1494 | 85.529 |
| 11.1533 | 85.512 |
| 11.157200000000001 | 85.495 |
| 11.161 | 85.478 |
| 11.1649 | 85.461 |
| 11.168700000000001 | 85.443 |
| 11.172600000000001 | 85.425 |
| 11.1765 | 85.406 |
| 11.180299999999999 | 85.386 |
| 11.1842 | 85.366 |
| 11.188 | 85.346 |
| 11.1919 | 85.324 |
| 11.195799999999998 | 85.303 |
| 11.1996 | 85.282 |
| 11.2035 | 85.261 |
| 11.2073 | 85.241 |
| 11.211200000000002 | 85.221 |
| 11.2151 | 85.203 |
| 11.2189 | 85.186 |
| 11.2228 | 85.168 |
| 11.226600000000001 | 85.152 |
| 11.2305 | 85.137 |
| 11.234399999999999 | 85.122 |
| 11.2382 | 85.106 |
| 11.2421 | 85.088 |
| 11.245899999999999 | 85.071 |
| 11.249799999999999 | 85.052 |
| 11.2537 | 85.029 |
| 11.2575 | 85.007 |
| 11.2614 | 84.985 |
| 11.2652 | 84.963 |
| 11.2691 | 84.94 |
| 11.273 | 84.918 |
| 11.2768 | 84.899 |
| 11.280700000000001 | 84.88 |
| 11.284600000000001 | 84.862 |
| 11.2884 | 84.844 |
| 11.2923 | 84.826 |
| 11.296100000000001 | 84.808 |
| 11.3 | 84.789 |
| 11.3039 | 84.769 |
| 11.3077 | 84.749 |
| 11.3116 | 84.728 |
| 11.3154 | 84.707 |
| 11.3193 | 84.685 |
| 11.3232 | 84.664 |
| 11.327 | 84.644 |
| 11.3309 | 84.623 |
| 11.334700000000002 | 84.602 |
| 11.3386 | 84.581 |
| 11.3425 | 84.56 |
| 11.3463 | 84.539 |
| 11.350200000000001 | 84.516 |
| 11.354 | 84.492 |
| 11.357899999999999 | 84.468 |
| 11.361799999999999 | 84.442 |
| 11.3656 | 84.415 |
| 11.3695 | 84.388 |
| 11.373299999999999 | 84.363 |
| 11.3772 | 84.339 |
| 11.3811 | 84.316 |
| 11.3849 | 84.293 |
| 11.3888 | 84.275 |
| 11.3926 | 84.258 |
| 11.3965 | 84.24 |
| 11.4004 | 84.224 |
| 11.404200000000001 | 84.208 |
| 11.408100000000001 | 84.192 |
| 11.412 | 84.176 |
| 11.415799999999999 | 84.159 |
| 11.4197 | 84.142 |
| 11.4235 | 84.126 |
| 11.4274 | 84.111 |
| 11.431299999999998 | 84.096 |
| 11.4351 | 84.081 |
| 11.439 | 84.066 |
| 11.4428 | 84.051 |
| 11.4467 | 84.036 |
| 11.4506 | 84.018 |
| 11.4544 | 84 |
| 11.4583 | 83.982 |
| 11.4621 | 83.961 |
| 11.466 | 83.939 |
| 11.469899999999999 | 83.916 |
| 11.473700000000001 | 83.894 |
| 11.4776 | 83.869 |
| 11.481399999999999 | 83.845 |
| 11.485299999999999 | 83.821 |
| 11.4892 | 83.796 |
| 11.493 | 83.772 |
| 11.4969 | 83.747 |
| 11.5007 | 83.725 |
| 11.5046 | 83.704 |
| 11.5085 | 83.683 |
| 11.5123 | 83.664 |
| 11.516200000000001 | 83.647 |
| 11.52 | 83.63 |
| 11.5239 | 83.613 |
| 11.5278 | 83.595 |
| 11.531600000000001 | 83.578 |
| 11.5355 | 83.56 |
| 11.539399999999999 | 83.542 |
| 11.5432 | 83.524 |
| 11.5471 | 83.506 |
| 11.5509 | 83.49 |
| 11.554799999999998 | 83.475 |
| 11.5587 | 83.46 |
| 11.5625 | 83.446 |
| 11.5664 | 83.431 |
| 11.570200000000002 | 83.417 |
| 11.5741 | 83.402 |
| 11.578 | 83.385 |
| 11.5818 | 83.366 |
| 11.585700000000001 | 83.348 |
| 11.5895 | 83.33 |
| 11.593399999999999 | 83.31 |
| 11.597299999999999 | 83.291 |
| 11.6011 | 83.272 |
| 11.605 | 83.254 |
| 11.608799999999999 | 83.236 |
| 11.6127 | 83.219 |
| 11.6166 | 83.201 |
| 11.6204 | 83.184 |
| 11.6243 | 83.166 |
| 11.6281 | 83.149 |
| 11.632 | 83.132 |
| 11.6359 | 83.116 |
| 11.639700000000001 | 83.1 |
| 11.643600000000001 | 83.087 |
| 11.6474 | 83.074 |
| 11.651299999999999 | 83.061 |
| 11.6552 | 83.049 |
| 11.659 | 83.038 |
| 11.6629 | 83.027 |
| 11.666799999999999 | 83.014 |
| 11.6706 | 82.998 |
| 11.6745 | 82.982 |
| 11.6783 | 82.967 |
| 11.6822 | 82.944 |
| 11.6861 | 82.919 |
| 11.6899 | 82.895 |
| 11.6938 | 82.87 |
| 11.6976 | 82.842 |
| 11.7015 | 82.814 |
| 11.7054 | 82.787 |
| 11.709200000000001 | 82.764 |
| 11.7131 | 82.741 |
| 11.716899999999999 | 82.718 |
| 11.720799999999999 | 82.698 |
| 11.7247 | 82.68 |
| 11.7285 | 82.662 |
| 11.7324 | 82.645 |
| 11.7362 | 82.629 |
| 11.7401 | 82.613 |
| 11.744 | 82.597 |
| 11.7478 | 82.581 |
| 11.751700000000001 | 82.566 |
| 11.7555 | 82.55 |
| 11.7594 | 82.534 |
| 11.7633 | 82.516 |
| 11.767100000000001 | 82.498 |
| 11.771 | 82.48 |
| 11.774799999999999 | 82.46 |
| 11.7787 | 82.438 |
| 11.7826 | 82.417 |
| 11.7864 | 82.395 |
| 11.790299999999998 | 82.373 |
| 11.7942 | 82.351 |
| 11.798 | 82.328 |
| 11.8019 | 82.309 |
| 11.8057 | 82.29 |
| 11.8096 | 82.271 |
| 11.8135 | 82.253 |
| 11.8173 | 82.237 |
| 11.821200000000001 | 82.221 |
| 11.825 | 82.205 |
| 11.828899999999999 | 82.19 |
| 11.832799999999999 | 82.175 |
| 11.8366 | 82.16 |
| 11.8405 | 82.143 |
| 11.844299999999999 | 82.126 |
| 11.8482 | 82.109 |
| 11.8521 | 82.091 |
| 11.8559 | 82.072 |
| 11.8598 | 82.052 |
| 11.8636 | 82.032 |
| 11.8675 | 82.012 |
| 11.8714 | 81.993 |
| 11.875200000000001 | 81.974 |
| 11.879100000000001 | 81.956 |
| 11.8829 | 81.941 |
| 11.8868 | 81.926 |
| 11.8907 | 81.912 |
| 11.8945 | 81.898 |
| 11.898399999999999 | 81.886 |
| 11.9022 | 81.875 |
| 11.9061 | 81.863 |
| 11.91 | 81.851 |
| 11.913799999999998 | 81.84 |
| 11.9177 | 81.828 |
| 11.9216 | 81.816 |
| 11.9254 | 81.802 |
| 11.9293 | 81.787 |
| 11.9331 | 81.772 |
| 11.937 | 81.754 |
| 11.9409 | 81.733 |
| 11.944700000000001 | 81.713 |
| 11.9486 | 81.692 |
| 11.952399999999999 | 81.67 |
| 11.956299999999999 | 81.649 |
| 11.9602 | 81.628 |
| 11.964 | 81.609 |
| 11.9679 | 81.593 |
| 11.9717 | 81.577 |
| 11.9756 | 81.56 |
| 11.9795 | 81.548 |
| 11.9833 | 81.535 |
| 11.987200000000001 | 81.523 |
| 11.991 | 81.509 |
| 11.9949 | 81.494 |
| 11.9988 | 81.479 |
| 12.002600000000001 | 81.464 |
| 12.0065 | 81.446 |
| 12.010299999999999 | 81.426 |
| 12.0142 | 81.407 |
| 12.0181 | 81.387 |
| 12.0219 | 81.365 |
| 12.025799999999998 | 81.343 |
| 12.0296 | 81.321 |
| 12.0335 | 81.299 |
| 12.0374 | 81.277 |
| 12.0412 | 81.254 |
| 12.0451 | 81.232 |
| 12.049 | 81.212 |
| 12.0528 | 81.191 |
| 12.056700000000001 | 81.171 |
| 12.0605 | 81.152 |
| 12.0644 | 81.136 |
| 12.068299999999999 | 81.12 |
| 12.0721 | 81.104 |
| 12.076 | 81.091 |
| 12.079799999999999 | 81.079 |
| 12.0837 | 81.067 |
| 12.0876 | 81.055 |
| 12.0914 | 81.043 |
| 12.0953 | 81.031 |
| 12.0991 | 81.02 |
| 12.103 | 81.007 |
| 12.1069 | 80.994 |
| 12.110700000000001 | 80.981 |
| 12.114600000000001 | 80.968 |
| 12.1184 | 80.955 |
| 12.1223 | 80.942 |
| 12.1262 | 80.93 |
| 12.13 | 80.917 |
| 12.133899999999999 | 80.906 |
| 12.1377 | 80.894 |
| 12.1416 | 80.883 |
| 12.1455 | 80.87 |
| 12.149299999999998 | 80.856 |
| 12.1532 | 80.843 |
| 12.157 | 80.829 |
| 12.1609 | 80.811 |
| 12.1648 | 80.792 |
| 12.1686 | 80.774 |
| 12.1725 | 80.755 |
| 12.1764 | 80.733 |
| 12.180200000000001 | 80.712 |
| 12.1841 | 80.69 |
| 12.187899999999999 | 80.669 |
| 12.191799999999999 | 80.649 |
| 12.1957 | 80.629 |
| 12.1995 | 80.608 |
| 12.2034 | 80.59 |
| 12.2072 | 80.572 |
| 12.2111 | 80.555 |
| 12.215 | 80.537 |
| 12.2188 | 80.522 |
| 12.222700000000001 | 80.508 |
| 12.2265 | 80.494 |
| 12.2304 | 80.479 |
| 12.2343 | 80.467 |
| 12.238100000000001 | 80.455 |
| 12.242 | 80.442 |
| 12.2458 | 80.43 |
| 12.2497 | 80.417 |
| 12.2536 | 80.404 |
| 12.2574 | 80.391 |
| 12.261299999999999 | 80.377 |
| 12.2651 | 80.363 |
| 12.269 | 80.348 |
| 12.2729 | 80.333 |
| 12.2767 | 80.318 |
| 12.2806 | 80.302 |
| 12.2844 | 80.287 |
| 12.2883 | 80.272 |
| 12.292200000000001 | 80.256 |
| 12.296 | 80.24 |
| 12.2999 | 80.225 |
| 12.303799999999999 | 80.211 |
| 12.3076 | 80.198 |
| 12.3115 | 80.186 |
| 12.315299999999999 | 80.173 |
| 12.3192 | 80.164 |
| 12.3231 | 80.157 |
| 12.3269 | 80.15 |
| 12.3308 | 80.143 |
| 12.3346 | 80.136 |
| 12.3385 | 80.129 |
| 12.3424 | 80.122 |
| 12.346200000000001 | 80.115 |
| 12.350100000000001 | 80.101 |
| 12.3539 | 80.086 |
| 12.3578 | 80.072 |
| 12.3617 | 80.057 |
| 12.3655 | 80.037 |
| 12.369399999999999 | 80.018 |
| 12.3732 | 79.998 |
| 12.3771 | 79.98 |
| 12.381 | 79.963 |
| 12.384799999999998 | 79.947 |
| 12.3887 | 79.93 |
| 12.3925 | 79.916 |
| 12.3964 | 79.905 |
| 12.4003 | 79.894 |
| 12.4041 | 79.883 |
| 12.408 | 79.872 |
| 12.4118 | 79.862 |
| 12.415700000000001 | 79.852 |
| 12.4196 | 79.842 |
| 12.423399999999999 | 79.829 |
| 12.427299999999999 | 79.816 |
| 12.4312 | 79.803 |
| 12.435 | 79.79 |
| 12.4389 | 79.776 |
| 12.4427 | 79.761 |
| 12.4466 | 79.747 |
| 12.4505 | 79.732 |
| 12.4543 | 79.718 |
| 12.458200000000001 | 79.704 |
| 12.462 | 79.69 |
| 12.4659 | 79.676 |
| 12.4698 | 79.661 |
| 12.473600000000001 | 79.645 |
| 12.4775 | 79.63 |
| 12.4813 | 79.613 |
| 12.4852 | 79.594 |
| 12.4891 | 79.576 |
| 12.492899999999999 | 79.557 |
| 12.496799999999999 | 79.538 |
| 12.5006 | 79.52 |
| 12.5045 | 79.502 |
| 12.5084 | 79.484 |
| 12.5122 | 79.467 |
| 12.5161 | 79.451 |
| 12.5199 | 79.436 |
| 12.5238 | 79.42 |
| 12.527700000000001 | 79.405 |
| 12.5315 | 79.391 |
| 12.5354 | 79.377 |
| 12.539200000000001 | 79.363 |
| 12.5431 | 79.35 |
| 12.547 | 79.338 |
| 12.550799999999999 | 79.326 |
| 12.5547 | 79.313 |
| 12.5586 | 79.302 |
| 12.5624 | 79.292 |
| 12.5663 | 79.281 |
| 12.5701 | 79.27 |
| 12.574 | 79.258 |
| 12.5779 | 79.247 |
| 12.581700000000001 | 79.235 |
| 12.585600000000001 | 79.223 |
| 12.5894 | 79.21 |
| 12.5933 | 79.197 |
| 12.5972 | 79.184 |
| 12.601 | 79.171 |
| 12.604899999999999 | 79.157 |
| 12.6087 | 79.143 |
| 12.6126 | 79.129 |
| 12.6165 | 79.115 |
| 12.620299999999999 | 79.1 |
| 12.6242 | 79.085 |
| 12.628 | 79.07 |
| 12.6319 | 79.055 |
| 12.6358 | 79.038 |
| 12.6396 | 79.022 |
| 12.6435 | 79.005 |
| 12.6473 | 78.989 |
| 12.651200000000001 | 78.972 |
| 12.655100000000001 | 78.956 |
| 12.6589 | 78.939 |
| 12.662799999999999 | 78.923 |
| 12.6666 | 78.907 |
| 12.6705 | 78.891 |
| 12.6744 | 78.875 |
| 12.6782 | 78.86 |
| 12.6821 | 78.843 |
| 12.686 | 78.826 |
| 12.6898 | 78.81 |
| 12.693700000000002 | 78.793 |
| 12.6975 | 78.774 |
| 12.7014 | 78.754 |
| 12.7053 | 78.735 |
| 12.709100000000001 | 78.716 |
| 12.713 | 78.697 |
| 12.7168 | 78.678 |
| 12.7207 | 78.659 |
| 12.7246 | 78.64 |
| 12.728399999999999 | 78.624 |
| 12.732299999999999 | 78.608 |
| 12.7361 | 78.593 |
| 12.74 | 78.578 |
| 12.7439 | 78.564 |
| 12.7477 | 78.551 |
| 12.7516 | 78.538 |
| 12.7554 | 78.525 |
| 12.7593 | 78.512 |
| 12.763200000000001 | 78.5 |
| 12.767 | 78.488 |
| 12.7709 | 78.475 |
| 12.774700000000001 | 78.463 |
| 12.7786 | 78.451 |
| 12.7825 | 78.439 |
| 12.786299999999999 | 78.427 |
| 12.7902 | 78.414 |
| 12.794 | 78.401 |
| 12.7979 | 78.388 |
| 12.8018 | 78.374 |
| 12.8056 | 78.36 |
| 12.8095 | 78.344 |
| 12.8134 | 78.328 |
| 12.817200000000001 | 78.312 |
| 12.8211 | 78.297 |
| 12.8249 | 78.281 |
| 12.8288 | 78.265 |
| 12.8327 | 78.249 |
| 12.8365 | 78.234 |
| 12.840399999999999 | 78.22 |
| 12.8442 | 78.205 |
| 12.8481 | 78.191 |
| 12.852 | 78.176 |
| 12.855799999999999 | 78.16 |
| 12.8597 | 78.144 |
| 12.8635 | 78.128 |
| 12.8674 | 78.112 |
| 12.8713 | 78.093 |
| 12.8751 | 78.074 |
| 12.879 | 78.056 |
| 12.8828 | 78.037 |
| 12.886700000000001 | 78.019 |
| 12.890600000000001 | 78.002 |
| 12.8944 | 77.985 |
| 12.898299999999999 | 77.967 |
| 12.9021 | 77.954 |
| 12.906 | 77.942 |
| 12.9099 | 77.93 |
| 12.9137 | 77.918 |
| 12.9176 | 77.908 |
| 12.9214 | 77.899 |
| 12.9253 | 77.89 |
| 12.929200000000002 | 77.881 |
| 12.933 | 77.871 |
| 12.9369 | 77.861 |
| 12.9408 | 77.85 |
| 12.944600000000001 | 77.84 |
| 12.9485 | 77.829 |
| 12.9523 | 77.815 |
| 12.9562 | 77.801 |
| 12.9601 | 77.787 |
| 12.963899999999999 | 77.772 |
| 12.967799999999999 | 77.755 |
| 12.9716 | 77.738 |
| 12.9755 | 77.721 |
| 12.9794 | 77.704 |
| 12.9832 | 77.685 |
| 12.9871 | 77.666 |
| 12.9909 | 77.647 |
| 12.9948 | 77.628 |
| 12.998700000000001 | 77.609 |
| 13.0025 | 77.59 |
| 13.0064 | 77.57 |
| 13.010200000000001 | 77.551 |
| 13.014100000000001 | 77.533 |
| 13.018 | 77.516 |
| 13.021799999999999 | 77.499 |
| 13.0257 | 77.482 |
| 13.0295 | 77.466 |
| 13.0334 | 77.451 |
| 13.0373 | 77.436 |
| 13.0411 | 77.422 |
| 13.045 | 77.407 |
| 13.0488 | 77.393 |
| 13.052700000000002 | 77.379 |
| 13.0566 | 77.364 |
| 13.0604 | 77.35 |
| 13.0643 | 77.334 |
| 13.068200000000001 | 77.318 |
| 13.072 | 77.302 |
| 13.075899999999999 | 77.286 |
| 13.0797 | 77.268 |
| 13.0836 | 77.25 |
| 13.0875 | 77.232 |
| 13.091299999999999 | 77.214 |
| 13.0952 | 77.196 |
| 13.099 | 77.18 |
| 13.1029 | 77.164 |
| 13.1068 | 77.148 |
| 13.1106 | 77.131 |
| 13.1145 | 77.119 |
| 13.1183 | 77.106 |
| 13.122200000000001 | 77.094 |
| 13.126100000000001 | 77.082 |
| 13.1299 | 77.071 |
| 13.133799999999999 | 77.061 |
| 13.1376 | 77.051 |
| 13.1415 | 77.04 |
| 13.1454 | 77.03 |
| 13.1492 | 77.019 |
| 13.1531 | 77.008 |
| 13.1569 | 76.996 |
| 13.1608 | 76.985 |
| 13.1647 | 76.973 |
| 13.1685 | 76.96 |
| 13.1724 | 76.947 |
| 13.176200000000001 | 76.935 |
| 13.1801 | 76.92 |
| 13.184 | 76.904 |
| 13.1878 | 76.888 |
| 13.1917 | 76.872 |
| 13.1956 | 76.856 |
| 13.199399999999999 | 76.838 |
| 13.203299999999999 | 76.82 |
| 13.2071 | 76.801 |
| 13.211 | 76.783 |
| 13.2149 | 76.767 |
| 13.2187 | 76.75 |
| 13.2226 | 76.734 |
| 13.2264 | 76.718 |
| 13.2303 | 76.703 |
| 13.234200000000001 | 76.689 |
| 13.238 | 76.675 |
| 13.2419 | 76.661 |
| 13.245700000000001 | 76.646 |
| 13.249600000000001 | 76.629 |
| 13.2535 | 76.613 |
| 13.257299999999999 | 76.596 |
| 13.2612 | 76.58 |
| 13.265 | 76.561 |
| 13.2689 | 76.541 |
| 13.2728 | 76.522 |
| 13.2766 | 76.502 |
| 13.2805 | 76.483 |
| 13.2843 | 76.464 |
| 13.288200000000002 | 76.445 |
| 13.2921 | 76.426 |
| 13.2959 | 76.408 |
| 13.2998 | 76.39 |
| 13.303600000000001 | 76.373 |
| 13.3075 | 76.355 |
| 13.311399999999999 | 76.338 |
| 13.3152 | 76.32 |
| 13.3191 | 76.303 |
| 13.323 | 76.285 |
| 13.326799999999999 | 76.267 |
| 13.3307 | 76.249 |
| 13.3345 | 76.229 |
| 13.3384 | 76.209 |
| 13.3423 | 76.189 |
| 13.3461 | 76.169 |
| 13.35 | 76.148 |
| 13.3538 | 76.126 |
| 13.357700000000001 | 76.104 |
| 13.361600000000001 | 76.082 |
| 13.3654 | 76.06 |
| 13.369299999999999 | 76.039 |
| 13.3731 | 76.017 |
| 13.377 | 75.996 |
| 13.3809 | 75.975 |
| 13.3847 | 75.956 |
| 13.3886 | 75.937 |
| 13.3924 | 75.919 |
| 13.3963 | 75.901 |
| 13.4002 | 75.883 |
| 13.404 | 75.865 |
| 13.4079 | 75.848 |
| 13.411700000000002 | 75.83 |
| 13.4156 | 75.813 |
| 13.4195 | 75.794 |
| 13.4233 | 75.774 |
| 13.427200000000001 | 75.755 |
| 13.431 | 75.735 |
| 13.434899999999999 | 75.716 |
| 13.438799999999999 | 75.694 |
| 13.4426 | 75.673 |
| 13.4465 | 75.652 |
| 13.4504 | 75.631 |
| 13.4542 | 75.61 |
| 13.4581 | 75.588 |
| 13.4619 | 75.567 |
| 13.4658 | 75.546 |
| 13.469700000000001 | 75.525 |
| 13.4735 | 75.505 |
| 13.4774 | 75.485 |
| 13.481200000000001 | 75.466 |
| 13.485100000000001 | 75.446 |
| 13.489 | 75.429 |
| 13.492799999999999 | 75.413 |
| 13.4967 | 75.397 |
| 13.5005 | 75.381 |
| 13.5044 | 75.365 |
| 13.508299999999998 | 75.352 |
| 13.5121 | 75.338 |
| 13.516 | 75.324 |
| 13.5198 | 75.311 |
| 13.523700000000002 | 75.297 |
| 13.5276 | 75.283 |
| 13.5314 | 75.269 |
| 13.5353 | 75.256 |
| 13.539100000000001 | 75.242 |
| 13.543 | 75.227 |
| 13.546899999999999 | 75.213 |
| 13.5507 | 75.198 |
| 13.5546 | 75.184 |
| 13.558399999999999 | 75.169 |
| 13.562299999999999 | 75.155 |
| 13.5662 | 75.141 |
| 13.57 | 75.126 |
| 13.5739 | 75.112 |
| 13.5778 | 75.098 |
| 13.5816 | 75.083 |
| 13.5855 | 75.068 |
| 13.5893 | 75.054 |
| 13.593200000000001 | 75.039 |
| 13.597100000000001 | 75.022 |
| 13.6009 | 75.005 |
| 13.6048 | 74.988 |
| 13.608600000000001 | 74.971 |
| 13.6125 | 74.954 |
| 13.6164 | 74.936 |
| 13.6202 | 74.918 |
| 13.6241 | 74.9 |
| 13.6279 | 74.882 |
| 13.6318 | 74.864 |
| 13.6357 | 74.847 |
| 13.6395 | 74.829 |
| 13.6434 | 74.811 |
| 13.647200000000002 | 74.793 |
| 13.6511 | 74.773 |
| 13.655 | 74.754 |
| 13.6588 | 74.734 |
| 13.662700000000001 | 74.715 |
| 13.6665 | 74.694 |
| 13.670399999999999 | 74.674 |
| 13.674299999999999 | 74.653 |
| 13.6781 | 74.632 |
| 13.682 | 74.612 |
| 13.685799999999999 | 74.592 |
| 13.6897 | 74.574 |
| 13.6936 | 74.554 |
| 13.6974 | 74.536 |
| 13.7013 | 74.517 |
| 13.705200000000001 | 74.499 |
| 13.709 | 74.482 |
| 13.7129 | 74.465 |
| 13.716700000000001 | 74.447 |
| 13.720600000000001 | 74.43 |
| 13.7245 | 74.413 |
| 13.728299999999999 | 74.396 |
| 13.7322 | 74.379 |
| 13.736 | 74.362 |
| 13.7399 | 74.346 |
| 13.743799999999998 | 74.33 |
| 13.7476 | 74.313 |
| 13.7515 | 74.297 |
| 13.7553 | 74.28 |
| 13.7592 | 74.263 |
| 13.7631 | 74.246 |
| 13.7669 | 74.229 |
| 13.7708 | 74.212 |
| 13.7746 | 74.194 |
| 13.7785 | 74.176 |
| 13.782399999999999 | 74.157 |
| 13.786200000000001 | 74.138 |
| 13.7901 | 74.12 |
| 13.793899999999999 | 74.102 |
| 13.797799999999999 | 74.084 |
| 13.8017 | 74.067 |
| 13.8055 | 74.049 |
| 13.8094 | 74.032 |
| 13.8132 | 74.016 |
| 13.8171 | 74 |
| 13.821 | 73.984 |
| 13.8248 | 73.968 |
| 13.828700000000001 | 73.951 |
| 13.832600000000001 | 73.934 |
| 13.8364 | 73.916 |
| 13.8403 | 73.899 |
| 13.844100000000001 | 73.881 |
| 13.848 | 73.862 |
| 13.851899999999999 | 73.84 |
| 13.8557 | 73.818 |
| 13.8596 | 73.796 |
| 13.8634 | 73.774 |
| 13.867299999999998 | 73.75 |
| 13.8712 | 73.726 |
| 13.875 | 73.701 |
| 13.8789 | 73.677 |
| 13.882700000000002 | 73.653 |
| 13.8866 | 73.63 |
| 13.8905 | 73.608 |
| 13.8943 | 73.586 |
| 13.898200000000001 | 73.564 |
| 13.902 | 73.542 |
| 13.905899999999999 | 73.525 |
| 13.909799999999999 | 73.507 |
| 13.9136 | 73.49 |
| 13.9175 | 73.473 |
| 13.921299999999999 | 73.457 |
| 13.9252 | 73.443 |
| 13.9291 | 73.43 |
| 13.9329 | 73.416 |
| 13.9368 | 73.403 |
| 13.9406 | 73.389 |
| 13.9445 | 73.376 |
| 13.9484 | 73.362 |
| 13.952200000000001 | 73.349 |
| 13.956100000000001 | 73.335 |
| 13.96 | 73.32 |
| 13.963799999999999 | 73.303 |
| 13.9677 | 73.286 |
| 13.9715 | 73.269 |
| 13.9754 | 73.252 |
| 13.979299999999999 | 73.234 |
| 13.9831 | 73.213 |
| 13.987 | 73.193 |
| 13.9908 | 73.173 |
| 13.9947 | 73.153 |
| 13.9986 | 73.132 |
| 14.0024 | 73.111 |
| 14.0063 | 73.09 |
| 14.0101 | 73.069 |
| 14.014 | 73.048 |
| 14.0179 | 73.027 |
| 14.021700000000001 | 73.006 |
| 14.0256 | 72.985 |
| 14.029399999999999 | 72.964 |
| 14.033299999999999 | 72.943 |
| 14.0372 | 72.922 |
| 14.041 | 72.901 |
| 14.0449 | 72.88 |
| 14.0487 | 72.86 |
| 14.0526 | 72.839 |
| 14.0565 | 72.82 |
| 14.0603 | 72.8 |
| 14.064200000000001 | 72.781 |
| 14.068 | 72.762 |
| 14.0719 | 72.742 |
| 14.0758 | 72.722 |
| 14.079600000000001 | 72.702 |
| 14.0835 | 72.682 |
| 14.087399999999999 | 72.662 |
| 14.0912 | 72.641 |
| 14.0951 | 72.617 |
| 14.0989 | 72.593 |
| 14.102799999999998 | 72.569 |
| 14.1067 | 72.545 |
| 14.1105 | 72.521 |
| 14.1144 | 72.497 |
| 14.1182 | 72.473 |
| 14.1221 | 72.449 |
| 14.126 | 72.425 |
| 14.1298 | 72.402 |
| 14.133700000000001 | 72.385 |
| 14.1375 | 72.367 |
| 14.141399999999999 | 72.35 |
| 14.145299999999999 | 72.332 |
| 14.1491 | 72.315 |
| 14.153 | 72.302 |
| 14.156799999999999 | 72.289 |
| 14.1607 | 72.276 |
| 14.1646 | 72.263 |
| 14.1684 | 72.25 |
| 14.1723 | 72.236 |
| 14.1761 | 72.222 |
| 14.18 | 72.208 |
| 14.1839 | 72.194 |
| 14.187700000000001 | 72.18 |
| 14.191600000000001 | 72.163 |
| 14.1954 | 72.145 |
| 14.1993 | 72.128 |
| 14.2032 | 72.111 |
| 14.207 | 72.093 |
| 14.210899999999999 | 72.071 |
| 14.214799999999999 | 72.049 |
| 14.2186 | 72.027 |
| 14.2225 | 72.006 |
| 14.226299999999998 | 71.984 |
| 14.2302 | 71.959 |
| 14.2341 | 71.934 |
| 14.2379 | 71.91 |
| 14.2418 | 71.885 |
| 14.2456 | 71.861 |
| 14.2495 | 71.838 |
| 14.2534 | 71.816 |
| 14.257200000000001 | 71.793 |
| 14.2611 | 71.771 |
| 14.264899999999999 | 71.748 |
| 14.268799999999999 | 71.73 |
| 14.2727 | 71.711 |
| 14.2765 | 71.693 |
| 14.2804 | 71.674 |
| 14.2842 | 71.656 |
| 14.2881 | 71.638 |
| 14.292 | 71.621 |
| 14.2958 | 71.603 |
| 14.299700000000001 | 71.586 |
| 14.3035 | 71.568 |
| 14.3074 | 71.55 |
| 14.3113 | 71.532 |
| 14.315100000000001 | 71.514 |
| 14.319 | 71.496 |
| 14.322799999999999 | 71.478 |
| 14.3267 | 71.46 |
| 14.3306 | 71.442 |
| 14.3344 | 71.425 |
| 14.338299999999998 | 71.407 |
| 14.3422 | 71.389 |
| 14.346 | 71.372 |
| 14.3499 | 71.355 |
| 14.3537 | 71.338 |
| 14.3576 | 71.321 |
| 14.3615 | 71.304 |
| 14.3653 | 71.288 |
| 14.369200000000001 | 71.273 |
| 14.373 | 71.258 |
| 14.3769 | 71.243 |
| 14.380799999999999 | 71.228 |
| 14.3846 | 71.214 |
| 14.3885 | 71.203 |
| 14.392299999999999 | 71.192 |
| 14.3962 | 71.182 |
| 14.4001 | 71.171 |
| 14.4039 | 71.16 |
| 14.4078 | 71.149 |
| 14.4116 | 71.138 |
| 14.4155 | 71.127 |
| 14.4194 | 71.117 |
| 14.423200000000001 | 71.106 |
| 14.427100000000001 | 71.09 |
| 14.4309 | 71.074 |
| 14.4348 | 71.057 |
| 14.4387 | 71.04 |
| 14.4425 | 71.023 |
| 14.446399999999999 | 71.002 |
| 14.4502 | 70.979 |
| 14.4541 | 70.955 |
| 14.458 | 70.931 |
| 14.461799999999998 | 70.908 |
| 14.4657 | 70.884 |
| 14.4696 | 70.858 |
| 14.4734 | 70.832 |
| 14.4773 | 70.807 |
| 14.4811 | 70.781 |
| 14.485 | 70.757 |
| 14.4889 | 70.737 |
| 14.492700000000001 | 70.717 |
| 14.4966 | 70.698 |
| 14.500399999999999 | 70.678 |
| 14.504299999999999 | 70.659 |
| 14.5082 | 70.646 |
| 14.512 | 70.633 |
| 14.5159 | 70.621 |
| 14.5197 | 70.609 |
| 14.5236 | 70.597 |
| 14.5275 | 70.583 |
| 14.5313 | 70.568 |
| 14.535200000000001 | 70.552 |
| 14.539 | 70.537 |
| 14.5429 | 70.522 |
| 14.5468 | 70.503 |
| 14.550600000000001 | 70.478 |
| 14.5545 | 70.453 |
| 14.5583 | 70.428 |
| 14.5622 | 70.403 |
| 14.5661 | 70.378 |
| 14.5699 | 70.35 |
| 14.573799999999999 | 70.322 |
| 14.5776 | 70.295 |
| 14.5815 | 70.267 |
| 14.5854 | 70.24 |
| 14.5892 | 70.216 |
| 14.5931 | 70.194 |
| 14.597 | 70.172 |
| 14.6008 | 70.149 |
| 14.604700000000001 | 70.127 |
| 14.6085 | 70.107 |
| 14.6124 | 70.09 |
| 14.616299999999999 | 70.072 |
| 14.6201 | 70.055 |
| 14.624 | 70.038 |
| 14.627799999999999 | 70.021 |
| 14.6317 | 70.006 |
| 14.6356 | 69.99 |
| 14.6394 | 69.975 |
| 14.6433 | 69.959 |
| 14.6471 | 69.944 |
| 14.651 | 69.925 |
| 14.6549 | 69.906 |
| 14.658700000000001 | 69.886 |
| 14.662600000000001 | 69.867 |
| 14.6664 | 69.847 |
| 14.6703 | 69.825 |
| 14.6742 | 69.8 |
| 14.678 | 69.774 |
| 14.681899999999999 | 69.748 |
| 14.6857 | 69.723 |
| 14.6896 | 69.697 |
| 14.6935 | 69.67 |
| 14.697299999999998 | 69.644 |
| 14.7012 | 69.617 |
| 14.705 | 69.59 |
| 14.7089 | 69.563 |
| 14.7128 | 69.536 |
| 14.7166 | 69.51 |
| 14.7205 | 69.483 |
| 14.7244 | 69.457 |
| 14.728200000000001 | 69.43 |
| 14.7321 | 69.404 |
| 14.735899999999999 | 69.376 |
| 14.739799999999999 | 69.348 |
| 14.7437 | 69.32 |
| 14.7475 | 69.292 |
| 14.7514 | 69.264 |
| 14.7552 | 69.237 |
| 14.7591 | 69.21 |
| 14.763 | 69.184 |
| 14.7668 | 69.157 |
| 14.770700000000001 | 69.131 |
| 14.7745 | 69.104 |
| 14.7784 | 69.076 |
| 14.7823 | 69.049 |
| 14.786100000000001 | 69.021 |
| 14.79 | 68.994 |
| 14.7938 | 68.966 |
| 14.7977 | 68.931 |
| 14.8016 | 68.894 |
| 14.805399999999999 | 68.857 |
| 14.809299999999999 | 68.82 |
| 14.8131 | 68.783 |
| 14.817 | 68.744 |
| 14.8209 | 68.701 |
| 14.8247 | 68.658 |
| 14.8286 | 68.616 |
| 14.8324 | 68.573 |
| 14.8363 | 68.53 |
| 14.840200000000001 | 68.497 |
| 14.844 | 68.464 |
| 14.8479 | 68.432 |
| 14.851799999999999 | 68.399 |
| 14.8556 | 68.366 |
| 14.8595 | 68.338 |
| 14.863299999999999 | 68.317 |
| 14.8672 | 68.296 |
| 14.8711 | 68.276 |
| 14.8749 | 68.255 |
| 14.8788 | 68.234 |
| 14.8826 | 68.212 |
| 14.8865 | 68.19 |
| 14.8904 | 68.168 |
| 14.894200000000001 | 68.145 |
| 14.898100000000001 | 68.123 |
| 14.9019 | 68.099 |
| 14.9058 | 68.07 |
| 14.9097 | 68.04 |
| 14.9135 | 68.011 |
| 14.917399999999999 | 67.981 |
| 14.9212 | 67.952 |
| 14.9251 | 67.919 |
| 14.929 | 67.884 |
| 14.932799999999999 | 67.85 |
| 14.9367 | 67.815 |
| 14.9405 | 67.781 |
| 14.9444 | 67.745 |
| 14.9483 | 67.705 |
| 14.9521 | 67.664 |
| 14.956 | 67.624 |
| 14.9598 | 67.583 |
| 14.963700000000001 | 67.543 |
| 14.967600000000001 | 67.503 |
| 14.9714 | 67.465 |
| 14.975299999999999 | 67.426 |
| 14.9792 | 67.387 |
| 14.983 | 67.349 |
| 14.9869 | 67.31 |
| 14.9907 | 67.279 |
| 14.9946 | 67.248 |
| 14.9985 | 67.217 |
| 15.0023 | 67.186 |
| 15.006200000000002 | 67.155 |
| 15.01 | 67.123 |
| 15.0139 | 67.09 |
| 15.0178 | 67.057 |
| 15.021600000000001 | 67.024 |
| 15.0255 | 66.99 |
| 15.0293 | 66.957 |
| 15.0332 | 66.918 |
| 15.0371 | 66.876 |
| 15.040899999999999 | 66.835 |
| 15.044799999999999 | 66.794 |
| 15.0486 | 66.753 |
| 15.0525 | 66.711 |
| 15.0564 | 66.662 |
| 15.0602 | 66.612 |
| 15.0641 | 66.563 |
| 15.0679 | 66.514 |
| 15.0718 | 66.465 |
| 15.075700000000001 | 66.415 |
| 15.0795 | 66.363 |
| 15.0834 | 66.31 |
| 15.087200000000001 | 66.258 |
| 15.0911 | 66.206 |
| 15.095 | 66.154 |
| 15.098799999999999 | 66.104 |
| 15.1027 | 66.053 |
| 15.1066 | 66.003 |
| 15.1104 | 65.953 |
| 15.1143 | 65.902 |
| 15.1181 | 65.852 |
| 15.122 | 65.804 |
| 15.1259 | 65.755 |
| 15.129700000000001 | 65.706 |
| 15.1336 | 65.658 |
| 15.1374 | 65.609 |
| 15.1413 | 65.56 |
| 15.1452 | 65.512 |
| 15.149 | 65.463 |
| 15.152899999999999 | 65.414 |
| 15.1567 | 65.365 |
| 15.1606 | 65.317 |
| 15.1645 | 65.267 |
| 15.168299999999999 | 65.218 |
| 15.1722 | 65.168 |
| 15.176 | 65.119 |
| 15.1799 | 65.07 |
| 15.1838 | 65.02 |
| 15.1876 | 64.971 |
| 15.1915 | 64.922 |
| 15.1953 | 64.873 |
| 15.199200000000001 | 64.823 |
| 15.203100000000001 | 64.774 |
| 15.2069 | 64.725 |
| 15.210799999999999 | 64.678 |
| 15.2146 | 64.631 |
| 15.2185 | 64.584 |
| 15.2224 | 64.537 |
| 15.2262 | 64.49 |
| 15.2301 | 64.444 |
| 15.234 | 64.401 |
| 15.2378 | 64.357 |
| 15.241700000000002 | 64.314 |
| 15.2455 | 64.27 |
| 15.2494 | 64.226 |
| 15.2533 | 64.184 |
| 15.257100000000001 | 64.144 |
| 15.261 | 64.103 |
| 15.2648 | 64.062 |
| 15.2687 | 64.022 |
| 15.2726 | 63.981 |
| 15.276399999999999 | 63.94 |
| 15.280299999999999 | 63.9 |
| 15.2841 | 63.859 |
| 15.288 | 63.818 |
| 15.2919 | 63.778 |
| 15.2957 | 63.737 |
| 15.2996 | 63.696 |
| 15.3034 | 63.654 |
| 15.3073 | 63.612 |
| 15.311200000000001 | 63.57 |
| 15.315 | 63.528 |
| 15.3189 | 63.487 |
| 15.322700000000001 | 63.445 |
| 15.326600000000001 | 63.403 |
| 15.3305 | 63.362 |
| 15.334299999999999 | 63.32 |
| 15.3382 | 63.279 |
| 15.342 | 63.237 |
| 15.3459 | 63.196 |
| 15.3498 | 63.156 |
| 15.3536 | 63.115 |
| 15.3575 | 63.074 |
| 15.3614 | 63.033 |
| 15.365200000000002 | 62.992 |
| 15.3691 | 62.949 |
| 15.3729 | 62.906 |
| 15.3768 | 62.863 |
| 15.380700000000001 | 62.82 |
| 15.3845 | 62.777 |
| 15.388399999999999 | 62.732 |
| 15.3922 | 62.685 |
| 15.3961 | 62.638 |
| 15.4 | 62.59 |
| 15.403799999999999 | 62.543 |
| 15.4077 | 62.496 |
| 15.4115 | 62.447 |
| 15.4154 | 62.397 |
| 15.4193 | 62.347 |
| 15.4231 | 62.297 |
| 15.427 | 62.247 |
| 15.4308 | 62.197 |
| 15.434700000000001 | 62.147 |
| 15.438600000000001 | 62.097 |
| 15.4424 | 62.046 |
| 15.446299999999999 | 61.996 |
| 15.4501 | 61.946 |
| 15.454 | 61.896 |
| 15.4579 | 61.845 |
| 15.4617 | 61.794 |
| 15.4656 | 61.742 |
| 15.4694 | 61.691 |
| 15.4733 | 61.64 |
| 15.4772 | 61.589 |
| 15.481 | 61.536 |
| 15.4849 | 61.483 |
| 15.4888 | 61.429 |
| 15.4926 | 61.376 |
| 15.4965 | 61.322 |
| 15.5003 | 61.268 |
| 15.5042 | 61.213 |
| 15.5081 | 61.156 |
| 15.511899999999999 | 61.099 |
| 15.515799999999999 | 61.042 |
| 15.5196 | 60.985 |
| 15.5235 | 60.928 |
| 15.5274 | 60.869 |
| 15.5312 | 60.808 |
| 15.5351 | 60.747 |
| 15.5389 | 60.686 |
| 15.5428 | 60.624 |
| 15.546700000000001 | 60.563 |
| 15.5505 | 60.501 |
| 15.5544 | 60.437 |
| 15.558200000000001 | 60.373 |
| 15.562100000000001 | 60.309 |
| 15.566 | 60.245 |
| 15.569799999999999 | 60.182 |
| 15.5737 | 60.118 |
| 15.5775 | 60.056 |
| 15.5814 | 59.993 |
| 15.5853 | 59.93 |
| 15.5891 | 59.868 |
| 15.593 | 59.805 |
| 15.5968 | 59.743 |
| 15.600700000000002 | 59.682 |
| 15.6046 | 59.62 |
| 15.6084 | 59.559 |
| 15.6123 | 59.498 |
| 15.616200000000001 | 59.436 |
| 15.62 | 59.375 |
| 15.623899999999999 | 59.314 |
| 15.6277 | 59.252 |
| 15.6316 | 59.19 |
| 15.6355 | 59.129 |
| 15.639299999999999 | 59.068 |
| 15.6432 | 59.007 |
| 15.647 | 58.948 |
| 15.6509 | 58.888 |
| 15.6548 | 58.829 |
| 15.6586 | 58.77 |
| 15.6625 | 58.711 |
| 15.6663 | 58.652 |
| 15.670200000000001 | 58.599 |
| 15.674100000000001 | 58.546 |
| 15.6779 | 58.492 |
| 15.681799999999999 | 58.439 |
| 15.6856 | 58.386 |
| 15.6895 | 58.333 |
| 15.6934 | 58.286 |
| 15.6972 | 58.238 |
| 15.7011 | 58.191 |
| 15.7049 | 58.144 |
| 15.7088 | 58.097 |
| 15.7127 | 58.05 |
| 15.7165 | 58.007 |
| 15.7204 | 57.965 |
| 15.724200000000002 | 57.923 |
| 15.7281 | 57.881 |
| 15.732 | 57.84 |
| 15.7358 | 57.798 |
| 15.739700000000001 | 57.759 |
| 15.7436 | 57.723 |
| 15.747399999999999 | 57.687 |
| 15.751299999999999 | 57.65 |
| 15.7551 | 57.614 |
| 15.759 | 57.578 |
| 15.7629 | 57.543 |
| 15.7667 | 57.51 |
| 15.7706 | 57.477 |
| 15.7744 | 57.444 |
| 15.7783 | 57.412 |
| 15.782200000000001 | 57.379 |
| 15.786 | 57.346 |
| 15.7899 | 57.31 |
| 15.793700000000001 | 57.276 |
| 15.797600000000001 | 57.241 |
| 15.8015 | 57.206 |
| 15.805299999999999 | 57.171 |
| 15.8092 | 57.136 |
| 15.813 | 57.093 |
| 15.8169 | 57.05 |
| 15.820799999999998 | 57.007 |
| 15.8246 | 56.964 |
| 15.8285 | 56.922 |
| 15.8323 | 56.879 |
| 15.836200000000002 | 56.829 |
| 15.8401 | 56.776 |
| 15.8439 | 56.724 |
| 15.8478 | 56.671 |
| 15.851600000000001 | 56.619 |
| 15.8555 | 56.567 |
| 15.859399999999999 | 56.512 |
| 15.8632 | 56.454 |
| 15.8671 | 56.396 |
| 15.871 | 56.338 |
| 15.874799999999999 | 56.28 |
| 15.8787 | 56.222 |
| 15.8825 | 56.163 |
| 15.8864 | 56.102 |
| 15.8903 | 56.041 |
| 15.8941 | 55.98 |
| 15.898 | 55.919 |
| 15.9018 | 55.858 |
| 15.905700000000001 | 55.797 |
| 15.909600000000001 | 55.733 |
| 15.9134 | 55.668 |
| 15.9173 | 55.602 |
| 15.921100000000001 | 55.537 |
| 15.925 | 55.472 |
| 15.9289 | 55.407 |
| 15.9327 | 55.339 |
| 15.9366 | 55.267 |
| 15.9404 | 55.196 |
| 15.9443 | 55.125 |
| 15.9482 | 55.054 |
| 15.952 | 54.982 |
| 15.9559 | 54.91 |
| 15.959700000000002 | 54.831 |
| 15.9636 | 54.752 |
| 15.9675 | 54.674 |
| 15.9713 | 54.595 |
| 15.975200000000001 | 54.516 |
| 15.979 | 54.438 |
| 15.982899999999999 | 54.356 |
| 15.986799999999999 | 54.273 |
| 15.9906 | 54.19 |
| 15.9945 | 54.107 |
| 15.9984 | 54.024 |
| 16.002200000000002 | 53.941 |
| 16.0061 | 53.86 |
| 16.0099 | 53.781 |
| 16.0138 | 53.703 |
| 16.0177 | 53.624 |
| 16.0215 | 53.546 |
| 16.0254 | 53.467 |
| 16.0292 | 53.389 |
| 16.0331 | 53.32 |
| 16.037 | 53.25 |
| 16.0408 | 53.181 |
| 16.044700000000002 | 53.112 |
| 16.0485 | 53.043 |
| 16.0524 | 52.974 |
| 16.0563 | 52.909 |
| 16.060100000000002 | 52.847 |
| 16.064 | 52.784 |
| 16.0678 | 52.722 |
| 16.0717 | 52.66 |
| 16.0756 | 52.598 |
| 16.0794 | 52.536 |
| 16.083299999999998 | 52.476 |
| 16.0871 | 52.415 |
| 16.091 | 52.355 |
| 16.0949 | 52.294 |
| 16.0987 | 52.234 |
| 16.1026 | 52.174 |
| 16.1064 | 52.115 |
| 16.1103 | 52.057 |
| 16.1142 | 51.999 |
| 16.118 | 51.941 |
| 16.1219 | 51.883 |
| 16.125799999999998 | 51.825 |
| 16.1296 | 51.769 |
| 16.1335 | 51.72 |
| 16.1373 | 51.67 |
| 16.1412 | 51.621 |
| 16.1451 | 51.571 |
| 16.1489 | 51.522 |
| 16.1528 | 51.473 |
| 16.1566 | 51.43 |
| 16.1605 | 51.391 |
| 16.1644 | 51.352 |
| 16.168200000000002 | 51.312 |
| 16.1721 | 51.273 |
| 16.1759 | 51.234 |
| 16.1798 | 51.196 |
| 16.1837 | 51.162 |
| 16.1875 | 51.129 |
| 16.191399999999998 | 51.095 |
| 16.1952 | 51.062 |
| 16.1991 | 51.028 |
| 16.203 | 50.995 |
| 16.206799999999998 | 50.964 |
| 16.2107 | 50.936 |
| 16.2145 | 50.907 |
| 16.2184 | 50.878 |
| 16.2223 | 50.849 |
| 16.2261 | 50.82 |
| 16.23 | 50.791 |
| 16.2338 | 50.769 |
| 16.2377 | 50.747 |
| 16.241600000000002 | 50.725 |
| 16.2454 | 50.702 |
| 16.249299999999998 | 50.68 |
| 16.2532 | 50.658 |
| 16.257 | 50.638 |
| 16.2609 | 50.622 |
| 16.2647 | 50.606 |
| 16.2686 | 50.59 |
| 16.2725 | 50.575 |
| 16.2763 | 50.559 |
| 16.2802 | 50.543 |
| 16.284 | 50.53 |
| 16.2879 | 50.518 |
| 16.2918 | 50.506 |
| 16.2956 | 50.494 |
| 16.2995 | 50.482 |
| 16.3033 | 50.47 |
| 16.3072 | 50.458 |
| 16.3111 | 50.447 |
| 16.314899999999998 | 50.436 |
| 16.3188 | 50.426 |
| 16.3226 | 50.415 |
| 16.3265 | 50.404 |
| 16.3304 | 50.393 |
| 16.3342 | 50.383 |
| 16.3381 | 50.373 |
| 16.3419 | 50.362 |
| 16.3458 | 50.352 |
| 16.349700000000002 | 50.342 |
| 16.3535 | 50.332 |
| 16.3574 | 50.322 |
| 16.3612 | 50.316 |
| 16.3651 | 50.311 |
| 16.369 | 50.306 |
| 16.372799999999998 | 50.3 |
| 16.3767 | 50.295 |
| 16.3806 | 50.29 |
| 16.384400000000003 | 50.287 |
| 16.3883 | 50.29 |
| 16.3921 | 50.294 |
| 16.396 | 50.298 |
| 16.399900000000002 | 50.302 |
| 16.4037 | 50.306 |
| 16.4076 | 50.31 |
| 16.4114 | 50.317 |
| 16.4153 | 50.326 |
| 16.4192 | 50.335 |
| 16.423 | 50.345 |
| 16.4269 | 50.354 |
| 16.4307 | 50.364 |
| 16.4346 | 50.373 |
| 16.4385 | 50.38 |
| 16.4423 | 50.386 |
| 16.4462 | 50.392 |
| 16.45 | 50.398 |
| 16.4539 | 50.404 |
| 16.4578 | 50.41 |
| 16.461599999999997 | 50.416 |
| 16.4655 | 50.416 |
| 16.4693 | 50.416 |
| 16.473200000000002 | 50.416 |
| 16.4771 | 50.416 |
| 16.480900000000002 | 50.416 |
| 16.4848 | 50.416 |
| 16.488599999999998 | 50.415 |
| 16.4925 | 50.41 |
| 16.4964 | 50.406 |
| 16.5002 | 50.402 |
| 16.504099999999998 | 50.398 |
| 16.508 | 50.393 |
| 16.5118 | 50.389 |
| 16.515700000000002 | 50.382 |
| 16.5195 | 50.372 |
| 16.523400000000002 | 50.361 |
| 16.5273 | 50.35 |
| 16.5311 | 50.34 |
| 16.535 | 50.329 |
| 16.5388 | 50.318 |
| 16.5427 | 50.303 |
| 16.546599999999998 | 50.285 |
| 16.5504 | 50.266 |
| 16.554299999999998 | 50.248 |
| 16.5581 | 50.229 |
| 16.562 | 50.21 |
| 16.565900000000003 | 50.192 |
| 16.5697 | 50.173 |
| 16.5736 | 50.153 |
| 16.5774 | 50.133 |
| 16.5813 | 50.113 |
| 16.5852 | 50.093 |
| 16.589 | 50.073 |
| 16.5929 | 50.054 |
| 16.596700000000002 | 50.035 |
| 16.6006 | 50.018 |
| 16.6045 | 50 |
| 16.6083 | 49.982 |
| 16.6122 | 49.965 |
| 16.616 | 49.947 |
| 16.6199 | 49.929 |
| 16.6238 | 49.909 |
| 16.627599999999997 | 49.889 |
| 16.6315 | 49.868 |
| 16.6354 | 49.848 |
| 16.639200000000002 | 49.828 |
| 16.643099999999997 | 49.807 |
| 16.646900000000002 | 49.786 |
| 16.6508 | 49.76 |
| 16.654700000000002 | 49.733 |
| 16.6585 | 49.706 |
| 16.6624 | 49.68 |
| 16.6662 | 49.653 |
| 16.670099999999998 | 49.627 |
| 16.674 | 49.599 |
| 16.677799999999998 | 49.567 |
| 16.6817 | 49.534 |
| 16.6855 | 49.502 |
| 16.689400000000003 | 49.47 |
| 16.6933 | 49.437 |
| 16.6971 | 49.405 |
| 16.701 | 49.372 |
| 16.7048 | 49.334 |
| 16.7087 | 49.296 |
| 16.7126 | 49.258 |
| 16.7164 | 49.221 |
| 16.720299999999998 | 49.183 |
| 16.7241 | 49.145 |
| 16.728 | 49.107 |
| 16.731900000000003 | 49.064 |
| 16.7357 | 49.022 |
| 16.7396 | 48.979 |
| 16.7434 | 48.937 |
| 16.7473 | 48.894 |
| 16.7512 | 48.852 |
| 16.755 | 48.809 |
| 16.7589 | 48.764 |
| 16.7628 | 48.719 |
| 16.766599999999997 | 48.675 |
| 16.7705 | 48.63 |
| 16.7743 | 48.585 |
| 16.778200000000002 | 48.54 |
| 16.7821 | 48.496 |
| 16.7859 | 48.45 |
| 16.7898 | 48.404 |
| 16.793599999999998 | 48.358 |
| 16.7975 | 48.312 |
| 16.8014 | 48.266 |
| 16.8052 | 48.22 |
| 16.809099999999997 | 48.174 |
| 16.812900000000003 | 48.124 |
| 16.8168 | 48.075 |
| 16.820700000000002 | 48.025 |
| 16.8245 | 47.976 |
| 16.828400000000002 | 47.926 |
| 16.8322 | 47.877 |
| 16.8361 | 47.827 |
| 16.84 | 47.774 |
| 16.843799999999998 | 47.72 |
| 16.8477 | 47.667 |
| 16.8515 | 47.614 |
| 16.855400000000003 | 47.56 |
| 16.859299999999998 | 47.507 |
| 16.8631 | 47.454 |
| 16.867 | 47.4 |
| 16.8708 | 47.346 |
| 16.8747 | 47.292 |
| 16.8786 | 47.238 |
| 16.8824 | 47.184 |
| 16.8863 | 47.13 |
| 16.8902 | 47.076 |
| 16.894 | 47.024 |
| 16.8979 | 46.971 |
| 16.9017 | 46.919 |
| 16.9056 | 46.866 |
| 16.9095 | 46.814 |
| 16.9133 | 46.761 |
| 16.9172 | 46.709 |
| 16.921 | 46.657 |
| 16.9249 | 46.606 |
| 16.9288 | 46.555 |
| 16.932599999999997 | 46.504 |
| 16.9365 | 46.452 |
| 16.9403 | 46.401 |
| 16.944200000000002 | 46.35 |
| 16.9481 | 46.299 |
| 16.951900000000002 | 46.247 |
| 16.9558 | 46.195 |
| 16.9596 | 46.143 |
| 16.9635 | 46.092 |
| 16.9674 | 46.04 |
| 16.9712 | 45.988 |
| 16.975099999999998 | 45.935 |
| 16.978900000000003 | 45.879 |
| 16.9828 | 45.824 |
| 16.9867 | 45.768 |
| 16.9905 | 45.712 |
| 16.994400000000002 | 45.657 |
| 16.9982 | 45.601 |
| 17.0021 | 45.545 |
| 17.006 | 45.485 |
| 17.0098 | 45.424 |
| 17.0137 | 45.364 |
| 17.017599999999998 | 45.304 |
| 17.0214 | 45.244 |
| 17.025299999999998 | 45.184 |
| 17.0291 | 45.124 |
| 17.033 | 45.06 |
| 17.036900000000003 | 44.997 |
| 17.0407 | 44.934 |
| 17.0446 | 44.87 |
| 17.0484 | 44.807 |
| 17.0523 | 44.743 |
| 17.0562 | 44.68 |
| 17.06 | 44.615 |
| 17.0639 | 44.548 |
| 17.067700000000002 | 44.482 |
| 17.0716 | 44.416 |
| 17.0755 | 44.349 |
| 17.0793 | 44.283 |
| 17.0832 | 44.217 |
| 17.087 | 44.149 |
| 17.0909 | 44.08 |
| 17.0948 | 44.01 |
| 17.098599999999998 | 43.94 |
| 17.1025 | 43.871 |
| 17.1063 | 43.801 |
| 17.1102 | 43.732 |
| 17.114099999999997 | 43.662 |
| 17.117900000000002 | 43.592 |
| 17.1218 | 43.523 |
| 17.1256 | 43.453 |
| 17.1295 | 43.383 |
| 17.1334 | 43.314 |
| 17.1372 | 43.244 |
| 17.141099999999998 | 43.175 |
| 17.145 | 43.113 |
| 17.148799999999998 | 43.054 |
| 17.1527 | 42.994 |
| 17.1565 | 42.935 |
| 17.160400000000003 | 42.875 |
| 17.1643 | 42.816 |
| 17.1681 | 42.757 |
| 17.172 | 42.704 |
| 17.1758 | 42.661 |
| 17.1797 | 42.618 |
| 17.1836 | 42.575 |
| 17.1874 | 42.532 |
| 17.1913 | 42.489 |
| 17.1951 | 42.446 |
| 17.199 | 42.404 |
| 17.202900000000003 | 42.366 |
| 17.2067 | 42.329 |
| 17.2106 | 42.292 |
| 17.2144 | 42.255 |
| 17.2183 | 42.218 |
| 17.2222 | 42.181 |
| 17.226 | 42.144 |
| 17.2299 | 42.103 |
| 17.233700000000002 | 42.059 |
| 17.237599999999997 | 42.014 |
| 17.2415 | 41.97 |
| 17.2453 | 41.926 |
| 17.249200000000002 | 41.882 |
| 17.253 | 41.838 |
| 17.2569 | 41.793 |
| 17.2608 | 41.742 |
| 17.264599999999998 | 41.691 |
| 17.2685 | 41.64 |
| 17.2724 | 41.59 |
| 17.2762 | 41.539 |
| 17.280099999999997 | 41.488 |
| 17.283900000000003 | 41.437 |
| 17.2878 | 41.387 |
| 17.291700000000002 | 41.337 |
| 17.2955 | 41.287 |
| 17.299400000000002 | 41.237 |
| 17.3032 | 41.187 |
| 17.3071 | 41.137 |
| 17.311 | 41.087 |
| 17.314799999999998 | 41.038 |
| 17.3187 | 40.993 |
| 17.3225 | 40.949 |
| 17.326400000000003 | 40.904 |
| 17.330299999999998 | 40.859 |
| 17.3341 | 40.815 |
| 17.338 | 40.77 |
| 17.3418 | 40.725 |
| 17.3457 | 40.687 |
| 17.3496 | 40.651 |
| 17.3534 | 40.614 |
| 17.3573 | 40.578 |
| 17.361099999999997 | 40.541 |
| 17.365 | 40.505 |
| 17.3689 | 40.469 |
| 17.372700000000002 | 40.435 |
| 17.3766 | 40.408 |
| 17.3804 | 40.382 |
| 17.3843 | 40.355 |
| 17.3882 | 40.328 |
| 17.392 | 40.302 |
| 17.3959 | 40.275 |
| 17.3997 | 40.249 |
| 17.403599999999997 | 40.226 |
| 17.4075 | 40.206 |
| 17.4113 | 40.186 |
| 17.415200000000002 | 40.166 |
| 17.4191 | 40.146 |
| 17.422900000000002 | 40.126 |
| 17.4268 | 40.105 |
| 17.4306 | 40.085 |
| 17.4345 | 40.066 |
| 17.4384 | 40.046 |
| 17.4422 | 40.026 |
| 17.446099999999998 | 40.007 |
| 17.449900000000003 | 39.987 |
| 17.453799999999998 | 39.967 |
| 17.4577 | 39.948 |
| 17.4615 | 39.928 |
| 17.465400000000002 | 39.908 |
| 17.4692 | 39.887 |
| 17.4731 | 39.867 |
| 17.477 | 39.847 |
| 17.4808 | 39.827 |
| 17.4847 | 39.807 |
| 17.4885 | 39.786 |
| 17.4924 | 39.769 |
| 17.496299999999998 | 39.752 |
| 17.5001 | 39.734 |
| 17.504 | 39.717 |
| 17.5078 | 39.7 |
| 17.5117 | 39.683 |
| 17.5156 | 39.665 |
| 17.5194 | 39.649 |
| 17.5233 | 39.634 |
| 17.527099999999997 | 39.62 |
| 17.531 | 39.606 |
| 17.5349 | 39.591 |
| 17.538700000000002 | 39.577 |
| 17.5426 | 39.562 |
| 17.5465 | 39.548 |
| 17.5503 | 39.532 |
| 17.5542 | 39.516 |
| 17.558 | 39.5 |
| 17.5619 | 39.484 |
| 17.5658 | 39.467 |
| 17.569599999999998 | 39.451 |
| 17.5735 | 39.435 |
| 17.5773 | 39.418 |
| 17.5812 | 39.4 |
| 17.585099999999997 | 39.38 |
| 17.588900000000002 | 39.361 |
| 17.5928 | 39.341 |
| 17.5966 | 39.322 |
| 17.6005 | 39.303 |
| 17.604400000000002 | 39.283 |
| 17.6082 | 39.264 |
| 17.612099999999998 | 39.246 |
| 17.6159 | 39.228 |
| 17.619799999999998 | 39.21 |
| 17.6237 | 39.191 |
| 17.6275 | 39.173 |
| 17.631400000000003 | 39.155 |
| 17.6352 | 39.137 |
| 17.6391 | 39.12 |
| 17.643 | 39.106 |
| 17.6468 | 39.092 |
| 17.6507 | 39.078 |
| 17.6545 | 39.064 |
| 17.6584 | 39.05 |
| 17.6623 | 39.037 |
| 17.6661 | 39.023 |
| 17.67 | 39.01 |
| 17.6739 | 38.999 |
| 17.6777 | 38.987 |
| 17.6816 | 38.976 |
| 17.6854 | 38.964 |
| 17.6893 | 38.953 |
| 17.6932 | 38.941 |
| 17.697 | 38.929 |
| 17.7009 | 38.917 |
| 17.7047 | 38.904 |
| 17.708599999999997 | 38.892 |
| 17.7125 | 38.879 |
| 17.7163 | 38.866 |
| 17.720200000000002 | 38.853 |
| 17.724 | 38.84 |
| 17.7279 | 38.828 |
| 17.7318 | 38.812 |
| 17.735599999999998 | 38.797 |
| 17.7395 | 38.781 |
| 17.743299999999998 | 38.766 |
| 17.7472 | 38.751 |
| 17.751099999999997 | 38.735 |
| 17.754900000000003 | 38.72 |
| 17.7588 | 38.704 |
| 17.7626 | 38.688 |
| 17.7665 | 38.672 |
| 17.770400000000002 | 38.656 |
| 17.7742 | 38.64 |
| 17.7781 | 38.623 |
| 17.7819 | 38.607 |
| 17.7858 | 38.591 |
| 17.7897 | 38.575 |
| 17.7935 | 38.56 |
| 17.797400000000003 | 38.545 |
| 17.801299999999998 | 38.53 |
| 17.8051 | 38.515 |
| 17.809 | 38.5 |
| 17.8128 | 38.485 |
| 17.8167 | 38.47 |
| 17.8206 | 38.455 |
| 17.8244 | 38.441 |
| 17.8283 | 38.428 |
| 17.832099999999997 | 38.414 |
| 17.836 | 38.4 |
| 17.8399 | 38.387 |
| 17.843700000000002 | 38.373 |
| 17.8476 | 38.36 |
| 17.8514 | 38.347 |
| 17.8553 | 38.336 |
| 17.8592 | 38.325 |
| 17.863 | 38.314 |
| 17.8669 | 38.303 |
| 17.8707 | 38.292 |
| 17.874599999999997 | 38.28 |
| 17.8785 | 38.27 |
| 17.8823 | 38.258 |
| 17.886200000000002 | 38.248 |
| 17.89 | 38.237 |
| 17.893900000000002 | 38.227 |
| 17.8978 | 38.216 |
| 17.9016 | 38.206 |
| 17.9055 | 38.195 |
| 17.909299999999998 | 38.185 |
| 17.9132 | 38.172 |
| 17.917099999999998 | 38.157 |
| 17.920900000000003 | 38.142 |
| 17.924799999999998 | 38.127 |
| 17.9287 | 38.112 |
| 17.9325 | 38.097 |
| 17.936400000000003 | 38.082 |
| 17.9402 | 38.067 |
| 17.9441 | 38.05 |
| 17.948 | 38.029 |
| 17.9518 | 38.009 |
| 17.9557 | 37.988 |
| 17.9595 | 37.968 |
| 17.9634 | 37.948 |
| 17.967299999999998 | 37.927 |
| 17.9711 | 37.907 |
| 17.975 | 37.886 |
| 17.9788 | 37.864 |
| 17.9827 | 37.841 |
| 17.9866 | 37.818 |
| 17.9904 | 37.796 |
| 17.9943 | 37.774 |
| 17.998099999999997 | 37.751 |
| 18.002 | 37.729 |
| 18.0059 | 37.706 |
| 18.009700000000002 | 37.683 |
| 18.0136 | 37.66 |
| 18.017400000000002 | 37.638 |
| 18.0213 | 37.614 |
| 18.0252 | 37.592 |
| 18.029 | 37.569 |
| 18.0329 | 37.546 |
| 18.0367 | 37.523 |
| 18.040599999999998 | 37.501 |
| 18.0445 | 37.478 |
| 18.048299999999998 | 37.456 |
| 18.0522 | 37.433 |
| 18.056099999999997 | 37.411 |
| 18.059900000000003 | 37.388 |
| 18.0638 | 37.366 |
| 18.0676 | 37.343 |
| 18.0715 | 37.321 |
| 18.075400000000002 | 37.298 |
| 18.0792 | 37.276 |
| 18.083099999999998 | 37.253 |
| 18.0869 | 37.231 |
| 18.090799999999998 | 37.208 |
| 18.0947 | 37.186 |
| 18.0985 | 37.163 |
| 18.102400000000003 | 37.138 |
| 18.1062 | 37.113 |
| 18.1101 | 37.088 |
| 18.114 | 37.063 |
| 18.1178 | 37.037 |
| 18.1217 | 37.012 |
| 18.1255 | 36.987 |
| 18.1294 | 36.961 |
| 18.1333 | 36.934 |
| 18.1371 | 36.906 |
| 18.141 | 36.877 |
| 18.1448 | 36.848 |
| 18.1487 | 36.82 |
| 18.1526 | 36.792 |
| 18.1564 | 36.763 |
| 18.1603 | 36.735 |
| 18.164099999999998 | 36.706 |
| 18.168 | 36.677 |
| 18.1719 | 36.648 |
| 18.1757 | 36.619 |
| 18.179599999999997 | 36.59 |
| 18.1835 | 36.562 |
| 18.1873 | 36.533 |
| 18.191200000000002 | 36.504 |
| 18.195 | 36.475 |
| 18.198900000000002 | 36.446 |
| 18.2028 | 36.417 |
| 18.206599999999998 | 36.387 |
| 18.2105 | 36.358 |
| 18.214299999999998 | 36.329 |
| 18.2182 | 36.3 |
| 18.222099999999998 | 36.271 |
| 18.225900000000003 | 36.242 |
| 18.2298 | 36.209 |
| 18.2336 | 36.176 |
| 18.2375 | 36.143 |
| 18.241400000000002 | 36.11 |
| 18.2452 | 36.076 |
| 18.2491 | 36.043 |
| 18.2529 | 36.01 |
| 18.2568 | 35.977 |
| 18.2607 | 35.941 |
| 18.2645 | 35.903 |
| 18.2684 | 35.865 |
| 18.2722 | 35.827 |
| 18.2761 | 35.789 |
| 18.28 | 35.752 |
| 18.2838 | 35.714 |
| 18.2877 | 35.676 |
| 18.2915 | 35.638 |
| 18.2954 | 35.598 |
| 18.2993 | 35.56 |
| 18.303099999999997 | 35.52 |
| 18.307 | 35.481 |
| 18.3109 | 35.442 |
| 18.314700000000002 | 35.404 |
| 18.3186 | 35.364 |
| 18.322400000000002 | 35.326 |
| 18.3263 | 35.286 |
| 18.3302 | 35.246 |
| 18.334 | 35.207 |
| 18.3379 | 35.167 |
| 18.3417 | 35.128 |
| 18.345599999999997 | 35.088 |
| 18.3495 | 35.049 |
| 18.3533 | 35.009 |
| 18.357200000000002 | 34.969 |
| 18.361 | 34.928 |
| 18.364900000000002 | 34.886 |
| 18.3688 | 34.844 |
| 18.3726 | 34.803 |
| 18.3765 | 34.762 |
| 18.3803 | 34.72 |
| 18.3842 | 34.679 |
| 18.388099999999998 | 34.637 |
| 18.3919 | 34.598 |
| 18.395799999999998 | 34.56 |
| 18.3996 | 34.522 |
| 18.4035 | 34.483 |
| 18.407400000000003 | 34.445 |
| 18.4112 | 34.406 |
| 18.4151 | 34.368 |
| 18.4189 | 34.329 |
| 18.4228 | 34.295 |
| 18.4267 | 34.264 |
| 18.4305 | 34.233 |
| 18.4344 | 34.202 |
| 18.438299999999998 | 34.171 |
| 18.4421 | 34.14 |
| 18.446 | 34.11 |
| 18.4498 | 34.079 |
| 18.4537 | 34.048 |
| 18.4576 | 34.018 |
| 18.4614 | 33.988 |
| 18.4653 | 33.957 |
| 18.469099999999997 | 33.927 |
| 18.473 | 33.897 |
| 18.4769 | 33.867 |
| 18.480700000000002 | 33.837 |
| 18.484599999999997 | 33.807 |
| 18.488400000000002 | 33.773 |
| 18.4923 | 33.736 |
| 18.4962 | 33.698 |
| 18.5 | 33.661 |
| 18.5039 | 33.624 |
| 18.5077 | 33.586 |
| 18.511599999999998 | 33.549 |
| 18.5155 | 33.512 |
| 18.519299999999998 | 33.475 |
| 18.5232 | 33.431 |
| 18.527 | 33.387 |
| 18.530900000000003 | 33.342 |
| 18.5348 | 33.298 |
| 18.5386 | 33.254 |
| 18.5425 | 33.21 |
| 18.5463 | 33.165 |
| 18.5502 | 33.121 |
| 18.5541 | 33.076 |
| 18.5579 | 33.028 |
| 18.561799999999998 | 32.981 |
| 18.5657 | 32.933 |
| 18.5695 | 32.886 |
| 18.573400000000003 | 32.838 |
| 18.5772 | 32.791 |
| 18.5811 | 32.744 |
| 18.585 | 32.696 |
| 18.5888 | 32.65 |
| 18.5927 | 32.603 |
| 18.5965 | 32.557 |
| 18.6004 | 32.51 |
| 18.6043 | 32.464 |
| 18.6081 | 32.417 |
| 18.612 | 32.371 |
| 18.6158 | 32.325 |
| 18.6197 | 32.279 |
| 18.6236 | 32.237 |
| 18.6274 | 32.196 |
| 18.6313 | 32.154 |
| 18.635099999999998 | 32.113 |
| 18.639 | 32.072 |
| 18.6429 | 32.03 |
| 18.6467 | 31.989 |
| 18.650599999999997 | 31.948 |
| 18.654400000000003 | 31.908 |
| 18.6583 | 31.87 |
| 18.662200000000002 | 31.832 |
| 18.666 | 31.795 |
| 18.669900000000002 | 31.757 |
| 18.6737 | 31.719 |
| 18.677599999999998 | 31.682 |
| 18.6815 | 31.644 |
| 18.685299999999998 | 31.606 |
| 18.6892 | 31.568 |
| 18.693099999999998 | 31.529 |
| 18.696900000000003 | 31.49 |
| 18.7008 | 31.45 |
| 18.7046 | 31.412 |
| 18.7085 | 31.372 |
| 18.712400000000002 | 31.334 |
| 18.7162 | 31.295 |
| 18.7201 | 31.256 |
| 18.7239 | 31.212 |
| 18.7278 | 31.167 |
| 18.7317 | 31.123 |
| 18.7355 | 31.078 |
| 18.7394 | 31.034 |
| 18.7432 | 30.99 |
| 18.7471 | 30.946 |
| 18.751 | 30.901 |
| 18.7548 | 30.855 |
| 18.7587 | 30.804 |
| 18.7625 | 30.753 |
| 18.7664 | 30.701 |
| 18.7703 | 30.65 |
| 18.774099999999997 | 30.599 |
| 18.778 | 30.547 |
| 18.7818 | 30.496 |
| 18.785700000000002 | 30.445 |
| 18.7896 | 30.391 |
| 18.793400000000002 | 30.334 |
| 18.7973 | 30.277 |
| 18.801099999999998 | 30.22 |
| 18.805 | 30.164 |
| 18.8089 | 30.107 |
| 18.8127 | 30.05 |
| 18.816599999999998 | 29.993 |
| 18.8205 | 29.937 |
| 18.8243 | 29.879 |
| 18.828200000000002 | 29.821 |
| 18.832 | 29.763 |
| 18.835900000000002 | 29.705 |
| 18.8398 | 29.646 |
| 18.8436 | 29.588 |
| 18.8475 | 29.53 |
| 18.8513 | 29.472 |
| 18.8552 | 29.414 |
| 18.859099999999998 | 29.358 |
| 18.8629 | 29.302 |
| 18.866799999999998 | 29.246 |
| 18.8706 | 29.19 |
| 18.8745 | 29.134 |
| 18.878400000000003 | 29.078 |
| 18.8822 | 29.022 |
| 18.8861 | 28.966 |
| 18.8899 | 28.91 |
| 18.8938 | 28.856 |
| 18.8977 | 28.802 |
| 18.9015 | 28.748 |
| 18.9054 | 28.694 |
| 18.909200000000002 | 28.641 |
| 18.9131 | 28.587 |
| 18.917 | 28.534 |
| 18.9208 | 28.48 |
| 18.9247 | 28.426 |
| 18.9285 | 28.372 |
| 18.9324 | 28.317 |
| 18.9363 | 28.262 |
| 18.940099999999997 | 28.208 |
| 18.944 | 28.153 |
| 18.9479 | 28.098 |
| 18.951700000000002 | 28.044 |
| 18.955599999999997 | 27.989 |
| 18.959400000000002 | 27.934 |
| 18.9633 | 27.874 |
| 18.967200000000002 | 27.814 |
| 18.971 | 27.754 |
| 18.9749 | 27.693 |
| 18.9787 | 27.633 |
| 18.982599999999998 | 27.573 |
| 18.9865 | 27.512 |
| 18.990299999999998 | 27.452 |
| 18.9942 | 27.392 |
| 18.998 | 27.327 |
| 19.001900000000003 | 27.261 |
| 19.0058 | 27.196 |
| 19.0096 | 27.13 |
| 19.0135 | 27.065 |
| 19.0173 | 27 |
| 19.0212 | 26.934 |
| 19.0251 | 26.869 |
| 19.0289 | 26.804 |
| 19.032799999999998 | 26.739 |
| 19.0366 | 26.675 |
| 19.0405 | 26.611 |
| 19.044400000000003 | 26.546 |
| 19.0482 | 26.482 |
| 19.0521 | 26.418 |
| 19.0559 | 26.353 |
| 19.0598 | 26.289 |
| 19.0637 | 26.225 |
| 19.0675 | 26.162 |
| 19.0714 | 26.099 |
| 19.0753 | 26.036 |
| 19.079099999999997 | 25.974 |
| 19.083 | 25.911 |
| 19.0868 | 25.848 |
| 19.090700000000002 | 25.786 |
| 19.0946 | 25.723 |
| 19.0984 | 25.66 |
| 19.1023 | 25.598 |
| 19.106099999999998 | 25.536 |
| 19.11 | 25.474 |
| 19.1139 | 25.412 |
| 19.1177 | 25.35 |
| 19.121599999999997 | 25.288 |
| 19.125400000000003 | 25.225 |
| 19.1293 | 25.163 |
| 19.133200000000002 | 25.101 |
| 19.137 | 25.043 |
| 19.140900000000002 | 24.987 |
| 19.1447 | 24.931 |
| 19.1486 | 24.876 |
| 19.1525 | 24.82 |
| 19.156299999999998 | 24.764 |
| 19.1602 | 24.708 |
| 19.164 | 24.652 |
| 19.167900000000003 | 24.596 |
| 19.171799999999998 | 24.544 |
| 19.1756 | 24.496 |
| 19.1795 | 24.447 |
| 19.1833 | 24.399 |
| 19.1872 | 24.35 |
| 19.1911 | 24.302 |
| 19.1949 | 24.253 |
| 19.1988 | 24.205 |
| 19.2027 | 24.157 |
| 19.2065 | 24.107 |
| 19.2104 | 24.054 |
| 19.2142 | 24.001 |
| 19.2181 | 23.948 |
| 19.222 | 23.894 |
| 19.2258 | 23.841 |
| 19.2297 | 23.788 |
| 19.2335 | 23.735 |
| 19.2374 | 23.682 |
| 19.2413 | 23.628 |
| 19.245099999999997 | 23.563 |
| 19.249 | 23.498 |
| 19.2528 | 23.433 |
| 19.256700000000002 | 23.368 |
| 19.2606 | 23.303 |
| 19.264400000000002 | 23.238 |
| 19.2683 | 23.173 |
| 19.2721 | 23.108 |
| 19.276 | 23.043 |
| 19.2799 | 22.974 |
| 19.2837 | 22.903 |
| 19.287599999999998 | 22.833 |
| 19.291400000000003 | 22.763 |
| 19.2953 | 22.693 |
| 19.2992 | 22.623 |
| 19.303 | 22.552 |
| 19.306900000000002 | 22.482 |
| 19.3107 | 22.412 |
| 19.3146 | 22.344 |
| 19.3185 | 22.276 |
| 19.3223 | 22.209 |
| 19.3262 | 22.141 |
| 19.330099999999998 | 22.074 |
| 19.3339 | 22.007 |
| 19.337799999999998 | 21.939 |
| 19.3416 | 21.872 |
| 19.3455 | 21.805 |
| 19.349400000000003 | 21.738 |
| 19.3532 | 21.676 |
| 19.3571 | 21.614 |
| 19.3609 | 21.552 |
| 19.3648 | 21.489 |
| 19.3687 | 21.427 |
| 19.3725 | 21.365 |
| 19.3764 | 21.302 |
| 19.380200000000002 | 21.24 |
| 19.3841 | 21.178 |
| 19.388 | 21.119 |
| 19.3918 | 21.06 |
| 19.3957 | 21.002 |
| 19.3995 | 20.943 |
| 19.4034 | 20.885 |
| 19.4073 | 20.827 |
| 19.411099999999998 | 20.768 |
| 19.415 | 20.71 |
| 19.4188 | 20.652 |
| 19.4227 | 20.593 |
| 19.426599999999997 | 20.533 |
| 19.430400000000002 | 20.474 |
| 19.4343 | 20.414 |
| 19.4381 | 20.355 |
| 19.442 | 20.296 |
| 19.4459 | 20.236 |
| 19.4497 | 20.177 |
| 19.453599999999998 | 20.118 |
| 19.4575 | 20.058 |
| 19.461299999999998 | 19.993 |
| 19.4652 | 19.928 |
| 19.469 | 19.863 |
| 19.472900000000003 | 19.798 |
| 19.4768 | 19.733 |
| 19.4806 | 19.668 |
| 19.4845 | 19.603 |
| 19.4883 | 19.538 |
| 19.4922 | 19.473 |
| 19.4961 | 19.405 |
| 19.4999 | 19.335 |
| 19.5038 | 19.264 |
| 19.5076 | 19.194 |
| 19.5115 | 19.123 |
| 19.515400000000003 | 19.053 |
| 19.5192 | 18.982 |
| 19.5231 | 18.912 |
| 19.5269 | 18.841 |
| 19.5308 | 18.771 |
| 19.5347 | 18.698 |
| 19.5385 | 18.624 |
| 19.5424 | 18.551 |
| 19.546200000000002 | 18.478 |
| 19.550099999999997 | 18.404 |
| 19.554 | 18.331 |
| 19.5578 | 18.258 |
| 19.561700000000002 | 18.185 |
| 19.5655 | 18.112 |
| 19.5694 | 18.038 |
| 19.5733 | 17.962 |
| 19.577099999999998 | 17.887 |
| 19.581 | 17.812 |
| 19.5849 | 17.736 |
| 19.5887 | 17.661 |
| 19.592599999999997 | 17.586 |
| 19.596400000000003 | 17.511 |
| 19.6003 | 17.436 |
| 19.604200000000002 | 17.36 |
| 19.608 | 17.284 |
| 19.611900000000002 | 17.208 |
| 19.6157 | 17.132 |
| 19.6196 | 17.056 |
| 19.6235 | 16.979 |
| 19.627299999999998 | 16.903 |
| 19.6312 | 16.827 |
| 19.635 | 16.751 |
| 19.638900000000003 | 16.675 |
| 19.642799999999998 | 16.599 |
| 19.6466 | 16.524 |
| 19.6505 | 16.448 |
| 19.6543 | 16.373 |
| 19.6582 | 16.297 |
| 19.6621 | 16.222 |
| 19.6659 | 16.146 |
| 19.6698 | 16.071 |
| 19.673599999999997 | 15.995 |
| 19.6775 | 15.92 |
| 19.6814 | 15.844 |
| 19.685200000000002 | 15.768 |
| 19.6891 | 15.692 |
| 19.6929 | 15.617 |
| 19.6968 | 15.541 |
| 19.7007 | 15.465 |
| 19.7045 | 15.389 |
| 19.7084 | 15.314 |
| 19.7123 | 15.238 |
| 19.716099999999997 | 15.162 |
| 19.72 | 15.084 |
| 19.7238 | 15.005 |
| 19.727700000000002 | 14.926 |
| 19.7316 | 14.848 |
| 19.735400000000002 | 14.769 |
| 19.7393 | 14.691 |
| 19.7431 | 14.612 |
| 19.747 | 14.534 |
| 19.7509 | 14.455 |
| 19.7547 | 14.376 |
| 19.758599999999998 | 14.297 |
| 19.762400000000003 | 14.217 |
| 19.766299999999998 | 14.138 |
| 19.7702 | 14.058 |
| 19.774 | 13.979 |
| 19.777900000000002 | 13.899 |
| 19.7817 | 13.82 |
| 19.7856 | 13.74 |
| 19.7895 | 13.661 |
| 19.7933 | 13.582 |
| 19.7972 | 13.505 |
| 19.801 | 13.427 |
| 19.8049 | 13.35 |
| 19.808799999999998 | 13.272 |
| 19.8126 | 13.195 |
| 19.8165 | 13.118 |
| 19.8203 | 13.04 |
| 19.8242 | 12.963 |
| 19.8281 | 12.886 |
| 19.8319 | 12.81 |
| 19.8358 | 12.736 |
| 19.8397 | 12.661 |
| 19.8435 | 12.586 |
| 19.8474 | 12.512 |
| 19.851200000000002 | 12.437 |
| 19.8551 | 12.363 |
| 19.859 | 12.289 |
| 19.8628 | 12.214 |
| 19.8667 | 12.14 |
| 19.8705 | 12.068 |
| 19.8744 | 11.998 |
| 19.8783 | 11.927 |
| 19.882099999999998 | 11.856 |
| 19.886 | 11.786 |
| 19.8898 | 11.715 |
| 19.8937 | 11.645 |
| 19.897599999999997 | 11.574 |
| 19.901400000000002 | 11.504 |
| 19.9053 | 11.434 |
| 19.9091 | 11.368 |
| 19.913 | 11.304 |
| 19.916900000000002 | 11.24 |
| 19.9207 | 11.176 |
| 19.924599999999998 | 11.112 |
| 19.9284 | 11.048 |
| 19.932299999999998 | 10.984 |
| 19.9362 | 10.92 |
| 19.94 | 10.856 |
| 19.943900000000003 | 10.792 |
| 19.9477 | 10.731 |
| 19.9516 | 10.671 |
| 19.9555 | 10.611 |
| 19.9593 | 10.551 |
| 19.9632 | 10.491 |
| 19.9671 | 10.431 |
| 19.9709 | 10.371 |
| 19.9748 | 10.311 |
| 19.9786 | 10.251 |
| 19.9825 | 10.191 |
| 19.9864 | 10.131 |
| 19.9902 | 10.07 |
| 19.9941 | 10.01 |
| 19.9979 | 9.95 |
| 20.0018 | 9.89 |
| 20.0057 | 9.83 |